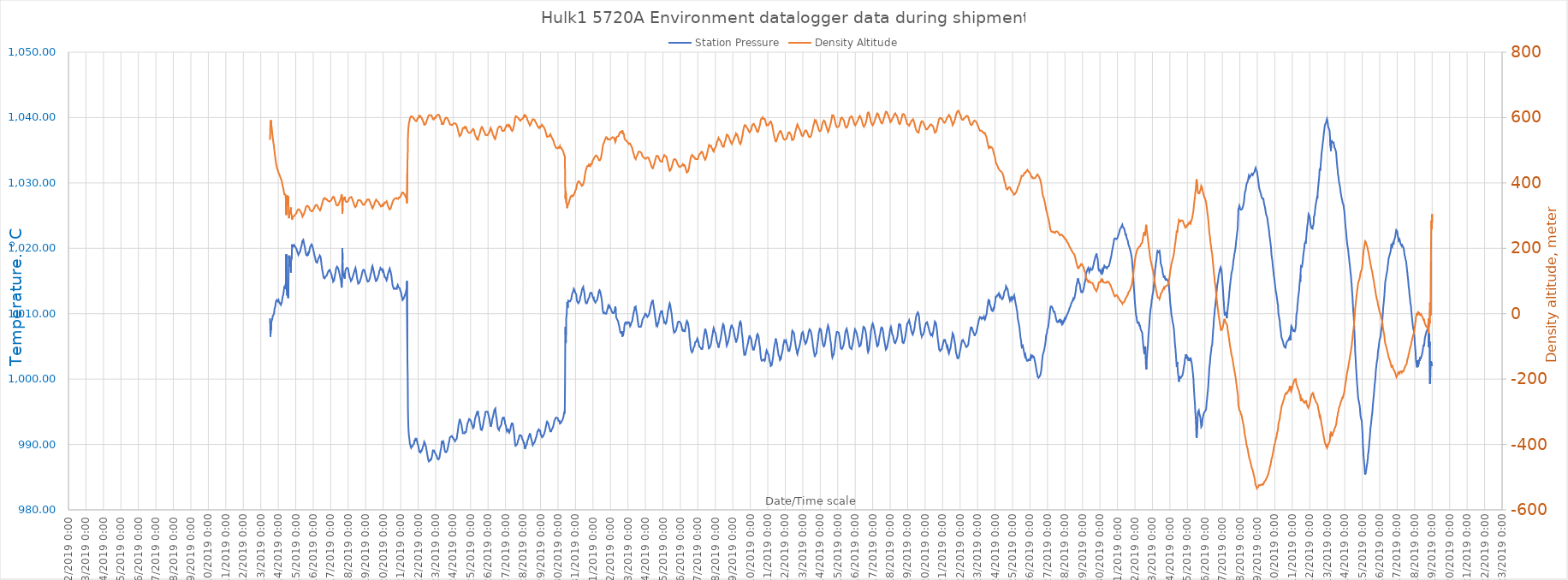
| Category | Station Pressure |
|---|---|
| 43751.52777777778 | 1009.3 |
| 43751.541666666664 | 1009.3 |
| 43751.555555555555 | 1006.5 |
| 43751.569444444445 | 1008 |
| 43751.583333333336 | 1007.5 |
| 43751.59722222222 | 1008.5 |
| 43751.61111111111 | 1008.8 |
| 43751.625 | 1008.8 |
| 43751.63888888889 | 1009 |
| 43751.65277777778 | 1009.1 |
| 43751.666666666664 | 1009.3 |
| 43751.680555555555 | 1009.6 |
| 43751.694444444445 | 1009.6 |
| 43751.708333333336 | 1009.7 |
| 43751.72222222222 | 1009.8 |
| 43751.73611111111 | 1009.8 |
| 43751.75 | 1009.9 |
| 43751.76388888889 | 1010.1 |
| 43751.77777777778 | 1010.6 |
| 43751.791666666664 | 1010.6 |
| 43751.805555555555 | 1010.9 |
| 43751.819444444445 | 1011 |
| 43751.833333333336 | 1011.2 |
| 43751.84722222222 | 1011.5 |
| 43751.86111111111 | 1011.6 |
| 43751.875 | 1011.9 |
| 43751.88888888889 | 1012 |
| 43751.90277777778 | 1012 |
| 43751.916666666664 | 1012.1 |
| 43751.930555555555 | 1012.2 |
| 43751.944444444445 | 1012.1 |
| 43751.958333333336 | 1012.1 |
| 43751.97222222222 | 1011.9 |
| 43751.98611111111 | 1011.8 |
| 43752.0 | 1011.9 |
| 43752.01388888889 | 1012.1 |
| 43752.02777777778 | 1012.1 |
| 43752.041666666664 | 1011.8 |
| 43752.055555555555 | 1011.7 |
| 43752.069444444445 | 1011.8 |
| 43752.083333333336 | 1011.6 |
| 43752.09722222222 | 1011.6 |
| 43752.11111111111 | 1011.6 |
| 43752.125 | 1011.6 |
| 43752.13888888889 | 1011.4 |
| 43752.15277777778 | 1011.7 |
| 43752.166666666664 | 1011.5 |
| 43752.180555555555 | 1011.6 |
| 43752.194444444445 | 1011.7 |
| 43752.208333333336 | 1011.9 |
| 43752.22222222222 | 1012.1 |
| 43752.23611111111 | 1012.3 |
| 43752.25 | 1012.6 |
| 43752.26388888889 | 1012.6 |
| 43752.27777777778 | 1012.8 |
| 43752.291666666664 | 1013 |
| 43752.305555555555 | 1013.3 |
| 43752.319444444445 | 1013.4 |
| 43752.333333333336 | 1013.8 |
| 43752.34722222222 | 1014.2 |
| 43752.36111111111 | 1014.2 |
| 43752.375 | 1014 |
| 43752.38888888889 | 1013.8 |
| 43752.40277777778 | 1013.7 |
| 43752.416666666664 | 1013.9 |
| 43752.430555555555 | 1014.6 |
| 43752.444444444445 | 1014.2 |
| 43752.458333333336 | 1019.1 |
| 43752.47222222222 | 1013.9 |
| 43752.48611111111 | 1013.5 |
| 43752.5 | 1012.8 |
| 43752.51388888889 | 1013 |
| 43752.52777777778 | 1013.1 |
| 43752.541666666664 | 1013.3 |
| 43752.555555555555 | 1013.8 |
| 43752.569444444445 | 1012.4 |
| 43752.583333333336 | 1014.2 |
| 43752.59722222222 | 1017.4 |
| 43752.61111111111 | 1018.9 |
| 43752.625 | 1018.3 |
| 43752.63888888889 | 1018 |
| 43752.65277777778 | 1018.1 |
| 43752.666666666664 | 1017.7 |
| 43752.680555555555 | 1017.7 |
| 43752.694444444445 | 1017.2 |
| 43752.708333333336 | 1017.5 |
| 43752.72222222222 | 1016.3 |
| 43752.73611111111 | 1018.3 |
| 43752.75 | 1018.7 |
| 43752.76388888889 | 1018.4 |
| 43752.77777777778 | 1019.4 |
| 43752.791666666664 | 1020.6 |
| 43752.805555555555 | 1020.2 |
| 43752.819444444445 | 1020.1 |
| 43752.833333333336 | 1020.1 |
| 43752.84722222222 | 1020.1 |
| 43752.86111111111 | 1020.3 |
| 43752.875 | 1020.3 |
| 43752.88888888889 | 1020.3 |
| 43752.90277777778 | 1020.5 |
| 43752.916666666664 | 1020.6 |
| 43752.930555555555 | 1020.6 |
| 43752.944444444445 | 1020.3 |
| 43752.958333333336 | 1020.4 |
| 43752.97222222222 | 1020.4 |
| 43752.98611111111 | 1020.2 |
| 43753.0 | 1020.1 |
| 43753.01388888889 | 1020 |
| 43753.02777777778 | 1020.1 |
| 43753.041666666664 | 1019.9 |
| 43753.055555555555 | 1019.9 |
| 43753.069444444445 | 1019.7 |
| 43753.083333333336 | 1019.6 |
| 43753.09722222222 | 1019.4 |
| 43753.11111111111 | 1019.4 |
| 43753.125 | 1019.2 |
| 43753.13888888889 | 1019.1 |
| 43753.15277777778 | 1019 |
| 43753.166666666664 | 1019.1 |
| 43753.180555555555 | 1019.2 |
| 43753.194444444445 | 1019.1 |
| 43753.208333333336 | 1019.2 |
| 43753.22222222222 | 1019.3 |
| 43753.23611111111 | 1019.4 |
| 43753.25 | 1019.5 |
| 43753.26388888889 | 1019.5 |
| 43753.27777777778 | 1019.5 |
| 43753.291666666664 | 1020 |
| 43753.305555555555 | 1020.2 |
| 43753.319444444445 | 1020.3 |
| 43753.333333333336 | 1020.4 |
| 43753.34722222222 | 1020.6 |
| 43753.36111111111 | 1020.8 |
| 43753.375 | 1021.1 |
| 43753.38888888889 | 1021 |
| 43753.40277777778 | 1021.2 |
| 43753.416666666664 | 1021.2 |
| 43753.430555555555 | 1021.3 |
| 43753.444444444445 | 1021.2 |
| 43753.458333333336 | 1021 |
| 43753.47222222222 | 1020.8 |
| 43753.48611111111 | 1020.6 |
| 43753.5 | 1020.4 |
| 43753.51388888889 | 1020.3 |
| 43753.52777777778 | 1020.1 |
| 43753.541666666664 | 1019.8 |
| 43753.555555555555 | 1019.5 |
| 43753.569444444445 | 1019.5 |
| 43753.583333333336 | 1019.2 |
| 43753.59722222222 | 1019 |
| 43753.61111111111 | 1019.1 |
| 43753.625 | 1018.9 |
| 43753.63888888889 | 1018.9 |
| 43753.65277777778 | 1018.9 |
| 43753.666666666664 | 1018.8 |
| 43753.680555555555 | 1019.1 |
| 43753.694444444445 | 1018.9 |
| 43753.708333333336 | 1019.2 |
| 43753.72222222222 | 1019.4 |
| 43753.73611111111 | 1019.2 |
| 43753.75 | 1019.3 |
| 43753.76388888889 | 1019.3 |
| 43753.77777777778 | 1019.6 |
| 43753.791666666664 | 1019.8 |
| 43753.805555555555 | 1020 |
| 43753.819444444445 | 1020.2 |
| 43753.833333333336 | 1020.3 |
| 43753.84722222222 | 1020.3 |
| 43753.86111111111 | 1020.4 |
| 43753.875 | 1020.5 |
| 43753.88888888889 | 1020.5 |
| 43753.90277777778 | 1020.6 |
| 43753.916666666664 | 1020.6 |
| 43753.930555555555 | 1020.5 |
| 43753.944444444445 | 1020.4 |
| 43753.958333333336 | 1020.2 |
| 43753.97222222222 | 1020.2 |
| 43753.98611111111 | 1020 |
| 43754.0 | 1019.8 |
| 43754.01388888889 | 1019.8 |
| 43754.02777777778 | 1019.5 |
| 43754.041666666664 | 1019.4 |
| 43754.055555555555 | 1019.1 |
| 43754.069444444445 | 1019 |
| 43754.083333333336 | 1018.8 |
| 43754.09722222222 | 1018.7 |
| 43754.11111111111 | 1018.6 |
| 43754.125 | 1018.3 |
| 43754.13888888889 | 1018.1 |
| 43754.15277777778 | 1018 |
| 43754.166666666664 | 1017.9 |
| 43754.180555555555 | 1017.9 |
| 43754.194444444445 | 1017.9 |
| 43754.208333333336 | 1017.8 |
| 43754.22222222222 | 1017.8 |
| 43754.23611111111 | 1017.9 |
| 43754.25 | 1018 |
| 43754.26388888889 | 1018.2 |
| 43754.27777777778 | 1018.3 |
| 43754.291666666664 | 1018.3 |
| 43754.305555555555 | 1018.5 |
| 43754.319444444445 | 1018.5 |
| 43754.333333333336 | 1018.6 |
| 43754.34722222222 | 1018.7 |
| 43754.36111111111 | 1018.7 |
| 43754.375 | 1018.9 |
| 43754.38888888889 | 1019 |
| 43754.40277777778 | 1018.9 |
| 43754.416666666664 | 1018.8 |
| 43754.430555555555 | 1018.6 |
| 43754.444444444445 | 1018.2 |
| 43754.458333333336 | 1017.9 |
| 43754.47222222222 | 1017.5 |
| 43754.48611111111 | 1017.3 |
| 43754.5 | 1017.1 |
| 43754.51388888889 | 1016.7 |
| 43754.52777777778 | 1016.6 |
| 43754.541666666664 | 1016.4 |
| 43754.555555555555 | 1016.1 |
| 43754.569444444445 | 1015.9 |
| 43754.583333333336 | 1015.7 |
| 43754.59722222222 | 1015.5 |
| 43754.61111111111 | 1015.5 |
| 43754.625 | 1015.4 |
| 43754.63888888889 | 1015.4 |
| 43754.65277777778 | 1015.4 |
| 43754.666666666664 | 1015.5 |
| 43754.680555555555 | 1015.5 |
| 43754.694444444445 | 1015.4 |
| 43754.708333333336 | 1015.7 |
| 43754.72222222222 | 1015.6 |
| 43754.73611111111 | 1015.7 |
| 43754.75 | 1015.7 |
| 43754.76388888889 | 1015.8 |
| 43754.77777777778 | 1015.9 |
| 43754.791666666664 | 1016 |
| 43754.805555555555 | 1016.1 |
| 43754.819444444445 | 1016.2 |
| 43754.833333333336 | 1016.2 |
| 43754.84722222222 | 1016.4 |
| 43754.86111111111 | 1016.4 |
| 43754.875 | 1016.5 |
| 43754.88888888889 | 1016.6 |
| 43754.90277777778 | 1016.5 |
| 43754.916666666664 | 1016.6 |
| 43754.930555555555 | 1016.7 |
| 43754.944444444445 | 1016.7 |
| 43754.958333333336 | 1016.5 |
| 43754.97222222222 | 1016.4 |
| 43754.98611111111 | 1016.4 |
| 43755.0 | 1016.3 |
| 43755.01388888889 | 1016.3 |
| 43755.02777777778 | 1016.1 |
| 43755.041666666664 | 1016.1 |
| 43755.055555555555 | 1015.9 |
| 43755.069444444445 | 1015.6 |
| 43755.083333333336 | 1015.5 |
| 43755.09722222222 | 1015.4 |
| 43755.11111111111 | 1015.3 |
| 43755.125 | 1015.2 |
| 43755.13888888889 | 1014.9 |
| 43755.15277777778 | 1015 |
| 43755.166666666664 | 1014.9 |
| 43755.180555555555 | 1015 |
| 43755.194444444445 | 1015.1 |
| 43755.208333333336 | 1015.4 |
| 43755.22222222222 | 1015.5 |
| 43755.23611111111 | 1015.7 |
| 43755.25 | 1016 |
| 43755.26388888889 | 1016.1 |
| 43755.27777777778 | 1016.3 |
| 43755.291666666664 | 1016.4 |
| 43755.305555555555 | 1016.9 |
| 43755.319444444445 | 1016.8 |
| 43755.333333333336 | 1016.9 |
| 43755.34722222222 | 1017 |
| 43755.36111111111 | 1017.2 |
| 43755.375 | 1017.1 |
| 43755.38888888889 | 1017.2 |
| 43755.40277777778 | 1017.2 |
| 43755.416666666664 | 1017 |
| 43755.430555555555 | 1017 |
| 43755.444444444445 | 1016.9 |
| 43755.458333333336 | 1016.9 |
| 43755.47222222222 | 1016.5 |
| 43755.48611111111 | 1016.4 |
| 43755.5 | 1016.1 |
| 43755.51388888889 | 1016 |
| 43755.52777777778 | 1015.8 |
| 43755.541666666664 | 1015.5 |
| 43755.555555555555 | 1015.5 |
| 43755.569444444445 | 1015.3 |
| 43755.583333333336 | 1015.1 |
| 43755.59722222222 | 1015.2 |
| 43755.61111111111 | 1015 |
| 43755.625 | 1014 |
| 43755.63888888889 | 1014.3 |
| 43755.65277777778 | 1015 |
| 43755.666666666664 | 1020 |
| 43755.680555555555 | 1018.2 |
| 43755.694444444445 | 1016.7 |
| 43755.708333333336 | 1016 |
| 43755.72222222222 | 1016 |
| 43755.73611111111 | 1015.8 |
| 43755.75 | 1015.8 |
| 43755.76388888889 | 1015.8 |
| 43755.77777777778 | 1015.8 |
| 43755.791666666664 | 1016.2 |
| 43755.805555555555 | 1015.4 |
| 43755.819444444445 | 1016.1 |
| 43755.833333333336 | 1016.5 |
| 43755.84722222222 | 1016.6 |
| 43755.86111111111 | 1016.8 |
| 43755.875 | 1016.9 |
| 43755.88888888889 | 1016.9 |
| 43755.90277777778 | 1016.9 |
| 43755.916666666664 | 1017 |
| 43755.930555555555 | 1017.1 |
| 43755.944444444445 | 1017.1 |
| 43755.958333333336 | 1017 |
| 43755.97222222222 | 1017 |
| 43755.98611111111 | 1016.9 |
| 43756.0 | 1016.8 |
| 43756.01388888889 | 1016.5 |
| 43756.02777777778 | 1016.3 |
| 43756.041666666664 | 1016.2 |
| 43756.055555555555 | 1016 |
| 43756.069444444445 | 1015.7 |
| 43756.083333333336 | 1015.6 |
| 43756.09722222222 | 1015.6 |
| 43756.11111111111 | 1015.4 |
| 43756.125 | 1015.3 |
| 43756.13888888889 | 1015.2 |
| 43756.15277777778 | 1015 |
| 43756.166666666664 | 1015 |
| 43756.180555555555 | 1015 |
| 43756.194444444445 | 1015 |
| 43756.208333333336 | 1015.2 |
| 43756.22222222222 | 1015.3 |
| 43756.23611111111 | 1015.4 |
| 43756.25 | 1015.6 |
| 43756.26388888889 | 1015.6 |
| 43756.27777777778 | 1015.7 |
| 43756.291666666664 | 1015.9 |
| 43756.305555555555 | 1016 |
| 43756.319444444445 | 1016.2 |
| 43756.333333333336 | 1016.3 |
| 43756.34722222222 | 1016.4 |
| 43756.36111111111 | 1016.6 |
| 43756.375 | 1016.7 |
| 43756.38888888889 | 1016.8 |
| 43756.40277777778 | 1016.9 |
| 43756.416666666664 | 1017 |
| 43756.430555555555 | 1016.9 |
| 43756.444444444445 | 1016.6 |
| 43756.458333333336 | 1016.4 |
| 43756.47222222222 | 1016.1 |
| 43756.48611111111 | 1015.9 |
| 43756.5 | 1015.6 |
| 43756.51388888889 | 1015.3 |
| 43756.52777777778 | 1015.2 |
| 43756.541666666664 | 1015 |
| 43756.555555555555 | 1014.8 |
| 43756.569444444445 | 1014.6 |
| 43756.583333333336 | 1014.6 |
| 43756.59722222222 | 1014.5 |
| 43756.61111111111 | 1014.5 |
| 43756.625 | 1014.7 |
| 43756.63888888889 | 1014.8 |
| 43756.65277777778 | 1014.8 |
| 43756.666666666664 | 1014.9 |
| 43756.680555555555 | 1015 |
| 43756.694444444445 | 1015.2 |
| 43756.708333333336 | 1015.3 |
| 43756.72222222222 | 1015.4 |
| 43756.73611111111 | 1015.5 |
| 43756.75 | 1015.6 |
| 43756.76388888889 | 1015.8 |
| 43756.77777777778 | 1016 |
| 43756.791666666664 | 1016 |
| 43756.805555555555 | 1016.3 |
| 43756.819444444445 | 1016.5 |
| 43756.833333333336 | 1016.6 |
| 43756.84722222222 | 1016.6 |
| 43756.86111111111 | 1016.7 |
| 43756.875 | 1016.8 |
| 43756.88888888889 | 1016.7 |
| 43756.90277777778 | 1016.6 |
| 43756.916666666664 | 1016.7 |
| 43756.930555555555 | 1016.6 |
| 43756.944444444445 | 1016.5 |
| 43756.958333333336 | 1016.3 |
| 43756.97222222222 | 1016.2 |
| 43756.98611111111 | 1016 |
| 43757.0 | 1016 |
| 43757.01388888889 | 1015.8 |
| 43757.02777777778 | 1015.8 |
| 43757.041666666664 | 1015.6 |
| 43757.055555555555 | 1015.4 |
| 43757.069444444445 | 1015.4 |
| 43757.083333333336 | 1015.1 |
| 43757.09722222222 | 1015.2 |
| 43757.11111111111 | 1015 |
| 43757.125 | 1014.9 |
| 43757.13888888889 | 1015 |
| 43757.15277777778 | 1015 |
| 43757.166666666664 | 1015 |
| 43757.180555555555 | 1015 |
| 43757.194444444445 | 1015 |
| 43757.208333333336 | 1015.2 |
| 43757.22222222222 | 1015.3 |
| 43757.23611111111 | 1015.4 |
| 43757.25 | 1015.6 |
| 43757.26388888889 | 1015.8 |
| 43757.27777777778 | 1016 |
| 43757.291666666664 | 1016.1 |
| 43757.305555555555 | 1016.2 |
| 43757.319444444445 | 1016.3 |
| 43757.333333333336 | 1016.6 |
| 43757.34722222222 | 1016.7 |
| 43757.36111111111 | 1017.1 |
| 43757.375 | 1017.1 |
| 43757.38888888889 | 1017.3 |
| 43757.40277777778 | 1017.2 |
| 43757.416666666664 | 1017 |
| 43757.430555555555 | 1016.8 |
| 43757.444444444445 | 1016.8 |
| 43757.458333333336 | 1016.5 |
| 43757.47222222222 | 1016.3 |
| 43757.48611111111 | 1016.2 |
| 43757.5 | 1015.9 |
| 43757.51388888889 | 1015.9 |
| 43757.52777777778 | 1015.6 |
| 43757.541666666664 | 1015.5 |
| 43757.555555555555 | 1015.3 |
| 43757.569444444445 | 1015.2 |
| 43757.583333333336 | 1015 |
| 43757.59722222222 | 1014.9 |
| 43757.61111111111 | 1015 |
| 43757.625 | 1015.1 |
| 43757.63888888889 | 1015.1 |
| 43757.65277777778 | 1015.3 |
| 43757.666666666664 | 1015.3 |
| 43757.680555555555 | 1015.3 |
| 43757.694444444445 | 1015.5 |
| 43757.708333333336 | 1015.7 |
| 43757.72222222222 | 1015.7 |
| 43757.73611111111 | 1015.8 |
| 43757.75 | 1016 |
| 43757.76388888889 | 1016.2 |
| 43757.77777777778 | 1016.5 |
| 43757.791666666664 | 1016.6 |
| 43757.805555555555 | 1016.6 |
| 43757.819444444445 | 1016.7 |
| 43757.833333333336 | 1016.8 |
| 43757.84722222222 | 1017 |
| 43757.86111111111 | 1017.1 |
| 43757.875 | 1017.1 |
| 43757.88888888889 | 1017.1 |
| 43757.90277777778 | 1016.8 |
| 43757.916666666664 | 1016.9 |
| 43757.930555555555 | 1016.8 |
| 43757.944444444445 | 1016.7 |
| 43757.958333333336 | 1016.5 |
| 43757.97222222222 | 1016.6 |
| 43757.98611111111 | 1016.7 |
| 43758.0 | 1016.6 |
| 43758.01388888889 | 1016.5 |
| 43758.02777777778 | 1016.4 |
| 43758.041666666664 | 1016.1 |
| 43758.055555555555 | 1016 |
| 43758.069444444445 | 1015.9 |
| 43758.083333333336 | 1015.6 |
| 43758.09722222222 | 1015.6 |
| 43758.11111111111 | 1015.6 |
| 43758.125 | 1015.6 |
| 43758.13888888889 | 1015.5 |
| 43758.15277777778 | 1015.4 |
| 43758.166666666664 | 1015.3 |
| 43758.180555555555 | 1015.2 |
| 43758.194444444445 | 1015.1 |
| 43758.208333333336 | 1015.2 |
| 43758.22222222222 | 1015.3 |
| 43758.23611111111 | 1015.5 |
| 43758.25 | 1015.6 |
| 43758.26388888889 | 1016 |
| 43758.27777777778 | 1016 |
| 43758.291666666664 | 1016.2 |
| 43758.305555555555 | 1016.1 |
| 43758.319444444445 | 1016.3 |
| 43758.333333333336 | 1016.6 |
| 43758.34722222222 | 1016.5 |
| 43758.36111111111 | 1016.6 |
| 43758.375 | 1016.9 |
| 43758.38888888889 | 1016.9 |
| 43758.40277777778 | 1016.6 |
| 43758.416666666664 | 1016.6 |
| 43758.430555555555 | 1016.4 |
| 43758.444444444445 | 1016.2 |
| 43758.458333333336 | 1016 |
| 43758.47222222222 | 1015.8 |
| 43758.48611111111 | 1015.5 |
| 43758.5 | 1015.1 |
| 43758.51388888889 | 1014.9 |
| 43758.52777777778 | 1014.5 |
| 43758.541666666664 | 1014.4 |
| 43758.555555555555 | 1014.2 |
| 43758.569444444445 | 1014.2 |
| 43758.583333333336 | 1014 |
| 43758.59722222222 | 1013.9 |
| 43758.61111111111 | 1013.8 |
| 43758.625 | 1013.8 |
| 43758.63888888889 | 1013.8 |
| 43758.65277777778 | 1013.8 |
| 43758.666666666664 | 1013.9 |
| 43758.680555555555 | 1013.9 |
| 43758.694444444445 | 1013.8 |
| 43758.708333333336 | 1013.8 |
| 43758.72222222222 | 1013.8 |
| 43758.73611111111 | 1013.8 |
| 43758.75 | 1013.8 |
| 43758.76388888889 | 1013.9 |
| 43758.77777777778 | 1013.8 |
| 43758.791666666664 | 1013.9 |
| 43758.805555555555 | 1014.2 |
| 43758.819444444445 | 1014.2 |
| 43758.833333333336 | 1014.4 |
| 43758.84722222222 | 1014.3 |
| 43758.86111111111 | 1014.2 |
| 43758.875 | 1014.1 |
| 43758.88888888889 | 1014 |
| 43758.90277777778 | 1014 |
| 43758.916666666664 | 1014 |
| 43758.930555555555 | 1014 |
| 43758.944444444445 | 1013.9 |
| 43758.958333333336 | 1013.8 |
| 43758.97222222222 | 1013.9 |
| 43758.98611111111 | 1013.5 |
| 43759.0 | 1013.5 |
| 43759.01388888889 | 1013.5 |
| 43759.02777777778 | 1013.2 |
| 43759.041666666664 | 1013 |
| 43759.055555555555 | 1012.7 |
| 43759.069444444445 | 1012.7 |
| 43759.083333333336 | 1012.5 |
| 43759.09722222222 | 1012.3 |
| 43759.11111111111 | 1012.1 |
| 43759.125 | 1012.2 |
| 43759.13888888889 | 1012.2 |
| 43759.15277777778 | 1012.2 |
| 43759.166666666664 | 1012.3 |
| 43759.180555555555 | 1012.3 |
| 43759.194444444445 | 1012.4 |
| 43759.208333333336 | 1012.6 |
| 43759.22222222222 | 1012.6 |
| 43759.23611111111 | 1012.7 |
| 43759.25 | 1012.9 |
| 43759.26388888889 | 1013 |
| 43759.27777777778 | 1013 |
| 43759.291666666664 | 1013.2 |
| 43759.305555555555 | 1013.4 |
| 43759.319444444445 | 1013.6 |
| 43759.333333333336 | 1013.8 |
| 43759.34722222222 | 1014 |
| 43759.36111111111 | 1015 |
| 43759.375 | 1015 |
| 43759.38888888889 | 1002.5 |
| 43759.40277777778 | 1000.6 |
| 43759.416666666664 | 995.5 |
| 43759.430555555555 | 993.6 |
| 43759.444444444445 | 992.5 |
| 43759.458333333336 | 991.9 |
| 43759.47222222222 | 991.4 |
| 43759.48611111111 | 991.1 |
| 43759.5 | 990.8 |
| 43759.51388888889 | 990.5 |
| 43759.52777777778 | 990.1 |
| 43759.541666666664 | 990 |
| 43759.555555555555 | 989.9 |
| 43759.569444444445 | 989.7 |
| 43759.583333333336 | 989.6 |
| 43759.59722222222 | 989.5 |
| 43759.61111111111 | 989.6 |
| 43759.625 | 989.7 |
| 43759.63888888889 | 989.6 |
| 43759.65277777778 | 989.7 |
| 43759.666666666664 | 989.6 |
| 43759.680555555555 | 989.7 |
| 43759.694444444445 | 989.8 |
| 43759.708333333336 | 990 |
| 43759.72222222222 | 990 |
| 43759.73611111111 | 990.1 |
| 43759.75 | 990.1 |
| 43759.76388888889 | 990.1 |
| 43759.77777777778 | 990.3 |
| 43759.791666666664 | 990.5 |
| 43759.805555555555 | 990.7 |
| 43759.819444444445 | 990.5 |
| 43759.833333333336 | 990.7 |
| 43759.84722222222 | 990.9 |
| 43759.86111111111 | 990.9 |
| 43759.875 | 990.9 |
| 43759.88888888889 | 991 |
| 43759.90277777778 | 990.9 |
| 43759.916666666664 | 990.8 |
| 43759.930555555555 | 990.6 |
| 43759.944444444445 | 990.4 |
| 43759.958333333336 | 990.2 |
| 43759.97222222222 | 990.2 |
| 43759.98611111111 | 990.1 |
| 43760.0 | 989.9 |
| 43760.01388888889 | 989.7 |
| 43760.02777777778 | 989.6 |
| 43760.041666666664 | 989.3 |
| 43760.055555555555 | 989.2 |
| 43760.069444444445 | 988.9 |
| 43760.083333333336 | 988.9 |
| 43760.09722222222 | 988.8 |
| 43760.11111111111 | 989 |
| 43760.125 | 988.8 |
| 43760.13888888889 | 989.1 |
| 43760.15277777778 | 989 |
| 43760.166666666664 | 988.9 |
| 43760.180555555555 | 988.9 |
| 43760.194444444445 | 989 |
| 43760.208333333336 | 989.1 |
| 43760.22222222222 | 989.2 |
| 43760.23611111111 | 989.2 |
| 43760.25 | 989.4 |
| 43760.26388888889 | 989.6 |
| 43760.27777777778 | 989.7 |
| 43760.291666666664 | 989.8 |
| 43760.305555555555 | 989.9 |
| 43760.319444444445 | 990 |
| 43760.333333333336 | 990.1 |
| 43760.34722222222 | 990.4 |
| 43760.36111111111 | 990.5 |
| 43760.375 | 990.4 |
| 43760.38888888889 | 990.4 |
| 43760.40277777778 | 990.1 |
| 43760.416666666664 | 990 |
| 43760.430555555555 | 990 |
| 43760.444444444445 | 989.7 |
| 43760.458333333336 | 989.5 |
| 43760.47222222222 | 989.4 |
| 43760.48611111111 | 989.4 |
| 43760.5 | 988.8 |
| 43760.51388888889 | 988.7 |
| 43760.52777777778 | 988.4 |
| 43760.541666666664 | 988.3 |
| 43760.555555555555 | 988 |
| 43760.569444444445 | 987.8 |
| 43760.583333333336 | 987.6 |
| 43760.59722222222 | 987.6 |
| 43760.61111111111 | 987.4 |
| 43760.625 | 987.4 |
| 43760.63888888889 | 987.4 |
| 43760.65277777778 | 987.4 |
| 43760.666666666664 | 987.5 |
| 43760.680555555555 | 987.5 |
| 43760.694444444445 | 987.7 |
| 43760.708333333336 | 987.7 |
| 43760.72222222222 | 987.7 |
| 43760.73611111111 | 987.8 |
| 43760.75 | 987.7 |
| 43760.76388888889 | 987.9 |
| 43760.77777777778 | 987.9 |
| 43760.791666666664 | 988.2 |
| 43760.805555555555 | 988.4 |
| 43760.819444444445 | 988.5 |
| 43760.833333333336 | 988.9 |
| 43760.84722222222 | 989.1 |
| 43760.86111111111 | 989.2 |
| 43760.875 | 989.1 |
| 43760.88888888889 | 989.2 |
| 43760.90277777778 | 989.1 |
| 43760.916666666664 | 989 |
| 43760.930555555555 | 988.9 |
| 43760.944444444445 | 989 |
| 43760.958333333336 | 989 |
| 43760.97222222222 | 988.7 |
| 43760.98611111111 | 988.8 |
| 43761.0 | 988.7 |
| 43761.01388888889 | 988.6 |
| 43761.02777777778 | 988.4 |
| 43761.041666666664 | 988.4 |
| 43761.055555555555 | 988.3 |
| 43761.069444444445 | 988.2 |
| 43761.083333333336 | 988 |
| 43761.09722222222 | 987.9 |
| 43761.11111111111 | 987.8 |
| 43761.125 | 987.7 |
| 43761.13888888889 | 987.7 |
| 43761.15277777778 | 987.7 |
| 43761.166666666664 | 987.7 |
| 43761.180555555555 | 987.8 |
| 43761.194444444445 | 987.8 |
| 43761.208333333336 | 987.8 |
| 43761.22222222222 | 988 |
| 43761.23611111111 | 988.1 |
| 43761.25 | 988.5 |
| 43761.26388888889 | 988.7 |
| 43761.27777777778 | 989 |
| 43761.291666666664 | 989.1 |
| 43761.305555555555 | 989.3 |
| 43761.319444444445 | 989.5 |
| 43761.333333333336 | 989.7 |
| 43761.34722222222 | 990.5 |
| 43761.36111111111 | 990.1 |
| 43761.375 | 990.3 |
| 43761.38888888889 | 990.4 |
| 43761.40277777778 | 990.4 |
| 43761.416666666664 | 990.4 |
| 43761.430555555555 | 990.5 |
| 43761.444444444445 | 990.4 |
| 43761.458333333336 | 990.3 |
| 43761.47222222222 | 990 |
| 43761.48611111111 | 989.8 |
| 43761.5 | 989.5 |
| 43761.51388888889 | 989.2 |
| 43761.52777777778 | 989.2 |
| 43761.541666666664 | 988.9 |
| 43761.555555555555 | 988.9 |
| 43761.569444444445 | 988.8 |
| 43761.583333333336 | 988.8 |
| 43761.59722222222 | 988.8 |
| 43761.61111111111 | 988.8 |
| 43761.625 | 988.9 |
| 43761.63888888889 | 988.9 |
| 43761.65277777778 | 989 |
| 43761.666666666664 | 989.1 |
| 43761.680555555555 | 989.3 |
| 43761.694444444445 | 989.3 |
| 43761.708333333336 | 989.6 |
| 43761.72222222222 | 989.8 |
| 43761.73611111111 | 989.9 |
| 43761.75 | 990.2 |
| 43761.76388888889 | 990.2 |
| 43761.77777777778 | 990.5 |
| 43761.791666666664 | 990.7 |
| 43761.805555555555 | 990.9 |
| 43761.819444444445 | 991.1 |
| 43761.833333333336 | 991.2 |
| 43761.84722222222 | 991.1 |
| 43761.86111111111 | 991.1 |
| 43761.875 | 991.2 |
| 43761.88888888889 | 991.1 |
| 43761.90277777778 | 991.1 |
| 43761.916666666664 | 991.3 |
| 43761.930555555555 | 991.3 |
| 43761.944444444445 | 991.2 |
| 43761.958333333336 | 991.1 |
| 43761.97222222222 | 991.1 |
| 43761.98611111111 | 991.1 |
| 43762.0 | 991 |
| 43762.01388888889 | 991 |
| 43762.02777777778 | 990.8 |
| 43762.041666666664 | 990.7 |
| 43762.055555555555 | 990.7 |
| 43762.069444444445 | 990.7 |
| 43762.083333333336 | 990.7 |
| 43762.09722222222 | 990.6 |
| 43762.11111111111 | 990.5 |
| 43762.125 | 990.6 |
| 43762.13888888889 | 990.6 |
| 43762.15277777778 | 990.7 |
| 43762.166666666664 | 990.7 |
| 43762.180555555555 | 990.7 |
| 43762.194444444445 | 990.8 |
| 43762.208333333336 | 990.9 |
| 43762.22222222222 | 991.2 |
| 43762.23611111111 | 991.5 |
| 43762.25 | 991.6 |
| 43762.26388888889 | 991.9 |
| 43762.27777777778 | 992.2 |
| 43762.291666666664 | 992.5 |
| 43762.305555555555 | 992.9 |
| 43762.319444444445 | 993 |
| 43762.333333333336 | 993.2 |
| 43762.34722222222 | 993.4 |
| 43762.36111111111 | 993.6 |
| 43762.375 | 993.9 |
| 43762.38888888889 | 993.7 |
| 43762.40277777778 | 993.8 |
| 43762.416666666664 | 993.8 |
| 43762.430555555555 | 993.5 |
| 43762.444444444445 | 993.5 |
| 43762.458333333336 | 993.2 |
| 43762.47222222222 | 993.3 |
| 43762.48611111111 | 992.9 |
| 43762.5 | 992.6 |
| 43762.51388888889 | 992.4 |
| 43762.52777777778 | 992.2 |
| 43762.541666666664 | 992 |
| 43762.555555555555 | 991.7 |
| 43762.569444444445 | 991.7 |
| 43762.583333333336 | 991.7 |
| 43762.59722222222 | 991.7 |
| 43762.61111111111 | 991.7 |
| 43762.625 | 991.7 |
| 43762.63888888889 | 991.7 |
| 43762.65277777778 | 991.7 |
| 43762.666666666664 | 991.7 |
| 43762.680555555555 | 991.9 |
| 43762.694444444445 | 991.9 |
| 43762.708333333336 | 992 |
| 43762.72222222222 | 992 |
| 43762.73611111111 | 991.9 |
| 43762.75 | 992.1 |
| 43762.76388888889 | 992.3 |
| 43762.77777777778 | 992.5 |
| 43762.791666666664 | 992.7 |
| 43762.805555555555 | 993 |
| 43762.819444444445 | 993.1 |
| 43762.833333333336 | 993.3 |
| 43762.84722222222 | 993.2 |
| 43762.86111111111 | 993.4 |
| 43762.875 | 993.5 |
| 43762.88888888889 | 993.7 |
| 43762.90277777778 | 993.7 |
| 43762.916666666664 | 993.9 |
| 43762.930555555555 | 993.8 |
| 43762.944444444445 | 993.9 |
| 43762.958333333336 | 993.8 |
| 43762.97222222222 | 993.8 |
| 43762.98611111111 | 993.9 |
| 43763.0 | 993.8 |
| 43763.01388888889 | 993.6 |
| 43763.02777777778 | 993.5 |
| 43763.041666666664 | 993.4 |
| 43763.055555555555 | 993.3 |
| 43763.069444444445 | 993.1 |
| 43763.083333333336 | 993.1 |
| 43763.09722222222 | 992.9 |
| 43763.11111111111 | 992.9 |
| 43763.125 | 992.8 |
| 43763.13888888889 | 992.5 |
| 43763.15277777778 | 992.6 |
| 43763.166666666664 | 992.6 |
| 43763.180555555555 | 992.5 |
| 43763.194444444445 | 992.7 |
| 43763.208333333336 | 993 |
| 43763.22222222222 | 993.3 |
| 43763.23611111111 | 993.7 |
| 43763.25 | 993.7 |
| 43763.26388888889 | 994 |
| 43763.27777777778 | 994.1 |
| 43763.291666666664 | 994.3 |
| 43763.305555555555 | 994.4 |
| 43763.319444444445 | 994.4 |
| 43763.333333333336 | 994.6 |
| 43763.34722222222 | 994.7 |
| 43763.36111111111 | 994.7 |
| 43763.375 | 995 |
| 43763.38888888889 | 995 |
| 43763.40277777778 | 994.9 |
| 43763.416666666664 | 995 |
| 43763.430555555555 | 995 |
| 43763.444444444445 | 994.4 |
| 43763.458333333336 | 994.5 |
| 43763.47222222222 | 994.4 |
| 43763.48611111111 | 994.2 |
| 43763.5 | 993.8 |
| 43763.51388888889 | 993.7 |
| 43763.52777777778 | 993.3 |
| 43763.541666666664 | 993.1 |
| 43763.555555555555 | 992.9 |
| 43763.569444444445 | 992.6 |
| 43763.583333333336 | 992.3 |
| 43763.59722222222 | 992.3 |
| 43763.61111111111 | 992.2 |
| 43763.625 | 992.3 |
| 43763.63888888889 | 992.2 |
| 43763.65277777778 | 992.2 |
| 43763.666666666664 | 992.3 |
| 43763.680555555555 | 992.5 |
| 43763.694444444445 | 992.6 |
| 43763.708333333336 | 992.9 |
| 43763.72222222222 | 993 |
| 43763.73611111111 | 993.3 |
| 43763.75 | 993.5 |
| 43763.76388888889 | 993.7 |
| 43763.77777777778 | 993.8 |
| 43763.791666666664 | 994.1 |
| 43763.805555555555 | 994.2 |
| 43763.819444444445 | 994.3 |
| 43763.833333333336 | 994.7 |
| 43763.84722222222 | 994.8 |
| 43763.86111111111 | 995 |
| 43763.875 | 995 |
| 43763.88888888889 | 995 |
| 43763.90277777778 | 995.1 |
| 43763.916666666664 | 995 |
| 43763.930555555555 | 994.9 |
| 43763.944444444445 | 994.9 |
| 43763.958333333336 | 994.9 |
| 43763.97222222222 | 995 |
| 43763.98611111111 | 994.9 |
| 43764.0 | 994.8 |
| 43764.01388888889 | 994.6 |
| 43764.02777777778 | 994.5 |
| 43764.041666666664 | 994.4 |
| 43764.055555555555 | 994.1 |
| 43764.069444444445 | 994.2 |
| 43764.083333333336 | 993.9 |
| 43764.09722222222 | 993.5 |
| 43764.11111111111 | 993.3 |
| 43764.125 | 993.1 |
| 43764.13888888889 | 992.9 |
| 43764.15277777778 | 992.7 |
| 43764.166666666664 | 992.7 |
| 43764.180555555555 | 992.7 |
| 43764.194444444445 | 992.7 |
| 43764.208333333336 | 993.3 |
| 43764.22222222222 | 993.3 |
| 43764.23611111111 | 993.8 |
| 43764.25 | 993.9 |
| 43764.26388888889 | 993.9 |
| 43764.27777777778 | 994.2 |
| 43764.291666666664 | 994.2 |
| 43764.305555555555 | 994.6 |
| 43764.319444444445 | 994.8 |
| 43764.333333333336 | 994.8 |
| 43764.34722222222 | 995 |
| 43764.36111111111 | 995.3 |
| 43764.375 | 995.3 |
| 43764.38888888889 | 995.3 |
| 43764.40277777778 | 995.4 |
| 43764.416666666664 | 995.5 |
| 43764.430555555555 | 995 |
| 43764.444444444445 | 994.8 |
| 43764.458333333336 | 994.4 |
| 43764.47222222222 | 994.3 |
| 43764.48611111111 | 994 |
| 43764.5 | 993.7 |
| 43764.51388888889 | 993.4 |
| 43764.52777777778 | 993.1 |
| 43764.541666666664 | 992.8 |
| 43764.555555555555 | 992.7 |
| 43764.569444444445 | 992.4 |
| 43764.583333333336 | 992.4 |
| 43764.59722222222 | 992.4 |
| 43764.61111111111 | 992.3 |
| 43764.625 | 992.2 |
| 43764.63888888889 | 992.4 |
| 43764.65277777778 | 992.5 |
| 43764.666666666664 | 992.4 |
| 43764.680555555555 | 992.5 |
| 43764.694444444445 | 992.7 |
| 43764.708333333336 | 992.7 |
| 43764.72222222222 | 992.7 |
| 43764.73611111111 | 992.9 |
| 43764.75 | 992.9 |
| 43764.76388888889 | 993.1 |
| 43764.77777777778 | 993.5 |
| 43764.791666666664 | 993.5 |
| 43764.805555555555 | 993.7 |
| 43764.819444444445 | 994 |
| 43764.833333333336 | 994 |
| 43764.84722222222 | 994 |
| 43764.86111111111 | 994 |
| 43764.875 | 994 |
| 43764.88888888889 | 994.2 |
| 43764.90277777778 | 994 |
| 43764.916666666664 | 994.1 |
| 43764.930555555555 | 994 |
| 43764.944444444445 | 993.9 |
| 43764.958333333336 | 993.6 |
| 43764.97222222222 | 993.2 |
| 43764.98611111111 | 993.2 |
| 43765.0 | 993 |
| 43765.01388888889 | 992.9 |
| 43765.02777777778 | 992.8 |
| 43765.041666666664 | 992.6 |
| 43765.055555555555 | 992.3 |
| 43765.069444444445 | 992.1 |
| 43765.083333333336 | 992 |
| 43765.09722222222 | 992.3 |
| 43765.11111111111 | 992.3 |
| 43765.125 | 992.3 |
| 43765.13888888889 | 992.2 |
| 43765.15277777778 | 992.3 |
| 43765.166666666664 | 992 |
| 43765.180555555555 | 992 |
| 43765.194444444445 | 992.1 |
| 43765.208333333336 | 991.8 |
| 43765.22222222222 | 991.9 |
| 43765.23611111111 | 991.8 |
| 43765.25 | 992.1 |
| 43765.26388888889 | 992.1 |
| 43765.27777777778 | 992.3 |
| 43765.291666666664 | 992.6 |
| 43765.305555555555 | 992.8 |
| 43765.319444444445 | 992.9 |
| 43765.333333333336 | 993 |
| 43765.34722222222 | 993.2 |
| 43765.36111111111 | 993.2 |
| 43765.375 | 993.3 |
| 43765.38888888889 | 993.3 |
| 43765.40277777778 | 993.2 |
| 43765.416666666664 | 993.1 |
| 43765.430555555555 | 992.9 |
| 43765.444444444445 | 992.6 |
| 43765.458333333336 | 992.3 |
| 43765.47222222222 | 992.1 |
| 43765.48611111111 | 991.8 |
| 43765.5 | 991.4 |
| 43765.51388888889 | 991 |
| 43765.52777777778 | 990.7 |
| 43765.541666666664 | 990.1 |
| 43765.555555555555 | 990 |
| 43765.569444444445 | 989.8 |
| 43765.583333333336 | 989.7 |
| 43765.59722222222 | 989.8 |
| 43765.61111111111 | 989.9 |
| 43765.625 | 989.9 |
| 43765.63888888889 | 990 |
| 43765.65277777778 | 990 |
| 43765.666666666664 | 990.1 |
| 43765.680555555555 | 990.2 |
| 43765.694444444445 | 990.3 |
| 43765.708333333336 | 990.6 |
| 43765.72222222222 | 990.6 |
| 43765.73611111111 | 990.7 |
| 43765.75 | 990.8 |
| 43765.76388888889 | 991 |
| 43765.77777777778 | 991.2 |
| 43765.791666666664 | 991.2 |
| 43765.805555555555 | 991.4 |
| 43765.819444444445 | 991.4 |
| 43765.833333333336 | 991.4 |
| 43765.84722222222 | 991.5 |
| 43765.86111111111 | 991.4 |
| 43765.875 | 991.5 |
| 43765.88888888889 | 991.3 |
| 43765.90277777778 | 991.4 |
| 43765.916666666664 | 991.3 |
| 43765.930555555555 | 991.1 |
| 43765.944444444445 | 990.9 |
| 43765.958333333336 | 991 |
| 43765.97222222222 | 990.9 |
| 43765.98611111111 | 990.9 |
| 43766.0 | 990.6 |
| 43766.01388888889 | 990.5 |
| 43766.02777777778 | 990.4 |
| 43766.041666666664 | 990.1 |
| 43766.055555555555 | 990.3 |
| 43766.069444444445 | 990.1 |
| 43766.083333333336 | 989.8 |
| 43766.09722222222 | 989.5 |
| 43766.11111111111 | 989.3 |
| 43766.125 | 989.3 |
| 43766.13888888889 | 989.4 |
| 43766.15277777778 | 989.7 |
| 43766.166666666664 | 989.7 |
| 43766.180555555555 | 989.8 |
| 43766.194444444445 | 989.9 |
| 43766.208333333336 | 989.8 |
| 43766.22222222222 | 990.1 |
| 43766.23611111111 | 990.2 |
| 43766.25 | 990.6 |
| 43766.26388888889 | 990.6 |
| 43766.27777777778 | 990.7 |
| 43766.291666666664 | 990.8 |
| 43766.305555555555 | 991 |
| 43766.319444444445 | 991.1 |
| 43766.333333333336 | 991.3 |
| 43766.34722222222 | 991.3 |
| 43766.36111111111 | 991.4 |
| 43766.375 | 991.5 |
| 43766.38888888889 | 991.7 |
| 43766.40277777778 | 991.7 |
| 43766.416666666664 | 991.6 |
| 43766.430555555555 | 991.3 |
| 43766.444444444445 | 991.3 |
| 43766.458333333336 | 991.2 |
| 43766.47222222222 | 990.8 |
| 43766.48611111111 | 990.8 |
| 43766.5 | 990.6 |
| 43766.51388888889 | 990.4 |
| 43766.52777777778 | 990.2 |
| 43766.541666666664 | 990.2 |
| 43766.555555555555 | 989.9 |
| 43766.569444444445 | 989.9 |
| 43766.583333333336 | 989.9 |
| 43766.59722222222 | 990.1 |
| 43766.61111111111 | 990.1 |
| 43766.625 | 990.1 |
| 43766.63888888889 | 990.2 |
| 43766.65277777778 | 990.3 |
| 43766.666666666664 | 990.3 |
| 43766.680555555555 | 990.5 |
| 43766.694444444445 | 990.5 |
| 43766.708333333336 | 990.6 |
| 43766.72222222222 | 990.9 |
| 43766.73611111111 | 991 |
| 43766.75 | 991 |
| 43766.76388888889 | 991.2 |
| 43766.77777777778 | 991.3 |
| 43766.791666666664 | 991.5 |
| 43766.805555555555 | 991.7 |
| 43766.819444444445 | 991.9 |
| 43766.833333333336 | 992 |
| 43766.84722222222 | 992.1 |
| 43766.86111111111 | 992.1 |
| 43766.875 | 992 |
| 43766.88888888889 | 992.2 |
| 43766.90277777778 | 992.3 |
| 43766.916666666664 | 992.4 |
| 43766.930555555555 | 992.1 |
| 43766.944444444445 | 992.1 |
| 43766.958333333336 | 992.1 |
| 43766.97222222222 | 992 |
| 43766.98611111111 | 992.1 |
| 43767.0 | 991.7 |
| 43767.01388888889 | 991.5 |
| 43767.02777777778 | 991.5 |
| 43767.041666666664 | 991.5 |
| 43767.055555555555 | 991.6 |
| 43767.069444444445 | 991.3 |
| 43767.083333333336 | 991.1 |
| 43767.09722222222 | 991.1 |
| 43767.11111111111 | 991.2 |
| 43767.125 | 991.2 |
| 43767.13888888889 | 991.2 |
| 43767.15277777778 | 991.3 |
| 43767.166666666664 | 991.4 |
| 43767.180555555555 | 991.3 |
| 43767.194444444445 | 991.4 |
| 43767.208333333336 | 991.6 |
| 43767.22222222222 | 991.8 |
| 43767.23611111111 | 991.9 |
| 43767.25 | 992 |
| 43767.26388888889 | 992.1 |
| 43767.27777777778 | 992.3 |
| 43767.291666666664 | 992.4 |
| 43767.305555555555 | 992.7 |
| 43767.319444444445 | 992.9 |
| 43767.333333333336 | 992.9 |
| 43767.34722222222 | 993.3 |
| 43767.36111111111 | 993.3 |
| 43767.375 | 993.5 |
| 43767.38888888889 | 993.5 |
| 43767.40277777778 | 993.5 |
| 43767.416666666664 | 993.6 |
| 43767.430555555555 | 993.3 |
| 43767.444444444445 | 993.3 |
| 43767.458333333336 | 993.1 |
| 43767.47222222222 | 992.9 |
| 43767.48611111111 | 992.9 |
| 43767.5 | 992.8 |
| 43767.51388888889 | 992.5 |
| 43767.52777777778 | 992.4 |
| 43767.541666666664 | 992.2 |
| 43767.555555555555 | 992 |
| 43767.569444444445 | 991.9 |
| 43767.583333333336 | 991.9 |
| 43767.59722222222 | 992 |
| 43767.61111111111 | 992 |
| 43767.625 | 992.2 |
| 43767.63888888889 | 992.3 |
| 43767.65277777778 | 992.3 |
| 43767.666666666664 | 992.4 |
| 43767.680555555555 | 992.5 |
| 43767.694444444445 | 992.5 |
| 43767.708333333336 | 992.6 |
| 43767.72222222222 | 992.5 |
| 43767.73611111111 | 992.9 |
| 43767.75 | 993 |
| 43767.76388888889 | 993.2 |
| 43767.77777777778 | 993.5 |
| 43767.791666666664 | 993.5 |
| 43767.805555555555 | 993.7 |
| 43767.819444444445 | 993.7 |
| 43767.833333333336 | 993.7 |
| 43767.84722222222 | 993.9 |
| 43767.86111111111 | 994 |
| 43767.875 | 994.1 |
| 43767.88888888889 | 994.1 |
| 43767.90277777778 | 994 |
| 43767.916666666664 | 994 |
| 43767.930555555555 | 994.1 |
| 43767.944444444445 | 994.1 |
| 43767.958333333336 | 994.1 |
| 43767.97222222222 | 994 |
| 43767.98611111111 | 994 |
| 43768.0 | 993.9 |
| 43768.01388888889 | 993.8 |
| 43768.02777777778 | 993.6 |
| 43768.041666666664 | 993.6 |
| 43768.055555555555 | 993.6 |
| 43768.069444444445 | 993.5 |
| 43768.083333333336 | 993.6 |
| 43768.09722222222 | 993.4 |
| 43768.11111111111 | 993.2 |
| 43768.125 | 993.3 |
| 43768.13888888889 | 993.2 |
| 43768.15277777778 | 993.1 |
| 43768.166666666664 | 993.3 |
| 43768.180555555555 | 993.3 |
| 43768.194444444445 | 993.3 |
| 43768.208333333336 | 993.4 |
| 43768.22222222222 | 993.6 |
| 43768.23611111111 | 993.6 |
| 43768.25 | 993.7 |
| 43768.26388888889 | 993.8 |
| 43768.27777777778 | 993.8 |
| 43768.291666666664 | 993.8 |
| 43768.305555555555 | 993.9 |
| 43768.319444444445 | 994.3 |
| 43768.333333333336 | 994.3 |
| 43768.34722222222 | 994.9 |
| 43768.36111111111 | 994.7 |
| 43768.375 | 994.7 |
| 43768.38888888889 | 995.2 |
| 43768.40277777778 | 999.8 |
| 43768.416666666664 | 1006.5 |
| 43768.430555555555 | 1008 |
| 43768.444444444445 | 1005.5 |
| 43768.458333333336 | 1005.9 |
| 43768.47222222222 | 1009.3 |
| 43768.48611111111 | 1009.3 |
| 43768.5 | 1010 |
| 43768.51388888889 | 1010.9 |
| 43768.52777777778 | 1011.8 |
| 43768.541666666664 | 1011.4 |
| 43768.555555555555 | 1010.9 |
| 43768.569444444445 | 1011.5 |
| 43768.583333333336 | 1012 |
| 43768.59722222222 | 1012.1 |
| 43768.61111111111 | 1012.1 |
| 43768.625 | 1011.9 |
| 43768.63888888889 | 1011.9 |
| 43768.65277777778 | 1011.8 |
| 43768.666666666664 | 1011.8 |
| 43768.680555555555 | 1011.9 |
| 43768.694444444445 | 1011.9 |
| 43768.708333333336 | 1011.8 |
| 43768.72222222222 | 1011.9 |
| 43768.73611111111 | 1012.1 |
| 43768.75 | 1012.2 |
| 43768.76388888889 | 1012.3 |
| 43768.77777777778 | 1012.4 |
| 43768.791666666664 | 1012.8 |
| 43768.805555555555 | 1013 |
| 43768.819444444445 | 1013.1 |
| 43768.833333333336 | 1013.2 |
| 43768.84722222222 | 1013.2 |
| 43768.86111111111 | 1013.4 |
| 43768.875 | 1013.5 |
| 43768.88888888889 | 1013.6 |
| 43768.90277777778 | 1013.8 |
| 43768.916666666664 | 1013.7 |
| 43768.930555555555 | 1013.7 |
| 43768.944444444445 | 1013.6 |
| 43768.958333333336 | 1013.6 |
| 43768.97222222222 | 1013.5 |
| 43768.98611111111 | 1013.2 |
| 43769.0 | 1013.3 |
| 43769.01388888889 | 1013.2 |
| 43769.02777777778 | 1013.1 |
| 43769.041666666664 | 1013 |
| 43769.055555555555 | 1012.7 |
| 43769.069444444445 | 1012.3 |
| 43769.083333333336 | 1012 |
| 43769.09722222222 | 1011.9 |
| 43769.11111111111 | 1011.8 |
| 43769.125 | 1011.8 |
| 43769.13888888889 | 1011.8 |
| 43769.15277777778 | 1011.9 |
| 43769.166666666664 | 1011.6 |
| 43769.180555555555 | 1011.7 |
| 43769.194444444445 | 1011.6 |
| 43769.208333333336 | 1011.7 |
| 43769.22222222222 | 1011.9 |
| 43769.23611111111 | 1011.9 |
| 43769.25 | 1012.1 |
| 43769.26388888889 | 1012.2 |
| 43769.27777777778 | 1012.6 |
| 43769.291666666664 | 1012.6 |
| 43769.305555555555 | 1012.6 |
| 43769.319444444445 | 1012.9 |
| 43769.333333333336 | 1013.1 |
| 43769.34722222222 | 1013.3 |
| 43769.36111111111 | 1013.6 |
| 43769.375 | 1013.6 |
| 43769.38888888889 | 1013.7 |
| 43769.40277777778 | 1013.9 |
| 43769.416666666664 | 1013.9 |
| 43769.430555555555 | 1014 |
| 43769.444444444445 | 1014.1 |
| 43769.458333333336 | 1013.8 |
| 43769.47222222222 | 1013.7 |
| 43769.48611111111 | 1013.5 |
| 43769.5 | 1013.3 |
| 43769.51388888889 | 1013.1 |
| 43769.52777777778 | 1012.7 |
| 43769.541666666664 | 1012.3 |
| 43769.555555555555 | 1012.2 |
| 43769.569444444445 | 1011.9 |
| 43769.583333333336 | 1011.8 |
| 43769.59722222222 | 1011.6 |
| 43769.61111111111 | 1011.6 |
| 43769.625 | 1011.5 |
| 43769.63888888889 | 1011.5 |
| 43769.65277777778 | 1011.6 |
| 43769.666666666664 | 1011.7 |
| 43769.680555555555 | 1011.6 |
| 43769.694444444445 | 1011.9 |
| 43769.708333333336 | 1012 |
| 43769.72222222222 | 1012 |
| 43769.73611111111 | 1012.3 |
| 43769.75 | 1012.3 |
| 43769.76388888889 | 1012.3 |
| 43769.77777777778 | 1012.4 |
| 43769.791666666664 | 1012.5 |
| 43769.805555555555 | 1012.8 |
| 43769.819444444445 | 1013 |
| 43769.833333333336 | 1013 |
| 43769.84722222222 | 1013 |
| 43769.86111111111 | 1013.2 |
| 43769.875 | 1013.1 |
| 43769.88888888889 | 1013.2 |
| 43769.90277777778 | 1013.1 |
| 43769.916666666664 | 1013.2 |
| 43769.930555555555 | 1013.2 |
| 43769.944444444445 | 1013.1 |
| 43769.958333333336 | 1012.9 |
| 43769.97222222222 | 1012.8 |
| 43769.98611111111 | 1012.6 |
| 43770.0 | 1012.6 |
| 43770.01388888889 | 1012.4 |
| 43770.02777777778 | 1012.6 |
| 43770.041666666664 | 1012.4 |
| 43770.055555555555 | 1012.2 |
| 43770.069444444445 | 1012.2 |
| 43770.083333333336 | 1012.1 |
| 43770.09722222222 | 1011.9 |
| 43770.11111111111 | 1012 |
| 43770.125 | 1011.9 |
| 43770.13888888889 | 1011.7 |
| 43770.15277777778 | 1011.8 |
| 43770.166666666664 | 1011.7 |
| 43770.180555555555 | 1011.9 |
| 43770.194444444445 | 1011.9 |
| 43770.208333333336 | 1011.9 |
| 43770.22222222222 | 1011.9 |
| 43770.23611111111 | 1012.1 |
| 43770.25 | 1012 |
| 43770.26388888889 | 1012.4 |
| 43770.27777777778 | 1012.5 |
| 43770.291666666664 | 1012.7 |
| 43770.305555555555 | 1012.8 |
| 43770.319444444445 | 1013.1 |
| 43770.333333333336 | 1013.4 |
| 43770.34722222222 | 1013.4 |
| 43770.36111111111 | 1013.5 |
| 43770.375 | 1013.6 |
| 43770.38888888889 | 1013.5 |
| 43770.40277777778 | 1013.5 |
| 43770.416666666664 | 1013.4 |
| 43770.430555555555 | 1013.2 |
| 43770.444444444445 | 1013 |
| 43770.458333333336 | 1013 |
| 43770.47222222222 | 1012.6 |
| 43770.48611111111 | 1012.4 |
| 43770.5 | 1012.2 |
| 43770.51388888889 | 1011.9 |
| 43770.52777777778 | 1011.5 |
| 43770.541666666664 | 1011 |
| 43770.555555555555 | 1010.7 |
| 43770.569444444445 | 1010.4 |
| 43770.583333333336 | 1010.3 |
| 43770.59722222222 | 1010.1 |
| 43770.61111111111 | 1010.2 |
| 43770.625 | 1010.1 |
| 43770.63888888889 | 1010.2 |
| 43770.65277777778 | 1010.2 |
| 43770.666666666664 | 1010.1 |
| 43770.680555555555 | 1010.3 |
| 43770.694444444445 | 1010.2 |
| 43770.708333333336 | 1010 |
| 43770.72222222222 | 1010.1 |
| 43770.73611111111 | 1010 |
| 43770.75 | 1009.9 |
| 43770.76388888889 | 1010 |
| 43770.77777777778 | 1010.1 |
| 43770.791666666664 | 1010.3 |
| 43770.805555555555 | 1010.3 |
| 43770.819444444445 | 1010.6 |
| 43770.833333333336 | 1010.7 |
| 43770.84722222222 | 1010.9 |
| 43770.86111111111 | 1011 |
| 43770.875 | 1011.2 |
| 43770.88888888889 | 1011.1 |
| 43770.90277777778 | 1011 |
| 43770.916666666664 | 1011.1 |
| 43770.930555555555 | 1011 |
| 43770.944444444445 | 1011.2 |
| 43770.958333333336 | 1011.1 |
| 43770.97222222222 | 1011 |
| 43770.98611111111 | 1011.1 |
| 43771.0 | 1010.9 |
| 43771.01388888889 | 1010.8 |
| 43771.02777777778 | 1010.8 |
| 43771.041666666664 | 1010.6 |
| 43771.055555555555 | 1010.6 |
| 43771.069444444445 | 1010.5 |
| 43771.083333333336 | 1010.3 |
| 43771.09722222222 | 1010.3 |
| 43771.11111111111 | 1010.3 |
| 43771.125 | 1010.1 |
| 43771.13888888889 | 1010.1 |
| 43771.15277777778 | 1010 |
| 43771.166666666664 | 1010.1 |
| 43771.180555555555 | 1010.1 |
| 43771.194444444445 | 1010.2 |
| 43771.208333333336 | 1010.2 |
| 43771.22222222222 | 1010.3 |
| 43771.23611111111 | 1010.4 |
| 43771.25 | 1010.6 |
| 43771.26388888889 | 1010.9 |
| 43771.27777777778 | 1011.1 |
| 43771.291666666664 | 1011.1 |
| 43771.305555555555 | 1010.6 |
| 43771.319444444445 | 1009.6 |
| 43771.333333333336 | 1009.6 |
| 43771.34722222222 | 1009.3 |
| 43771.36111111111 | 1009.3 |
| 43771.375 | 1009.3 |
| 43771.38888888889 | 1009.1 |
| 43771.40277777778 | 1009 |
| 43771.416666666664 | 1009 |
| 43771.430555555555 | 1008.9 |
| 43771.444444444445 | 1008.7 |
| 43771.458333333336 | 1008.6 |
| 43771.47222222222 | 1008.4 |
| 43771.48611111111 | 1008.3 |
| 43771.5 | 1008.1 |
| 43771.51388888889 | 1008 |
| 43771.52777777778 | 1007.7 |
| 43771.541666666664 | 1007.5 |
| 43771.555555555555 | 1007.3 |
| 43771.569444444445 | 1007.1 |
| 43771.583333333336 | 1007.1 |
| 43771.59722222222 | 1007 |
| 43771.61111111111 | 1007.1 |
| 43771.625 | 1007 |
| 43771.63888888889 | 1007 |
| 43771.65277777778 | 1006.9 |
| 43771.666666666664 | 1007.3 |
| 43771.680555555555 | 1006.5 |
| 43771.694444444445 | 1006.8 |
| 43771.708333333336 | 1006.7 |
| 43771.72222222222 | 1006.6 |
| 43771.73611111111 | 1007 |
| 43771.75 | 1007 |
| 43771.76388888889 | 1007 |
| 43771.77777777778 | 1007.4 |
| 43771.791666666664 | 1008 |
| 43771.805555555555 | 1008.2 |
| 43771.819444444445 | 1008.5 |
| 43771.833333333336 | 1008.6 |
| 43771.84722222222 | 1008.6 |
| 43771.86111111111 | 1008.6 |
| 43771.875 | 1008.7 |
| 43771.88888888889 | 1008.7 |
| 43771.90277777778 | 1008.8 |
| 43771.916666666664 | 1008.7 |
| 43771.930555555555 | 1008.7 |
| 43771.944444444445 | 1008.5 |
| 43771.958333333336 | 1008.6 |
| 43771.97222222222 | 1008.6 |
| 43771.98611111111 | 1008.5 |
| 43772.0 | 1008.7 |
| 43772.01388888889 | 1008.6 |
| 43772.02777777778 | 1008.6 |
| 43772.041666666664 | 1008.6 |
| 43772.055555555555 | 1008.7 |
| 43772.069444444445 | 1008.7 |
| 43772.083333333336 | 1008.5 |
| 43772.09722222222 | 1008.4 |
| 43772.11111111111 | 1008.3 |
| 43772.125 | 1008.1 |
| 43772.13888888889 | 1008.1 |
| 43772.15277777778 | 1008.1 |
| 43772.166666666664 | 1008.3 |
| 43772.180555555555 | 1008.5 |
| 43772.194444444445 | 1008.5 |
| 43772.208333333336 | 1008.7 |
| 43772.22222222222 | 1008.7 |
| 43772.23611111111 | 1008.8 |
| 43772.25 | 1008.9 |
| 43772.26388888889 | 1009.3 |
| 43772.27777777778 | 1009.4 |
| 43772.291666666664 | 1009.6 |
| 43772.305555555555 | 1009.7 |
| 43772.319444444445 | 1010.1 |
| 43772.333333333336 | 1010.1 |
| 43772.34722222222 | 1010.2 |
| 43772.36111111111 | 1010.5 |
| 43772.375 | 1010.7 |
| 43772.38888888889 | 1011 |
| 43772.40277777778 | 1011.1 |
| 43772.416666666664 | 1011.1 |
| 43772.430555555555 | 1011 |
| 43772.444444444445 | 1011.1 |
| 43772.458333333336 | 1010.7 |
| 43772.47222222222 | 1010.7 |
| 43772.48611111111 | 1010.4 |
| 43772.5 | 1010 |
| 43772.51388888889 | 1009.9 |
| 43772.52777777778 | 1009.8 |
| 43772.541666666664 | 1009.4 |
| 43772.555555555555 | 1009.1 |
| 43772.569444444445 | 1008.8 |
| 43772.583333333336 | 1008.6 |
| 43772.59722222222 | 1008.3 |
| 43772.61111111111 | 1008.2 |
| 43772.625 | 1008 |
| 43772.63888888889 | 1008 |
| 43772.65277777778 | 1007.9 |
| 43772.666666666664 | 1008 |
| 43772.680555555555 | 1008 |
| 43772.694444444445 | 1008 |
| 43772.708333333336 | 1008 |
| 43772.72222222222 | 1008 |
| 43772.73611111111 | 1008 |
| 43772.75 | 1008.1 |
| 43772.76388888889 | 1008.2 |
| 43772.77777777778 | 1008.3 |
| 43772.791666666664 | 1008.5 |
| 43772.805555555555 | 1008.7 |
| 43772.819444444445 | 1008.9 |
| 43772.833333333336 | 1009.1 |
| 43772.84722222222 | 1009.1 |
| 43772.86111111111 | 1009.2 |
| 43772.875 | 1009.3 |
| 43772.88888888889 | 1009.3 |
| 43772.90277777778 | 1009.3 |
| 43772.916666666664 | 1009.5 |
| 43772.930555555555 | 1009.6 |
| 43772.944444444445 | 1009.5 |
| 43772.958333333336 | 1009.6 |
| 43772.97222222222 | 1009.8 |
| 43772.98611111111 | 1010 |
| 43773.0 | 1010 |
| 43773.01388888889 | 1009.9 |
| 43773.02777777778 | 1009.9 |
| 43773.041666666664 | 1009.9 |
| 43773.055555555555 | 1009.8 |
| 43773.069444444445 | 1009.7 |
| 43773.083333333336 | 1009.6 |
| 43773.09722222222 | 1009.6 |
| 43773.11111111111 | 1009.5 |
| 43773.125 | 1009.5 |
| 43773.13888888889 | 1009.6 |
| 43773.15277777778 | 1009.6 |
| 43773.166666666664 | 1009.7 |
| 43773.180555555555 | 1009.7 |
| 43773.194444444445 | 1009.7 |
| 43773.208333333336 | 1009.9 |
| 43773.22222222222 | 1010.1 |
| 43773.23611111111 | 1010.2 |
| 43773.25 | 1010.2 |
| 43773.26388888889 | 1010.6 |
| 43773.27777777778 | 1010.7 |
| 43773.291666666664 | 1011 |
| 43773.305555555555 | 1011.1 |
| 43773.319444444445 | 1011.3 |
| 43773.333333333336 | 1011.4 |
| 43773.34722222222 | 1011.7 |
| 43773.36111111111 | 1011.7 |
| 43773.375 | 1011.8 |
| 43773.38888888889 | 1011.7 |
| 43773.40277777778 | 1011.9 |
| 43773.416666666664 | 1012.1 |
| 43773.430555555555 | 1011.8 |
| 43773.444444444445 | 1011.6 |
| 43773.458333333336 | 1011.4 |
| 43773.47222222222 | 1011.2 |
| 43773.48611111111 | 1010.9 |
| 43773.5 | 1010.7 |
| 43773.51388888889 | 1010.5 |
| 43773.52777777778 | 1010.1 |
| 43773.541666666664 | 1009.9 |
| 43773.555555555555 | 1009.6 |
| 43773.569444444445 | 1009.3 |
| 43773.583333333336 | 1009.1 |
| 43773.59722222222 | 1008.8 |
| 43773.61111111111 | 1008.4 |
| 43773.625 | 1008.2 |
| 43773.63888888889 | 1008.2 |
| 43773.65277777778 | 1008.1 |
| 43773.666666666664 | 1008.4 |
| 43773.680555555555 | 1008.3 |
| 43773.694444444445 | 1008.2 |
| 43773.708333333336 | 1008.4 |
| 43773.72222222222 | 1008.3 |
| 43773.73611111111 | 1008.5 |
| 43773.75 | 1008.6 |
| 43773.76388888889 | 1009 |
| 43773.77777777778 | 1009 |
| 43773.791666666664 | 1009.3 |
| 43773.805555555555 | 1009.5 |
| 43773.819444444445 | 1009.7 |
| 43773.833333333336 | 1009.9 |
| 43773.84722222222 | 1010 |
| 43773.86111111111 | 1010.1 |
| 43773.875 | 1010.2 |
| 43773.88888888889 | 1010.2 |
| 43773.90277777778 | 1010.4 |
| 43773.916666666664 | 1010.4 |
| 43773.930555555555 | 1010.5 |
| 43773.944444444445 | 1010.4 |
| 43773.958333333336 | 1010.4 |
| 43773.97222222222 | 1010.1 |
| 43773.98611111111 | 1009.8 |
| 43774.0 | 1009.7 |
| 43774.01388888889 | 1009.4 |
| 43774.02777777778 | 1009.4 |
| 43774.041666666664 | 1009.2 |
| 43774.055555555555 | 1009 |
| 43774.069444444445 | 1008.8 |
| 43774.083333333336 | 1008.6 |
| 43774.09722222222 | 1008.7 |
| 43774.11111111111 | 1008.5 |
| 43774.125 | 1008.6 |
| 43774.13888888889 | 1008.7 |
| 43774.15277777778 | 1008.6 |
| 43774.166666666664 | 1008.5 |
| 43774.180555555555 | 1008.6 |
| 43774.194444444445 | 1008.6 |
| 43774.208333333336 | 1008.7 |
| 43774.22222222222 | 1009.1 |
| 43774.23611111111 | 1009.2 |
| 43774.25 | 1009.5 |
| 43774.26388888889 | 1009.8 |
| 43774.27777777778 | 1010 |
| 43774.291666666664 | 1010.4 |
| 43774.305555555555 | 1010.5 |
| 43774.319444444445 | 1010.7 |
| 43774.333333333336 | 1010.8 |
| 43774.34722222222 | 1011.1 |
| 43774.36111111111 | 1011.3 |
| 43774.375 | 1011.4 |
| 43774.38888888889 | 1011.6 |
| 43774.40277777778 | 1011.7 |
| 43774.416666666664 | 1011.4 |
| 43774.430555555555 | 1011.1 |
| 43774.444444444445 | 1010.9 |
| 43774.458333333336 | 1010.6 |
| 43774.47222222222 | 1010.4 |
| 43774.48611111111 | 1010.2 |
| 43774.5 | 1010 |
| 43774.51388888889 | 1009.6 |
| 43774.52777777778 | 1009.3 |
| 43774.541666666664 | 1008.9 |
| 43774.555555555555 | 1008.5 |
| 43774.569444444445 | 1008.3 |
| 43774.583333333336 | 1007.9 |
| 43774.59722222222 | 1007.7 |
| 43774.61111111111 | 1007.5 |
| 43774.625 | 1007.3 |
| 43774.63888888889 | 1007.1 |
| 43774.65277777778 | 1007.2 |
| 43774.666666666664 | 1007.2 |
| 43774.680555555555 | 1007.1 |
| 43774.694444444445 | 1007.2 |
| 43774.708333333336 | 1007.2 |
| 43774.72222222222 | 1007.2 |
| 43774.73611111111 | 1007.4 |
| 43774.75 | 1007.5 |
| 43774.76388888889 | 1007.6 |
| 43774.77777777778 | 1007.8 |
| 43774.791666666664 | 1007.9 |
| 43774.805555555555 | 1008 |
| 43774.819444444445 | 1008.2 |
| 43774.833333333336 | 1008.4 |
| 43774.84722222222 | 1008.6 |
| 43774.86111111111 | 1008.5 |
| 43774.875 | 1008.7 |
| 43774.88888888889 | 1008.8 |
| 43774.90277777778 | 1008.9 |
| 43774.916666666664 | 1008.8 |
| 43774.930555555555 | 1008.8 |
| 43774.944444444445 | 1008.8 |
| 43774.958333333336 | 1008.8 |
| 43774.97222222222 | 1008.8 |
| 43774.98611111111 | 1008.7 |
| 43775.0 | 1008.6 |
| 43775.01388888889 | 1008.5 |
| 43775.02777777778 | 1008.5 |
| 43775.041666666664 | 1008.4 |
| 43775.055555555555 | 1008.2 |
| 43775.069444444445 | 1008 |
| 43775.083333333336 | 1007.9 |
| 43775.09722222222 | 1007.8 |
| 43775.11111111111 | 1007.6 |
| 43775.125 | 1007.4 |
| 43775.13888888889 | 1007.6 |
| 43775.15277777778 | 1007.3 |
| 43775.166666666664 | 1007.5 |
| 43775.180555555555 | 1007.5 |
| 43775.194444444445 | 1007.5 |
| 43775.208333333336 | 1007.5 |
| 43775.22222222222 | 1007.4 |
| 43775.23611111111 | 1007.3 |
| 43775.25 | 1007.2 |
| 43775.26388888889 | 1007.5 |
| 43775.27777777778 | 1007.6 |
| 43775.291666666664 | 1007.8 |
| 43775.305555555555 | 1008.1 |
| 43775.319444444445 | 1008.4 |
| 43775.333333333336 | 1008.4 |
| 43775.34722222222 | 1008.7 |
| 43775.36111111111 | 1008.8 |
| 43775.375 | 1008.9 |
| 43775.38888888889 | 1008.9 |
| 43775.40277777778 | 1008.9 |
| 43775.416666666664 | 1008.9 |
| 43775.430555555555 | 1008.6 |
| 43775.444444444445 | 1008.5 |
| 43775.458333333336 | 1008.2 |
| 43775.47222222222 | 1007.9 |
| 43775.48611111111 | 1007.7 |
| 43775.5 | 1007.4 |
| 43775.51388888889 | 1006.8 |
| 43775.52777777778 | 1006.2 |
| 43775.541666666664 | 1006 |
| 43775.555555555555 | 1005.8 |
| 43775.569444444445 | 1005.2 |
| 43775.583333333336 | 1005.1 |
| 43775.59722222222 | 1004.6 |
| 43775.61111111111 | 1004.6 |
| 43775.625 | 1004.3 |
| 43775.63888888889 | 1004.2 |
| 43775.65277777778 | 1004.2 |
| 43775.666666666664 | 1004.1 |
| 43775.680555555555 | 1004.1 |
| 43775.694444444445 | 1004.1 |
| 43775.708333333336 | 1004.2 |
| 43775.72222222222 | 1004.4 |
| 43775.73611111111 | 1004.6 |
| 43775.75 | 1004.8 |
| 43775.76388888889 | 1004.8 |
| 43775.77777777778 | 1004.9 |
| 43775.791666666664 | 1004.9 |
| 43775.805555555555 | 1005 |
| 43775.819444444445 | 1005.2 |
| 43775.833333333336 | 1005.5 |
| 43775.84722222222 | 1005.6 |
| 43775.86111111111 | 1005.7 |
| 43775.875 | 1005.8 |
| 43775.88888888889 | 1005.8 |
| 43775.90277777778 | 1005.7 |
| 43775.916666666664 | 1005.7 |
| 43775.930555555555 | 1005.8 |
| 43775.944444444445 | 1006 |
| 43775.958333333336 | 1006 |
| 43775.97222222222 | 1006.2 |
| 43775.98611111111 | 1006.2 |
| 43776.0 | 1006 |
| 43776.01388888889 | 1005.8 |
| 43776.02777777778 | 1005.7 |
| 43776.041666666664 | 1005.7 |
| 43776.055555555555 | 1005.4 |
| 43776.069444444445 | 1005.1 |
| 43776.083333333336 | 1005 |
| 43776.09722222222 | 1005 |
| 43776.11111111111 | 1004.9 |
| 43776.125 | 1004.8 |
| 43776.13888888889 | 1004.9 |
| 43776.15277777778 | 1004.9 |
| 43776.166666666664 | 1004.8 |
| 43776.180555555555 | 1004.8 |
| 43776.194444444445 | 1004.6 |
| 43776.208333333336 | 1004.6 |
| 43776.22222222222 | 1004.5 |
| 43776.23611111111 | 1004.5 |
| 43776.25 | 1004.6 |
| 43776.26388888889 | 1004.7 |
| 43776.27777777778 | 1004.9 |
| 43776.291666666664 | 1005.3 |
| 43776.305555555555 | 1005.8 |
| 43776.319444444445 | 1006 |
| 43776.333333333336 | 1006.2 |
| 43776.34722222222 | 1006.5 |
| 43776.36111111111 | 1006.8 |
| 43776.375 | 1007 |
| 43776.38888888889 | 1007.2 |
| 43776.40277777778 | 1007.4 |
| 43776.416666666664 | 1007.7 |
| 43776.430555555555 | 1007.6 |
| 43776.444444444445 | 1007.5 |
| 43776.458333333336 | 1007.5 |
| 43776.47222222222 | 1007.2 |
| 43776.48611111111 | 1007.2 |
| 43776.5 | 1006.9 |
| 43776.51388888889 | 1006.8 |
| 43776.52777777778 | 1006.4 |
| 43776.541666666664 | 1006.3 |
| 43776.555555555555 | 1005.9 |
| 43776.569444444445 | 1005.8 |
| 43776.583333333336 | 1005.5 |
| 43776.59722222222 | 1005.2 |
| 43776.61111111111 | 1005 |
| 43776.625 | 1004.7 |
| 43776.63888888889 | 1004.6 |
| 43776.65277777778 | 1004.7 |
| 43776.666666666664 | 1004.7 |
| 43776.680555555555 | 1004.8 |
| 43776.694444444445 | 1005 |
| 43776.708333333336 | 1005 |
| 43776.72222222222 | 1005.1 |
| 43776.73611111111 | 1005.2 |
| 43776.75 | 1005.3 |
| 43776.76388888889 | 1005.6 |
| 43776.77777777778 | 1005.7 |
| 43776.791666666664 | 1006.1 |
| 43776.805555555555 | 1006.4 |
| 43776.819444444445 | 1006.4 |
| 43776.833333333336 | 1006.5 |
| 43776.84722222222 | 1006.9 |
| 43776.86111111111 | 1007.3 |
| 43776.875 | 1007.3 |
| 43776.88888888889 | 1007.6 |
| 43776.90277777778 | 1007.8 |
| 43776.916666666664 | 1007.7 |
| 43776.930555555555 | 1007.6 |
| 43776.944444444445 | 1007.3 |
| 43776.958333333336 | 1007.4 |
| 43776.97222222222 | 1007.3 |
| 43776.98611111111 | 1007.2 |
| 43777.0 | 1007.1 |
| 43777.01388888889 | 1007 |
| 43777.02777777778 | 1006.8 |
| 43777.041666666664 | 1006.7 |
| 43777.055555555555 | 1006.4 |
| 43777.069444444445 | 1006.1 |
| 43777.083333333336 | 1005.8 |
| 43777.09722222222 | 1005.7 |
| 43777.11111111111 | 1005.6 |
| 43777.125 | 1005.5 |
| 43777.13888888889 | 1005.4 |
| 43777.15277777778 | 1005.2 |
| 43777.166666666664 | 1005.1 |
| 43777.180555555555 | 1004.8 |
| 43777.194444444445 | 1004.7 |
| 43777.208333333336 | 1005.1 |
| 43777.22222222222 | 1005.3 |
| 43777.23611111111 | 1005.3 |
| 43777.25 | 1005.6 |
| 43777.26388888889 | 1005.6 |
| 43777.27777777778 | 1005.7 |
| 43777.291666666664 | 1006 |
| 43777.305555555555 | 1006.2 |
| 43777.319444444445 | 1006.5 |
| 43777.333333333336 | 1006.7 |
| 43777.34722222222 | 1006.9 |
| 43777.36111111111 | 1007.3 |
| 43777.375 | 1007.5 |
| 43777.38888888889 | 1007.7 |
| 43777.40277777778 | 1007.9 |
| 43777.416666666664 | 1008.1 |
| 43777.430555555555 | 1008.2 |
| 43777.444444444445 | 1008.4 |
| 43777.458333333336 | 1008.4 |
| 43777.47222222222 | 1008.4 |
| 43777.48611111111 | 1008.2 |
| 43777.5 | 1007.9 |
| 43777.51388888889 | 1007.8 |
| 43777.52777777778 | 1007.3 |
| 43777.541666666664 | 1007.2 |
| 43777.555555555555 | 1006.9 |
| 43777.569444444445 | 1006.8 |
| 43777.583333333336 | 1006.6 |
| 43777.59722222222 | 1006.2 |
| 43777.61111111111 | 1006 |
| 43777.625 | 1005.7 |
| 43777.63888888889 | 1005.3 |
| 43777.65277777778 | 1005.1 |
| 43777.666666666664 | 1005.1 |
| 43777.680555555555 | 1005.1 |
| 43777.694444444445 | 1005.4 |
| 43777.708333333336 | 1005.5 |
| 43777.72222222222 | 1005.6 |
| 43777.73611111111 | 1005.6 |
| 43777.75 | 1005.9 |
| 43777.76388888889 | 1006 |
| 43777.77777777778 | 1006.3 |
| 43777.791666666664 | 1006.4 |
| 43777.805555555555 | 1006.5 |
| 43777.819444444445 | 1006.9 |
| 43777.833333333336 | 1007.2 |
| 43777.84722222222 | 1007.4 |
| 43777.86111111111 | 1007.6 |
| 43777.875 | 1007.7 |
| 43777.88888888889 | 1007.9 |
| 43777.90277777778 | 1008 |
| 43777.916666666664 | 1008.1 |
| 43777.930555555555 | 1008.3 |
| 43777.944444444445 | 1008.1 |
| 43777.958333333336 | 1008.2 |
| 43777.97222222222 | 1008 |
| 43777.98611111111 | 1007.9 |
| 43778.0 | 1008 |
| 43778.01388888889 | 1007.9 |
| 43778.02777777778 | 1007.7 |
| 43778.041666666664 | 1007.5 |
| 43778.055555555555 | 1007.2 |
| 43778.069444444445 | 1007.1 |
| 43778.083333333336 | 1006.9 |
| 43778.09722222222 | 1006.7 |
| 43778.11111111111 | 1006.5 |
| 43778.125 | 1006.5 |
| 43778.13888888889 | 1006.2 |
| 43778.15277777778 | 1006.1 |
| 43778.166666666664 | 1005.9 |
| 43778.180555555555 | 1005.6 |
| 43778.194444444445 | 1005.6 |
| 43778.208333333336 | 1005.7 |
| 43778.22222222222 | 1006 |
| 43778.23611111111 | 1005.9 |
| 43778.25 | 1006.1 |
| 43778.26388888889 | 1006.3 |
| 43778.27777777778 | 1006.6 |
| 43778.291666666664 | 1006.7 |
| 43778.305555555555 | 1006.9 |
| 43778.319444444445 | 1007.3 |
| 43778.333333333336 | 1007.6 |
| 43778.34722222222 | 1007.9 |
| 43778.36111111111 | 1008 |
| 43778.375 | 1008.2 |
| 43778.38888888889 | 1008.6 |
| 43778.40277777778 | 1008.6 |
| 43778.416666666664 | 1008.6 |
| 43778.430555555555 | 1008.8 |
| 43778.444444444445 | 1008.7 |
| 43778.458333333336 | 1008.7 |
| 43778.47222222222 | 1008.5 |
| 43778.48611111111 | 1008.2 |
| 43778.5 | 1007.7 |
| 43778.51388888889 | 1007.1 |
| 43778.52777777778 | 1006.9 |
| 43778.541666666664 | 1006.6 |
| 43778.555555555555 | 1006.3 |
| 43778.569444444445 | 1005.9 |
| 43778.583333333336 | 1005.5 |
| 43778.59722222222 | 1004.9 |
| 43778.61111111111 | 1004.6 |
| 43778.625 | 1004.3 |
| 43778.63888888889 | 1004 |
| 43778.65277777778 | 1003.7 |
| 43778.666666666664 | 1003.6 |
| 43778.680555555555 | 1003.6 |
| 43778.694444444445 | 1003.6 |
| 43778.708333333336 | 1003.7 |
| 43778.72222222222 | 1003.8 |
| 43778.73611111111 | 1003.9 |
| 43778.75 | 1004.2 |
| 43778.76388888889 | 1004.3 |
| 43778.77777777778 | 1004.5 |
| 43778.791666666664 | 1004.7 |
| 43778.805555555555 | 1004.8 |
| 43778.819444444445 | 1005 |
| 43778.833333333336 | 1005.1 |
| 43778.84722222222 | 1005.3 |
| 43778.86111111111 | 1005.3 |
| 43778.875 | 1005.6 |
| 43778.88888888889 | 1005.9 |
| 43778.90277777778 | 1006.1 |
| 43778.916666666664 | 1006.2 |
| 43778.930555555555 | 1006.4 |
| 43778.944444444445 | 1006.5 |
| 43778.958333333336 | 1006.7 |
| 43778.97222222222 | 1006.6 |
| 43778.98611111111 | 1006.4 |
| 43779.0 | 1006.4 |
| 43779.01388888889 | 1006.4 |
| 43779.02777777778 | 1006.3 |
| 43779.041666666664 | 1006.2 |
| 43779.055555555555 | 1006 |
| 43779.069444444445 | 1005.8 |
| 43779.083333333336 | 1005.4 |
| 43779.09722222222 | 1005.2 |
| 43779.11111111111 | 1005 |
| 43779.125 | 1004.9 |
| 43779.13888888889 | 1004.7 |
| 43779.15277777778 | 1004.5 |
| 43779.166666666664 | 1004.5 |
| 43779.180555555555 | 1004.5 |
| 43779.194444444445 | 1004.5 |
| 43779.208333333336 | 1004.5 |
| 43779.22222222222 | 1004.6 |
| 43779.23611111111 | 1004.9 |
| 43779.25 | 1005 |
| 43779.26388888889 | 1005.1 |
| 43779.27777777778 | 1005.3 |
| 43779.291666666664 | 1005.4 |
| 43779.305555555555 | 1005.8 |
| 43779.319444444445 | 1005.8 |
| 43779.333333333336 | 1005.9 |
| 43779.34722222222 | 1006.1 |
| 43779.36111111111 | 1006.4 |
| 43779.375 | 1006.7 |
| 43779.38888888889 | 1006.7 |
| 43779.40277777778 | 1006.8 |
| 43779.416666666664 | 1006.9 |
| 43779.430555555555 | 1006.9 |
| 43779.444444444445 | 1006.7 |
| 43779.458333333336 | 1006.7 |
| 43779.47222222222 | 1006.5 |
| 43779.48611111111 | 1006.2 |
| 43779.5 | 1005.8 |
| 43779.51388888889 | 1005.5 |
| 43779.52777777778 | 1005.2 |
| 43779.541666666664 | 1005 |
| 43779.555555555555 | 1004.8 |
| 43779.569444444445 | 1004.2 |
| 43779.583333333336 | 1003.8 |
| 43779.59722222222 | 1003.5 |
| 43779.61111111111 | 1003.2 |
| 43779.625 | 1003 |
| 43779.63888888889 | 1003 |
| 43779.65277777778 | 1002.8 |
| 43779.666666666664 | 1002.8 |
| 43779.680555555555 | 1002.8 |
| 43779.694444444445 | 1002.8 |
| 43779.708333333336 | 1002.9 |
| 43779.72222222222 | 1002.8 |
| 43779.73611111111 | 1002.8 |
| 43779.75 | 1002.8 |
| 43779.76388888889 | 1003 |
| 43779.77777777778 | 1002.9 |
| 43779.791666666664 | 1002.9 |
| 43779.805555555555 | 1002.9 |
| 43779.819444444445 | 1002.8 |
| 43779.833333333336 | 1002.8 |
| 43779.84722222222 | 1003 |
| 43779.86111111111 | 1003.3 |
| 43779.875 | 1003.4 |
| 43779.88888888889 | 1003.9 |
| 43779.90277777778 | 1004 |
| 43779.916666666664 | 1004.2 |
| 43779.930555555555 | 1004.4 |
| 43779.944444444445 | 1004.4 |
| 43779.958333333336 | 1004.4 |
| 43779.97222222222 | 1004.2 |
| 43779.98611111111 | 1004.1 |
| 43780.0 | 1003.9 |
| 43780.01388888889 | 1003.9 |
| 43780.02777777778 | 1003.9 |
| 43780.041666666664 | 1003.8 |
| 43780.055555555555 | 1003.7 |
| 43780.069444444445 | 1003.3 |
| 43780.083333333336 | 1003.1 |
| 43780.09722222222 | 1002.9 |
| 43780.11111111111 | 1002.7 |
| 43780.125 | 1002.6 |
| 43780.13888888889 | 1002.5 |
| 43780.15277777778 | 1002.3 |
| 43780.166666666664 | 1002 |
| 43780.180555555555 | 1001.9 |
| 43780.194444444445 | 1002 |
| 43780.208333333336 | 1002.1 |
| 43780.22222222222 | 1002.1 |
| 43780.23611111111 | 1002.2 |
| 43780.25 | 1002.5 |
| 43780.26388888889 | 1002.6 |
| 43780.27777777778 | 1003 |
| 43780.291666666664 | 1003.2 |
| 43780.305555555555 | 1003.5 |
| 43780.319444444445 | 1003.9 |
| 43780.333333333336 | 1004 |
| 43780.34722222222 | 1004.5 |
| 43780.36111111111 | 1004.6 |
| 43780.375 | 1005 |
| 43780.38888888889 | 1005.2 |
| 43780.40277777778 | 1005.2 |
| 43780.416666666664 | 1005.5 |
| 43780.430555555555 | 1005.7 |
| 43780.444444444445 | 1006 |
| 43780.458333333336 | 1006.2 |
| 43780.47222222222 | 1005.9 |
| 43780.48611111111 | 1005.9 |
| 43780.5 | 1005.8 |
| 43780.51388888889 | 1005.6 |
| 43780.52777777778 | 1005.4 |
| 43780.541666666664 | 1005 |
| 43780.555555555555 | 1004.7 |
| 43780.569444444445 | 1004.6 |
| 43780.583333333336 | 1004.3 |
| 43780.59722222222 | 1004 |
| 43780.61111111111 | 1003.7 |
| 43780.625 | 1003.6 |
| 43780.63888888889 | 1003.8 |
| 43780.65277777778 | 1003.7 |
| 43780.666666666664 | 1003.4 |
| 43780.680555555555 | 1003.1 |
| 43780.694444444445 | 1002.9 |
| 43780.708333333336 | 1002.9 |
| 43780.72222222222 | 1002.9 |
| 43780.73611111111 | 1003 |
| 43780.75 | 1003.1 |
| 43780.76388888889 | 1003.2 |
| 43780.77777777778 | 1003.6 |
| 43780.791666666664 | 1003.7 |
| 43780.805555555555 | 1003.9 |
| 43780.819444444445 | 1004.1 |
| 43780.833333333336 | 1004.1 |
| 43780.84722222222 | 1004.4 |
| 43780.86111111111 | 1004.6 |
| 43780.875 | 1005.1 |
| 43780.88888888889 | 1005.2 |
| 43780.90277777778 | 1005.4 |
| 43780.916666666664 | 1005.6 |
| 43780.930555555555 | 1005.7 |
| 43780.944444444445 | 1005.9 |
| 43780.958333333336 | 1005.9 |
| 43780.97222222222 | 1005.9 |
| 43780.98611111111 | 1005.9 |
| 43781.0 | 1005.7 |
| 43781.01388888889 | 1005.8 |
| 43781.02777777778 | 1005.7 |
| 43781.041666666664 | 1005.9 |
| 43781.055555555555 | 1005.7 |
| 43781.069444444445 | 1005.8 |
| 43781.083333333336 | 1005.7 |
| 43781.09722222222 | 1005.3 |
| 43781.11111111111 | 1005.2 |
| 43781.125 | 1005 |
| 43781.13888888889 | 1004.9 |
| 43781.15277777778 | 1004.6 |
| 43781.166666666664 | 1004.5 |
| 43781.180555555555 | 1004.3 |
| 43781.194444444445 | 1004.2 |
| 43781.208333333336 | 1004.2 |
| 43781.22222222222 | 1004.4 |
| 43781.23611111111 | 1004.3 |
| 43781.25 | 1004.5 |
| 43781.26388888889 | 1004.6 |
| 43781.27777777778 | 1004.8 |
| 43781.291666666664 | 1004.9 |
| 43781.305555555555 | 1005.2 |
| 43781.319444444445 | 1005.3 |
| 43781.333333333336 | 1005.7 |
| 43781.34722222222 | 1005.9 |
| 43781.36111111111 | 1006.4 |
| 43781.375 | 1006.8 |
| 43781.38888888889 | 1007.2 |
| 43781.40277777778 | 1007.4 |
| 43781.416666666664 | 1007.4 |
| 43781.430555555555 | 1007.4 |
| 43781.444444444445 | 1007.3 |
| 43781.458333333336 | 1007.2 |
| 43781.47222222222 | 1007.2 |
| 43781.48611111111 | 1007.1 |
| 43781.5 | 1007 |
| 43781.51388888889 | 1006.7 |
| 43781.52777777778 | 1006.4 |
| 43781.541666666664 | 1006 |
| 43781.555555555555 | 1005.8 |
| 43781.569444444445 | 1005.6 |
| 43781.583333333336 | 1005.3 |
| 43781.59722222222 | 1005.1 |
| 43781.61111111111 | 1004.8 |
| 43781.625 | 1004.6 |
| 43781.63888888889 | 1004.5 |
| 43781.65277777778 | 1004.4 |
| 43781.666666666664 | 1004 |
| 43781.680555555555 | 1003.9 |
| 43781.694444444445 | 1003.8 |
| 43781.708333333336 | 1003.8 |
| 43781.72222222222 | 1004.2 |
| 43781.73611111111 | 1004.3 |
| 43781.75 | 1004.3 |
| 43781.76388888889 | 1004.6 |
| 43781.77777777778 | 1004.6 |
| 43781.791666666664 | 1004.6 |
| 43781.805555555555 | 1004.7 |
| 43781.819444444445 | 1005.1 |
| 43781.833333333336 | 1005.2 |
| 43781.84722222222 | 1005.5 |
| 43781.86111111111 | 1005.6 |
| 43781.875 | 1005.9 |
| 43781.88888888889 | 1005.9 |
| 43781.90277777778 | 1006.2 |
| 43781.916666666664 | 1006.6 |
| 43781.930555555555 | 1006.8 |
| 43781.944444444445 | 1007 |
| 43781.958333333336 | 1007.1 |
| 43781.97222222222 | 1007.1 |
| 43781.98611111111 | 1007.1 |
| 43782.0 | 1007.2 |
| 43782.01388888889 | 1007.2 |
| 43782.02777777778 | 1007.1 |
| 43782.041666666664 | 1006.8 |
| 43782.055555555555 | 1006.6 |
| 43782.069444444445 | 1006.3 |
| 43782.083333333336 | 1006 |
| 43782.09722222222 | 1005.9 |
| 43782.11111111111 | 1005.8 |
| 43782.125 | 1005.7 |
| 43782.13888888889 | 1005.6 |
| 43782.15277777778 | 1005.4 |
| 43782.166666666664 | 1005.5 |
| 43782.180555555555 | 1005.5 |
| 43782.194444444445 | 1005.5 |
| 43782.208333333336 | 1005.6 |
| 43782.22222222222 | 1005.8 |
| 43782.23611111111 | 1005.9 |
| 43782.25 | 1005.9 |
| 43782.26388888889 | 1006.2 |
| 43782.27777777778 | 1006.2 |
| 43782.291666666664 | 1006.5 |
| 43782.305555555555 | 1006.7 |
| 43782.319444444445 | 1006.9 |
| 43782.333333333336 | 1007.2 |
| 43782.34722222222 | 1007.2 |
| 43782.36111111111 | 1007.4 |
| 43782.375 | 1007.5 |
| 43782.38888888889 | 1007.6 |
| 43782.40277777778 | 1007.6 |
| 43782.416666666664 | 1007.6 |
| 43782.430555555555 | 1007.6 |
| 43782.444444444445 | 1007.4 |
| 43782.458333333336 | 1007.4 |
| 43782.47222222222 | 1007.2 |
| 43782.48611111111 | 1007.1 |
| 43782.5 | 1006.8 |
| 43782.51388888889 | 1006.6 |
| 43782.52777777778 | 1006.3 |
| 43782.541666666664 | 1006 |
| 43782.555555555555 | 1005.8 |
| 43782.569444444445 | 1005.5 |
| 43782.583333333336 | 1005 |
| 43782.59722222222 | 1004.9 |
| 43782.61111111111 | 1004.7 |
| 43782.625 | 1004.3 |
| 43782.63888888889 | 1004.3 |
| 43782.65277777778 | 1004 |
| 43782.666666666664 | 1003.8 |
| 43782.680555555555 | 1003.4 |
| 43782.694444444445 | 1003.5 |
| 43782.708333333336 | 1003.6 |
| 43782.72222222222 | 1003.8 |
| 43782.73611111111 | 1003.8 |
| 43782.75 | 1003.7 |
| 43782.76388888889 | 1003.7 |
| 43782.77777777778 | 1003.9 |
| 43782.791666666664 | 1004.2 |
| 43782.805555555555 | 1004.7 |
| 43782.819444444445 | 1004.9 |
| 43782.833333333336 | 1005.3 |
| 43782.84722222222 | 1005.5 |
| 43782.86111111111 | 1005.8 |
| 43782.875 | 1005.9 |
| 43782.88888888889 | 1006.2 |
| 43782.90277777778 | 1006.8 |
| 43782.916666666664 | 1007 |
| 43782.930555555555 | 1007.2 |
| 43782.944444444445 | 1007.3 |
| 43782.958333333336 | 1007.5 |
| 43782.97222222222 | 1007.7 |
| 43782.98611111111 | 1007.7 |
| 43783.0 | 1007.7 |
| 43783.01388888889 | 1007.7 |
| 43783.02777777778 | 1007.6 |
| 43783.041666666664 | 1007.6 |
| 43783.055555555555 | 1007.3 |
| 43783.069444444445 | 1007 |
| 43783.083333333336 | 1006.7 |
| 43783.09722222222 | 1006.3 |
| 43783.11111111111 | 1006 |
| 43783.125 | 1005.8 |
| 43783.13888888889 | 1005.6 |
| 43783.15277777778 | 1005.3 |
| 43783.166666666664 | 1005.3 |
| 43783.180555555555 | 1005.2 |
| 43783.194444444445 | 1005.2 |
| 43783.208333333336 | 1005 |
| 43783.22222222222 | 1005 |
| 43783.23611111111 | 1005.1 |
| 43783.25 | 1005.2 |
| 43783.26388888889 | 1005.4 |
| 43783.27777777778 | 1005.5 |
| 43783.291666666664 | 1005.8 |
| 43783.305555555555 | 1006.2 |
| 43783.319444444445 | 1006.2 |
| 43783.333333333336 | 1006.5 |
| 43783.34722222222 | 1006.9 |
| 43783.36111111111 | 1007 |
| 43783.375 | 1007.2 |
| 43783.38888888889 | 1007.6 |
| 43783.40277777778 | 1007.6 |
| 43783.416666666664 | 1007.8 |
| 43783.430555555555 | 1008 |
| 43783.444444444445 | 1008.2 |
| 43783.458333333336 | 1008.1 |
| 43783.47222222222 | 1008 |
| 43783.48611111111 | 1007.9 |
| 43783.5 | 1007.6 |
| 43783.51388888889 | 1007.3 |
| 43783.52777777778 | 1007.1 |
| 43783.541666666664 | 1006.8 |
| 43783.555555555555 | 1006.6 |
| 43783.569444444445 | 1006.1 |
| 43783.583333333336 | 1005.9 |
| 43783.59722222222 | 1005.7 |
| 43783.61111111111 | 1005.5 |
| 43783.625 | 1005 |
| 43783.63888888889 | 1004.6 |
| 43783.65277777778 | 1004.2 |
| 43783.666666666664 | 1003.8 |
| 43783.680555555555 | 1003.5 |
| 43783.694444444445 | 1003.3 |
| 43783.708333333336 | 1003.4 |
| 43783.72222222222 | 1003.5 |
| 43783.73611111111 | 1003.5 |
| 43783.75 | 1003.6 |
| 43783.76388888889 | 1003.5 |
| 43783.77777777778 | 1003.8 |
| 43783.791666666664 | 1004.2 |
| 43783.805555555555 | 1004.3 |
| 43783.819444444445 | 1004.7 |
| 43783.833333333336 | 1004.9 |
| 43783.84722222222 | 1005.4 |
| 43783.86111111111 | 1005.7 |
| 43783.875 | 1006 |
| 43783.88888888889 | 1006.4 |
| 43783.90277777778 | 1006.5 |
| 43783.916666666664 | 1006.8 |
| 43783.930555555555 | 1006.9 |
| 43783.944444444445 | 1007.2 |
| 43783.958333333336 | 1007.2 |
| 43783.97222222222 | 1007.2 |
| 43783.98611111111 | 1007.2 |
| 43784.0 | 1007.2 |
| 43784.01388888889 | 1007.3 |
| 43784.02777777778 | 1007.2 |
| 43784.041666666664 | 1007.2 |
| 43784.055555555555 | 1007.1 |
| 43784.069444444445 | 1006.9 |
| 43784.083333333336 | 1006.8 |
| 43784.09722222222 | 1006.6 |
| 43784.11111111111 | 1006.3 |
| 43784.125 | 1006 |
| 43784.13888888889 | 1005.7 |
| 43784.15277777778 | 1005.4 |
| 43784.166666666664 | 1005 |
| 43784.180555555555 | 1004.7 |
| 43784.194444444445 | 1004.8 |
| 43784.208333333336 | 1004.6 |
| 43784.22222222222 | 1004.6 |
| 43784.23611111111 | 1004.6 |
| 43784.25 | 1004.6 |
| 43784.26388888889 | 1004.7 |
| 43784.27777777778 | 1004.7 |
| 43784.291666666664 | 1004.9 |
| 43784.305555555555 | 1004.9 |
| 43784.319444444445 | 1005 |
| 43784.333333333336 | 1005.2 |
| 43784.34722222222 | 1005.4 |
| 43784.36111111111 | 1005.6 |
| 43784.375 | 1005.8 |
| 43784.38888888889 | 1006.1 |
| 43784.40277777778 | 1006.5 |
| 43784.416666666664 | 1006.8 |
| 43784.430555555555 | 1007 |
| 43784.444444444445 | 1007.3 |
| 43784.458333333336 | 1007.4 |
| 43784.47222222222 | 1007.5 |
| 43784.48611111111 | 1007.6 |
| 43784.5 | 1007.6 |
| 43784.51388888889 | 1007.7 |
| 43784.52777777778 | 1007.5 |
| 43784.541666666664 | 1007.4 |
| 43784.555555555555 | 1007.2 |
| 43784.569444444445 | 1007 |
| 43784.583333333336 | 1006.9 |
| 43784.59722222222 | 1006.5 |
| 43784.61111111111 | 1006.3 |
| 43784.625 | 1006.1 |
| 43784.63888888889 | 1005.8 |
| 43784.65277777778 | 1005.5 |
| 43784.666666666664 | 1005.2 |
| 43784.680555555555 | 1004.9 |
| 43784.694444444445 | 1004.9 |
| 43784.708333333336 | 1004.8 |
| 43784.72222222222 | 1004.8 |
| 43784.73611111111 | 1004.7 |
| 43784.75 | 1004.6 |
| 43784.76388888889 | 1004.7 |
| 43784.77777777778 | 1004.8 |
| 43784.791666666664 | 1004.6 |
| 43784.805555555555 | 1004.9 |
| 43784.819444444445 | 1004.9 |
| 43784.833333333336 | 1005.1 |
| 43784.84722222222 | 1005.1 |
| 43784.86111111111 | 1005.5 |
| 43784.875 | 1005.7 |
| 43784.88888888889 | 1005.9 |
| 43784.90277777778 | 1006.2 |
| 43784.916666666664 | 1006.4 |
| 43784.930555555555 | 1006.7 |
| 43784.944444444445 | 1007 |
| 43784.958333333336 | 1007.2 |
| 43784.97222222222 | 1007.3 |
| 43784.98611111111 | 1007.6 |
| 43785.0 | 1007.6 |
| 43785.01388888889 | 1007.7 |
| 43785.02777777778 | 1007.4 |
| 43785.041666666664 | 1007.5 |
| 43785.055555555555 | 1007.2 |
| 43785.069444444445 | 1007.2 |
| 43785.083333333336 | 1007.1 |
| 43785.09722222222 | 1006.9 |
| 43785.11111111111 | 1006.6 |
| 43785.125 | 1006.5 |
| 43785.13888888889 | 1006.4 |
| 43785.15277777778 | 1006.1 |
| 43785.166666666664 | 1006.2 |
| 43785.180555555555 | 1006 |
| 43785.194444444445 | 1005.6 |
| 43785.208333333336 | 1005.4 |
| 43785.22222222222 | 1005.2 |
| 43785.23611111111 | 1005 |
| 43785.25 | 1005 |
| 43785.26388888889 | 1004.9 |
| 43785.27777777778 | 1004.9 |
| 43785.291666666664 | 1005.1 |
| 43785.305555555555 | 1005.2 |
| 43785.319444444445 | 1005.3 |
| 43785.333333333336 | 1005.5 |
| 43785.34722222222 | 1005.8 |
| 43785.36111111111 | 1005.9 |
| 43785.375 | 1006.2 |
| 43785.38888888889 | 1006.4 |
| 43785.40277777778 | 1006.8 |
| 43785.416666666664 | 1007 |
| 43785.430555555555 | 1007.3 |
| 43785.444444444445 | 1007.5 |
| 43785.458333333336 | 1007.8 |
| 43785.47222222222 | 1008 |
| 43785.48611111111 | 1008.1 |
| 43785.5 | 1008.1 |
| 43785.51388888889 | 1007.9 |
| 43785.52777777778 | 1007.9 |
| 43785.541666666664 | 1007.8 |
| 43785.555555555555 | 1007.7 |
| 43785.569444444445 | 1007.6 |
| 43785.583333333336 | 1007.4 |
| 43785.59722222222 | 1007.2 |
| 43785.61111111111 | 1007 |
| 43785.625 | 1006.7 |
| 43785.63888888889 | 1006.4 |
| 43785.65277777778 | 1006.1 |
| 43785.666666666664 | 1005.8 |
| 43785.680555555555 | 1005.2 |
| 43785.694444444445 | 1004.8 |
| 43785.708333333336 | 1004.4 |
| 43785.72222222222 | 1004.3 |
| 43785.73611111111 | 1004.1 |
| 43785.75 | 1004.2 |
| 43785.76388888889 | 1004.2 |
| 43785.77777777778 | 1004.4 |
| 43785.791666666664 | 1004.6 |
| 43785.805555555555 | 1005.1 |
| 43785.819444444445 | 1005.3 |
| 43785.833333333336 | 1005.7 |
| 43785.84722222222 | 1005.9 |
| 43785.86111111111 | 1006.2 |
| 43785.875 | 1006.6 |
| 43785.88888888889 | 1007 |
| 43785.90277777778 | 1007.4 |
| 43785.916666666664 | 1007.5 |
| 43785.930555555555 | 1007.7 |
| 43785.944444444445 | 1007.8 |
| 43785.958333333336 | 1008.2 |
| 43785.97222222222 | 1008.2 |
| 43785.98611111111 | 1008.3 |
| 43786.0 | 1008.5 |
| 43786.01388888889 | 1008.4 |
| 43786.02777777778 | 1008.4 |
| 43786.041666666664 | 1008.2 |
| 43786.055555555555 | 1008.1 |
| 43786.069444444445 | 1007.8 |
| 43786.083333333336 | 1007.7 |
| 43786.09722222222 | 1007.5 |
| 43786.11111111111 | 1007.2 |
| 43786.125 | 1007 |
| 43786.13888888889 | 1006.8 |
| 43786.15277777778 | 1006.6 |
| 43786.166666666664 | 1006.4 |
| 43786.180555555555 | 1006.1 |
| 43786.194444444445 | 1006 |
| 43786.208333333336 | 1005.8 |
| 43786.22222222222 | 1005.5 |
| 43786.23611111111 | 1005.2 |
| 43786.25 | 1005.2 |
| 43786.26388888889 | 1005 |
| 43786.27777777778 | 1005 |
| 43786.291666666664 | 1004.9 |
| 43786.305555555555 | 1004.9 |
| 43786.319444444445 | 1005.2 |
| 43786.333333333336 | 1005.5 |
| 43786.34722222222 | 1005.7 |
| 43786.36111111111 | 1006 |
| 43786.375 | 1006.3 |
| 43786.38888888889 | 1006.5 |
| 43786.40277777778 | 1006.6 |
| 43786.416666666664 | 1006.8 |
| 43786.430555555555 | 1007 |
| 43786.444444444445 | 1007.2 |
| 43786.458333333336 | 1007.5 |
| 43786.47222222222 | 1007.7 |
| 43786.48611111111 | 1007.8 |
| 43786.5 | 1007.9 |
| 43786.51388888889 | 1007.9 |
| 43786.52777777778 | 1008 |
| 43786.541666666664 | 1007.9 |
| 43786.555555555555 | 1007.8 |
| 43786.569444444445 | 1007.7 |
| 43786.583333333336 | 1007.4 |
| 43786.59722222222 | 1007.2 |
| 43786.61111111111 | 1007 |
| 43786.625 | 1006.5 |
| 43786.63888888889 | 1006.3 |
| 43786.65277777778 | 1006.3 |
| 43786.666666666664 | 1006.2 |
| 43786.680555555555 | 1005.6 |
| 43786.694444444445 | 1005.5 |
| 43786.708333333336 | 1005.2 |
| 43786.72222222222 | 1005.1 |
| 43786.73611111111 | 1004.8 |
| 43786.75 | 1004.5 |
| 43786.76388888889 | 1004.5 |
| 43786.77777777778 | 1004.5 |
| 43786.791666666664 | 1004.5 |
| 43786.805555555555 | 1004.7 |
| 43786.819444444445 | 1004.9 |
| 43786.833333333336 | 1005 |
| 43786.84722222222 | 1005.2 |
| 43786.86111111111 | 1005.4 |
| 43786.875 | 1005.6 |
| 43786.88888888889 | 1005.8 |
| 43786.90277777778 | 1005.9 |
| 43786.916666666664 | 1006.2 |
| 43786.930555555555 | 1006.3 |
| 43786.944444444445 | 1006.6 |
| 43786.958333333336 | 1006.8 |
| 43786.97222222222 | 1007.1 |
| 43786.98611111111 | 1007.4 |
| 43787.0 | 1007.5 |
| 43787.01388888889 | 1007.8 |
| 43787.02777777778 | 1007.8 |
| 43787.041666666664 | 1008 |
| 43787.055555555555 | 1007.9 |
| 43787.069444444445 | 1007.7 |
| 43787.083333333336 | 1007.4 |
| 43787.09722222222 | 1007.2 |
| 43787.11111111111 | 1006.9 |
| 43787.125 | 1006.8 |
| 43787.13888888889 | 1007 |
| 43787.15277777778 | 1006.7 |
| 43787.166666666664 | 1006.6 |
| 43787.180555555555 | 1006.4 |
| 43787.194444444445 | 1006.1 |
| 43787.208333333336 | 1006.1 |
| 43787.22222222222 | 1005.9 |
| 43787.23611111111 | 1005.6 |
| 43787.25 | 1005.5 |
| 43787.26388888889 | 1005.6 |
| 43787.27777777778 | 1005.7 |
| 43787.291666666664 | 1005.5 |
| 43787.305555555555 | 1005.6 |
| 43787.319444444445 | 1005.7 |
| 43787.333333333336 | 1005.7 |
| 43787.34722222222 | 1005.9 |
| 43787.36111111111 | 1006 |
| 43787.375 | 1006.1 |
| 43787.38888888889 | 1006.2 |
| 43787.40277777778 | 1006.2 |
| 43787.416666666664 | 1006.5 |
| 43787.430555555555 | 1006.9 |
| 43787.444444444445 | 1007.2 |
| 43787.458333333336 | 1007.5 |
| 43787.47222222222 | 1007.7 |
| 43787.48611111111 | 1008.1 |
| 43787.5 | 1008.4 |
| 43787.51388888889 | 1008.2 |
| 43787.52777777778 | 1008.4 |
| 43787.541666666664 | 1008.4 |
| 43787.555555555555 | 1008.5 |
| 43787.569444444445 | 1008.4 |
| 43787.583333333336 | 1008.3 |
| 43787.59722222222 | 1008 |
| 43787.61111111111 | 1007.7 |
| 43787.625 | 1007.4 |
| 43787.63888888889 | 1007.1 |
| 43787.65277777778 | 1006.9 |
| 43787.666666666664 | 1006.6 |
| 43787.680555555555 | 1006.4 |
| 43787.694444444445 | 1005.9 |
| 43787.708333333336 | 1005.6 |
| 43787.72222222222 | 1005.5 |
| 43787.73611111111 | 1005.5 |
| 43787.75 | 1005.6 |
| 43787.76388888889 | 1005.5 |
| 43787.77777777778 | 1005.4 |
| 43787.791666666664 | 1005.6 |
| 43787.805555555555 | 1005.6 |
| 43787.819444444445 | 1005.9 |
| 43787.833333333336 | 1006 |
| 43787.84722222222 | 1006.3 |
| 43787.86111111111 | 1006.4 |
| 43787.875 | 1006.6 |
| 43787.88888888889 | 1007 |
| 43787.90277777778 | 1007.2 |
| 43787.916666666664 | 1007.4 |
| 43787.930555555555 | 1007.8 |
| 43787.944444444445 | 1008 |
| 43787.958333333336 | 1008.2 |
| 43787.97222222222 | 1008.5 |
| 43787.98611111111 | 1008.5 |
| 43788.0 | 1008.5 |
| 43788.01388888889 | 1008.5 |
| 43788.02777777778 | 1008.6 |
| 43788.041666666664 | 1008.7 |
| 43788.055555555555 | 1008.8 |
| 43788.069444444445 | 1008.8 |
| 43788.083333333336 | 1009 |
| 43788.09722222222 | 1008.9 |
| 43788.11111111111 | 1008.7 |
| 43788.125 | 1008.5 |
| 43788.13888888889 | 1008.3 |
| 43788.15277777778 | 1008.2 |
| 43788.166666666664 | 1008.1 |
| 43788.180555555555 | 1007.8 |
| 43788.194444444445 | 1007.7 |
| 43788.208333333336 | 1007.4 |
| 43788.22222222222 | 1007.3 |
| 43788.23611111111 | 1007.2 |
| 43788.25 | 1007 |
| 43788.26388888889 | 1007 |
| 43788.27777777778 | 1006.9 |
| 43788.291666666664 | 1006.8 |
| 43788.305555555555 | 1006.8 |
| 43788.319444444445 | 1006.8 |
| 43788.333333333336 | 1006.9 |
| 43788.34722222222 | 1007.3 |
| 43788.36111111111 | 1007.3 |
| 43788.375 | 1007.6 |
| 43788.38888888889 | 1007.8 |
| 43788.40277777778 | 1008.1 |
| 43788.416666666664 | 1008.5 |
| 43788.430555555555 | 1008.7 |
| 43788.444444444445 | 1008.9 |
| 43788.458333333336 | 1009.1 |
| 43788.47222222222 | 1009.4 |
| 43788.48611111111 | 1009.6 |
| 43788.5 | 1009.6 |
| 43788.51388888889 | 1009.8 |
| 43788.52777777778 | 1009.9 |
| 43788.541666666664 | 1010 |
| 43788.555555555555 | 1010 |
| 43788.569444444445 | 1010.1 |
| 43788.583333333336 | 1010.2 |
| 43788.59722222222 | 1010.3 |
| 43788.61111111111 | 1010.2 |
| 43788.625 | 1010.1 |
| 43788.63888888889 | 1009.8 |
| 43788.65277777778 | 1009.5 |
| 43788.666666666664 | 1009 |
| 43788.680555555555 | 1008.6 |
| 43788.694444444445 | 1008.3 |
| 43788.708333333336 | 1007.9 |
| 43788.72222222222 | 1007.8 |
| 43788.73611111111 | 1007.5 |
| 43788.75 | 1007.1 |
| 43788.76388888889 | 1006.9 |
| 43788.77777777778 | 1006.8 |
| 43788.791666666664 | 1006.7 |
| 43788.805555555555 | 1006.5 |
| 43788.819444444445 | 1006.5 |
| 43788.833333333336 | 1006.7 |
| 43788.84722222222 | 1006.6 |
| 43788.86111111111 | 1006.6 |
| 43788.875 | 1006.7 |
| 43788.88888888889 | 1006.8 |
| 43788.90277777778 | 1007 |
| 43788.916666666664 | 1007.1 |
| 43788.930555555555 | 1007.1 |
| 43788.944444444445 | 1007.2 |
| 43788.958333333336 | 1007.6 |
| 43788.97222222222 | 1007.8 |
| 43788.98611111111 | 1008 |
| 43789.0 | 1008.1 |
| 43789.01388888889 | 1008.2 |
| 43789.02777777778 | 1008.4 |
| 43789.041666666664 | 1008.3 |
| 43789.055555555555 | 1008.6 |
| 43789.069444444445 | 1008.7 |
| 43789.083333333336 | 1008.7 |
| 43789.09722222222 | 1008.7 |
| 43789.11111111111 | 1008.7 |
| 43789.125 | 1008.5 |
| 43789.13888888889 | 1008.5 |
| 43789.15277777778 | 1008.4 |
| 43789.166666666664 | 1008.2 |
| 43789.180555555555 | 1008 |
| 43789.194444444445 | 1007.9 |
| 43789.208333333336 | 1007.8 |
| 43789.22222222222 | 1007.6 |
| 43789.23611111111 | 1007.5 |
| 43789.25 | 1007.3 |
| 43789.26388888889 | 1007.2 |
| 43789.27777777778 | 1007.1 |
| 43789.291666666664 | 1006.9 |
| 43789.305555555555 | 1006.9 |
| 43789.319444444445 | 1006.8 |
| 43789.333333333336 | 1006.7 |
| 43789.34722222222 | 1006.7 |
| 43789.36111111111 | 1006.7 |
| 43789.375 | 1006.8 |
| 43789.38888888889 | 1006.9 |
| 43789.40277777778 | 1006.8 |
| 43789.416666666664 | 1006.7 |
| 43789.430555555555 | 1006.7 |
| 43789.444444444445 | 1007 |
| 43789.458333333336 | 1007.1 |
| 43789.47222222222 | 1007.4 |
| 43789.48611111111 | 1007.7 |
| 43789.5 | 1007.8 |
| 43789.51388888889 | 1007.8 |
| 43789.52777777778 | 1008.3 |
| 43789.541666666664 | 1008.5 |
| 43789.555555555555 | 1008.8 |
| 43789.569444444445 | 1008.8 |
| 43789.583333333336 | 1008.7 |
| 43789.59722222222 | 1008.8 |
| 43789.61111111111 | 1008.6 |
| 43789.625 | 1008.5 |
| 43789.63888888889 | 1008.2 |
| 43789.65277777778 | 1007.9 |
| 43789.666666666664 | 1007.7 |
| 43789.680555555555 | 1007.4 |
| 43789.694444444445 | 1006.9 |
| 43789.708333333336 | 1006.5 |
| 43789.72222222222 | 1006.2 |
| 43789.73611111111 | 1005.9 |
| 43789.75 | 1005.6 |
| 43789.76388888889 | 1005.4 |
| 43789.77777777778 | 1005 |
| 43789.791666666664 | 1004.7 |
| 43789.805555555555 | 1004.5 |
| 43789.819444444445 | 1004.5 |
| 43789.833333333336 | 1004.5 |
| 43789.84722222222 | 1004.4 |
| 43789.86111111111 | 1004.3 |
| 43789.875 | 1004.4 |
| 43789.88888888889 | 1004.3 |
| 43789.90277777778 | 1004.5 |
| 43789.916666666664 | 1004.5 |
| 43789.930555555555 | 1004.6 |
| 43789.944444444445 | 1004.6 |
| 43789.958333333336 | 1004.6 |
| 43789.97222222222 | 1004.9 |
| 43789.98611111111 | 1004.9 |
| 43790.0 | 1005.1 |
| 43790.01388888889 | 1005.3 |
| 43790.02777777778 | 1005.5 |
| 43790.041666666664 | 1005.6 |
| 43790.055555555555 | 1005.8 |
| 43790.069444444445 | 1005.8 |
| 43790.083333333336 | 1006 |
| 43790.09722222222 | 1006.1 |
| 43790.11111111111 | 1006.1 |
| 43790.125 | 1006 |
| 43790.13888888889 | 1006 |
| 43790.15277777778 | 1005.9 |
| 43790.166666666664 | 1005.6 |
| 43790.180555555555 | 1005.6 |
| 43790.194444444445 | 1005.5 |
| 43790.208333333336 | 1005.4 |
| 43790.22222222222 | 1005.2 |
| 43790.23611111111 | 1004.9 |
| 43790.25 | 1004.8 |
| 43790.26388888889 | 1004.7 |
| 43790.27777777778 | 1004.7 |
| 43790.291666666664 | 1004.9 |
| 43790.305555555555 | 1004.7 |
| 43790.319444444445 | 1004.4 |
| 43790.333333333336 | 1004.1 |
| 43790.34722222222 | 1004.1 |
| 43790.36111111111 | 1003.9 |
| 43790.375 | 1003.9 |
| 43790.38888888889 | 1004.2 |
| 43790.40277777778 | 1004.4 |
| 43790.416666666664 | 1004.4 |
| 43790.430555555555 | 1004.6 |
| 43790.444444444445 | 1004.6 |
| 43790.458333333336 | 1004.8 |
| 43790.47222222222 | 1005.2 |
| 43790.48611111111 | 1005.5 |
| 43790.5 | 1005.7 |
| 43790.51388888889 | 1006 |
| 43790.52777777778 | 1006.1 |
| 43790.541666666664 | 1006.4 |
| 43790.555555555555 | 1006.6 |
| 43790.569444444445 | 1007 |
| 43790.583333333336 | 1007 |
| 43790.59722222222 | 1007.1 |
| 43790.61111111111 | 1007 |
| 43790.625 | 1006.7 |
| 43790.63888888889 | 1006.6 |
| 43790.65277777778 | 1006.3 |
| 43790.666666666664 | 1006 |
| 43790.680555555555 | 1005.9 |
| 43790.694444444445 | 1005.6 |
| 43790.708333333336 | 1005.4 |
| 43790.72222222222 | 1005.2 |
| 43790.73611111111 | 1004.8 |
| 43790.75 | 1004.4 |
| 43790.76388888889 | 1004.3 |
| 43790.77777777778 | 1003.9 |
| 43790.791666666664 | 1003.9 |
| 43790.805555555555 | 1003.7 |
| 43790.819444444445 | 1003.5 |
| 43790.833333333336 | 1003.4 |
| 43790.84722222222 | 1003.2 |
| 43790.86111111111 | 1003.3 |
| 43790.875 | 1003.2 |
| 43790.88888888889 | 1003.2 |
| 43790.90277777778 | 1003.2 |
| 43790.916666666664 | 1003.2 |
| 43790.930555555555 | 1003.4 |
| 43790.944444444445 | 1003.6 |
| 43790.958333333336 | 1003.7 |
| 43790.97222222222 | 1004 |
| 43790.98611111111 | 1004.2 |
| 43791.0 | 1004.4 |
| 43791.01388888889 | 1004.5 |
| 43791.02777777778 | 1004.7 |
| 43791.041666666664 | 1004.8 |
| 43791.055555555555 | 1005.2 |
| 43791.069444444445 | 1005.4 |
| 43791.083333333336 | 1005.6 |
| 43791.09722222222 | 1005.7 |
| 43791.11111111111 | 1005.9 |
| 43791.125 | 1006 |
| 43791.13888888889 | 1006 |
| 43791.15277777778 | 1005.9 |
| 43791.166666666664 | 1006 |
| 43791.180555555555 | 1006 |
| 43791.194444444445 | 1005.8 |
| 43791.208333333336 | 1005.7 |
| 43791.22222222222 | 1005.7 |
| 43791.23611111111 | 1005.7 |
| 43791.25 | 1005.5 |
| 43791.26388888889 | 1005.5 |
| 43791.27777777778 | 1005.6 |
| 43791.291666666664 | 1005.4 |
| 43791.305555555555 | 1005.2 |
| 43791.319444444445 | 1005.2 |
| 43791.333333333336 | 1005.1 |
| 43791.34722222222 | 1004.9 |
| 43791.36111111111 | 1004.9 |
| 43791.375 | 1004.9 |
| 43791.38888888889 | 1005 |
| 43791.40277777778 | 1005 |
| 43791.416666666664 | 1005 |
| 43791.430555555555 | 1005 |
| 43791.444444444445 | 1005 |
| 43791.458333333336 | 1005.2 |
| 43791.47222222222 | 1005.4 |
| 43791.48611111111 | 1005.7 |
| 43791.5 | 1005.9 |
| 43791.51388888889 | 1006.3 |
| 43791.52777777778 | 1006.5 |
| 43791.541666666664 | 1006.8 |
| 43791.555555555555 | 1007 |
| 43791.569444444445 | 1007.3 |
| 43791.583333333336 | 1007.5 |
| 43791.59722222222 | 1007.7 |
| 43791.61111111111 | 1007.9 |
| 43791.625 | 1007.9 |
| 43791.63888888889 | 1008 |
| 43791.65277777778 | 1007.9 |
| 43791.666666666664 | 1007.9 |
| 43791.680555555555 | 1007.9 |
| 43791.694444444445 | 1007.7 |
| 43791.708333333336 | 1007.7 |
| 43791.72222222222 | 1007.4 |
| 43791.73611111111 | 1007.3 |
| 43791.75 | 1007.2 |
| 43791.76388888889 | 1007.1 |
| 43791.77777777778 | 1007 |
| 43791.791666666664 | 1006.9 |
| 43791.805555555555 | 1007 |
| 43791.819444444445 | 1006.8 |
| 43791.833333333336 | 1006.6 |
| 43791.84722222222 | 1006.8 |
| 43791.86111111111 | 1006.8 |
| 43791.875 | 1006.9 |
| 43791.88888888889 | 1006.9 |
| 43791.90277777778 | 1007 |
| 43791.916666666664 | 1007 |
| 43791.930555555555 | 1007.2 |
| 43791.944444444445 | 1007.4 |
| 43791.958333333336 | 1007.5 |
| 43791.97222222222 | 1007.7 |
| 43791.98611111111 | 1007.9 |
| 43792.0 | 1008.1 |
| 43792.01388888889 | 1008.2 |
| 43792.02777777778 | 1008.4 |
| 43792.041666666664 | 1008.5 |
| 43792.055555555555 | 1008.8 |
| 43792.069444444445 | 1009 |
| 43792.083333333336 | 1009.1 |
| 43792.09722222222 | 1009.1 |
| 43792.11111111111 | 1009.3 |
| 43792.125 | 1009.4 |
| 43792.13888888889 | 1009.5 |
| 43792.15277777778 | 1009.5 |
| 43792.166666666664 | 1009.5 |
| 43792.180555555555 | 1009.6 |
| 43792.194444444445 | 1009.4 |
| 43792.208333333336 | 1009.4 |
| 43792.22222222222 | 1009.3 |
| 43792.23611111111 | 1009.2 |
| 43792.25 | 1009.2 |
| 43792.26388888889 | 1009.3 |
| 43792.27777777778 | 1009.4 |
| 43792.291666666664 | 1009.4 |
| 43792.305555555555 | 1009.4 |
| 43792.319444444445 | 1009.3 |
| 43792.333333333336 | 1009.3 |
| 43792.34722222222 | 1009.4 |
| 43792.36111111111 | 1009.5 |
| 43792.375 | 1009.3 |
| 43792.38888888889 | 1009.3 |
| 43792.40277777778 | 1009.2 |
| 43792.416666666664 | 1009.1 |
| 43792.430555555555 | 1009.2 |
| 43792.444444444445 | 1009.3 |
| 43792.458333333336 | 1009.5 |
| 43792.47222222222 | 1009.5 |
| 43792.48611111111 | 1009.6 |
| 43792.5 | 1009.8 |
| 43792.51388888889 | 1010 |
| 43792.52777777778 | 1010.2 |
| 43792.541666666664 | 1010.6 |
| 43792.555555555555 | 1011 |
| 43792.569444444445 | 1011 |
| 43792.583333333336 | 1011.3 |
| 43792.59722222222 | 1011.7 |
| 43792.61111111111 | 1011.9 |
| 43792.625 | 1012.1 |
| 43792.63888888889 | 1012.2 |
| 43792.65277777778 | 1012.2 |
| 43792.666666666664 | 1012.2 |
| 43792.680555555555 | 1012 |
| 43792.694444444445 | 1011.5 |
| 43792.708333333336 | 1011.5 |
| 43792.72222222222 | 1011.5 |
| 43792.73611111111 | 1011.4 |
| 43792.75 | 1011.1 |
| 43792.76388888889 | 1011.1 |
| 43792.77777777778 | 1010.8 |
| 43792.791666666664 | 1010.7 |
| 43792.805555555555 | 1010.5 |
| 43792.819444444445 | 1010.4 |
| 43792.833333333336 | 1010.5 |
| 43792.84722222222 | 1010.6 |
| 43792.86111111111 | 1010.4 |
| 43792.875 | 1010.5 |
| 43792.88888888889 | 1010.6 |
| 43792.90277777778 | 1010.6 |
| 43792.916666666664 | 1011 |
| 43792.930555555555 | 1010.8 |
| 43792.944444444445 | 1010.8 |
| 43792.958333333336 | 1011 |
| 43792.97222222222 | 1011.4 |
| 43792.98611111111 | 1011.4 |
| 43793.0 | 1011.7 |
| 43793.01388888889 | 1012.1 |
| 43793.02777777778 | 1012.4 |
| 43793.041666666664 | 1012.6 |
| 43793.055555555555 | 1012.7 |
| 43793.069444444445 | 1012.7 |
| 43793.083333333336 | 1012.7 |
| 43793.09722222222 | 1012.6 |
| 43793.11111111111 | 1012.8 |
| 43793.125 | 1012.8 |
| 43793.13888888889 | 1012.7 |
| 43793.15277777778 | 1012.8 |
| 43793.166666666664 | 1012.9 |
| 43793.180555555555 | 1013 |
| 43793.194444444445 | 1013 |
| 43793.208333333336 | 1013.1 |
| 43793.22222222222 | 1012.9 |
| 43793.23611111111 | 1012.8 |
| 43793.25 | 1012.9 |
| 43793.26388888889 | 1012.6 |
| 43793.27777777778 | 1012.7 |
| 43793.291666666664 | 1012.8 |
| 43793.305555555555 | 1012.8 |
| 43793.319444444445 | 1012.6 |
| 43793.333333333336 | 1012.5 |
| 43793.34722222222 | 1012.5 |
| 43793.36111111111 | 1012.4 |
| 43793.375 | 1012.4 |
| 43793.38888888889 | 1012.4 |
| 43793.40277777778 | 1012.2 |
| 43793.416666666664 | 1012.1 |
| 43793.430555555555 | 1012.3 |
| 43793.444444444445 | 1012.3 |
| 43793.458333333336 | 1012.4 |
| 43793.47222222222 | 1012.6 |
| 43793.48611111111 | 1012.7 |
| 43793.5 | 1012.9 |
| 43793.51388888889 | 1013.1 |
| 43793.52777777778 | 1013.4 |
| 43793.541666666664 | 1013.3 |
| 43793.555555555555 | 1013.3 |
| 43793.569444444445 | 1013.5 |
| 43793.583333333336 | 1013.6 |
| 43793.59722222222 | 1013.7 |
| 43793.61111111111 | 1013.8 |
| 43793.625 | 1014.2 |
| 43793.63888888889 | 1014.2 |
| 43793.65277777778 | 1014.3 |
| 43793.666666666664 | 1014 |
| 43793.680555555555 | 1014 |
| 43793.694444444445 | 1013.9 |
| 43793.708333333336 | 1013.9 |
| 43793.72222222222 | 1013.7 |
| 43793.73611111111 | 1013.4 |
| 43793.75 | 1013.2 |
| 43793.76388888889 | 1013 |
| 43793.77777777778 | 1012.8 |
| 43793.791666666664 | 1012.6 |
| 43793.805555555555 | 1012.5 |
| 43793.819444444445 | 1012.3 |
| 43793.833333333336 | 1012.2 |
| 43793.84722222222 | 1012 |
| 43793.86111111111 | 1012.1 |
| 43793.875 | 1012.2 |
| 43793.88888888889 | 1012.3 |
| 43793.90277777778 | 1012.4 |
| 43793.916666666664 | 1012.4 |
| 43793.930555555555 | 1012.3 |
| 43793.944444444445 | 1012.1 |
| 43793.958333333336 | 1012.3 |
| 43793.97222222222 | 1012.5 |
| 43793.98611111111 | 1012.5 |
| 43794.0 | 1012.4 |
| 43794.01388888889 | 1012.5 |
| 43794.02777777778 | 1012.3 |
| 43794.041666666664 | 1012.3 |
| 43794.055555555555 | 1012.5 |
| 43794.069444444445 | 1012.5 |
| 43794.083333333336 | 1012.6 |
| 43794.09722222222 | 1012.8 |
| 43794.11111111111 | 1012.6 |
| 43794.125 | 1012.4 |
| 43794.13888888889 | 1012.1 |
| 43794.15277777778 | 1011.9 |
| 43794.166666666664 | 1011.7 |
| 43794.180555555555 | 1011.5 |
| 43794.194444444445 | 1011.3 |
| 43794.208333333336 | 1011.2 |
| 43794.22222222222 | 1011 |
| 43794.23611111111 | 1010.6 |
| 43794.25 | 1010.5 |
| 43794.26388888889 | 1010.4 |
| 43794.27777777778 | 1009.9 |
| 43794.291666666664 | 1009.4 |
| 43794.305555555555 | 1009.2 |
| 43794.319444444445 | 1009 |
| 43794.333333333336 | 1008.8 |
| 43794.34722222222 | 1008.7 |
| 43794.36111111111 | 1008.4 |
| 43794.375 | 1008.2 |
| 43794.38888888889 | 1007.9 |
| 43794.40277777778 | 1007.7 |
| 43794.416666666664 | 1007.3 |
| 43794.430555555555 | 1007 |
| 43794.444444444445 | 1006.6 |
| 43794.458333333336 | 1006.3 |
| 43794.47222222222 | 1006.2 |
| 43794.48611111111 | 1005.9 |
| 43794.5 | 1005.5 |
| 43794.51388888889 | 1005.1 |
| 43794.52777777778 | 1004.9 |
| 43794.541666666664 | 1004.9 |
| 43794.555555555555 | 1004.9 |
| 43794.569444444445 | 1005 |
| 43794.583333333336 | 1005.1 |
| 43794.59722222222 | 1004.9 |
| 43794.61111111111 | 1004.9 |
| 43794.625 | 1004.6 |
| 43794.63888888889 | 1004.4 |
| 43794.65277777778 | 1004.2 |
| 43794.666666666664 | 1004.1 |
| 43794.680555555555 | 1003.8 |
| 43794.694444444445 | 1003.7 |
| 43794.708333333336 | 1003.5 |
| 43794.72222222222 | 1003.6 |
| 43794.73611111111 | 1003.7 |
| 43794.75 | 1003.6 |
| 43794.76388888889 | 1003.3 |
| 43794.77777777778 | 1003.4 |
| 43794.791666666664 | 1003.2 |
| 43794.805555555555 | 1003 |
| 43794.819444444445 | 1002.8 |
| 43794.833333333336 | 1002.9 |
| 43794.84722222222 | 1002.7 |
| 43794.86111111111 | 1002.8 |
| 43794.875 | 1002.8 |
| 43794.88888888889 | 1002.9 |
| 43794.90277777778 | 1002.9 |
| 43794.916666666664 | 1003 |
| 43794.930555555555 | 1003.1 |
| 43794.944444444445 | 1003.1 |
| 43794.958333333336 | 1003 |
| 43794.97222222222 | 1003 |
| 43794.98611111111 | 1003 |
| 43795.0 | 1002.8 |
| 43795.01388888889 | 1003.2 |
| 43795.02777777778 | 1003.2 |
| 43795.041666666664 | 1003.2 |
| 43795.055555555555 | 1003.6 |
| 43795.069444444445 | 1003.6 |
| 43795.083333333336 | 1003.5 |
| 43795.09722222222 | 1003.4 |
| 43795.11111111111 | 1003.7 |
| 43795.125 | 1003.3 |
| 43795.13888888889 | 1003.6 |
| 43795.15277777778 | 1003.7 |
| 43795.166666666664 | 1003.4 |
| 43795.180555555555 | 1003.4 |
| 43795.194444444445 | 1003.4 |
| 43795.208333333336 | 1003.4 |
| 43795.22222222222 | 1003.4 |
| 43795.23611111111 | 1003.3 |
| 43795.25 | 1003.1 |
| 43795.26388888889 | 1002.9 |
| 43795.27777777778 | 1002.7 |
| 43795.291666666664 | 1002.7 |
| 43795.305555555555 | 1002.4 |
| 43795.319444444445 | 1002.3 |
| 43795.333333333336 | 1001.9 |
| 43795.34722222222 | 1001.7 |
| 43795.36111111111 | 1001.6 |
| 43795.375 | 1001.2 |
| 43795.38888888889 | 1001 |
| 43795.40277777778 | 1001 |
| 43795.416666666664 | 1000.8 |
| 43795.430555555555 | 1000.4 |
| 43795.444444444445 | 1000.4 |
| 43795.458333333336 | 1000.3 |
| 43795.47222222222 | 1000.3 |
| 43795.48611111111 | 1000.2 |
| 43795.5 | 1000.3 |
| 43795.51388888889 | 1000.3 |
| 43795.52777777778 | 1000.3 |
| 43795.541666666664 | 1000.4 |
| 43795.555555555555 | 1000.4 |
| 43795.569444444445 | 1000.4 |
| 43795.583333333336 | 1000.4 |
| 43795.59722222222 | 1000.7 |
| 43795.61111111111 | 1000.8 |
| 43795.625 | 1001.1 |
| 43795.63888888889 | 1001.3 |
| 43795.65277777778 | 1001.7 |
| 43795.666666666664 | 1002 |
| 43795.680555555555 | 1002.5 |
| 43795.694444444445 | 1002.9 |
| 43795.708333333336 | 1003.3 |
| 43795.72222222222 | 1003.4 |
| 43795.73611111111 | 1003.8 |
| 43795.75 | 1003.9 |
| 43795.76388888889 | 1003.9 |
| 43795.77777777778 | 1004.1 |
| 43795.791666666664 | 1004.1 |
| 43795.805555555555 | 1004.4 |
| 43795.819444444445 | 1004.5 |
| 43795.833333333336 | 1004.8 |
| 43795.84722222222 | 1004.8 |
| 43795.86111111111 | 1005.2 |
| 43795.875 | 1005.5 |
| 43795.88888888889 | 1005.8 |
| 43795.90277777778 | 1006.1 |
| 43795.916666666664 | 1006.6 |
| 43795.930555555555 | 1006.8 |
| 43795.944444444445 | 1006.8 |
| 43795.958333333336 | 1006.7 |
| 43795.97222222222 | 1007.1 |
| 43795.98611111111 | 1007.6 |
| 43796.0 | 1007.7 |
| 43796.01388888889 | 1007.7 |
| 43796.02777777778 | 1007.8 |
| 43796.041666666664 | 1008.1 |
| 43796.055555555555 | 1008.2 |
| 43796.069444444445 | 1008.6 |
| 43796.083333333336 | 1009 |
| 43796.09722222222 | 1009.2 |
| 43796.11111111111 | 1009.4 |
| 43796.125 | 1009.9 |
| 43796.13888888889 | 1010.3 |
| 43796.15277777778 | 1010.7 |
| 43796.166666666664 | 1010.8 |
| 43796.180555555555 | 1011.1 |
| 43796.194444444445 | 1011 |
| 43796.208333333336 | 1011.2 |
| 43796.22222222222 | 1011.2 |
| 43796.23611111111 | 1011.1 |
| 43796.25 | 1011 |
| 43796.26388888889 | 1011 |
| 43796.27777777778 | 1010.9 |
| 43796.291666666664 | 1010.8 |
| 43796.305555555555 | 1010.7 |
| 43796.319444444445 | 1010.5 |
| 43796.333333333336 | 1010.5 |
| 43796.34722222222 | 1010.3 |
| 43796.36111111111 | 1010.2 |
| 43796.375 | 1010.3 |
| 43796.38888888889 | 1010.3 |
| 43796.40277777778 | 1010.3 |
| 43796.416666666664 | 1010.1 |
| 43796.430555555555 | 1010 |
| 43796.444444444445 | 1009.8 |
| 43796.458333333336 | 1009.6 |
| 43796.47222222222 | 1009.4 |
| 43796.48611111111 | 1009.4 |
| 43796.5 | 1009.1 |
| 43796.51388888889 | 1009.1 |
| 43796.52777777778 | 1008.8 |
| 43796.541666666664 | 1008.7 |
| 43796.555555555555 | 1008.7 |
| 43796.569444444445 | 1008.8 |
| 43796.583333333336 | 1008.7 |
| 43796.59722222222 | 1008.8 |
| 43796.61111111111 | 1008.8 |
| 43796.625 | 1008.9 |
| 43796.63888888889 | 1008.9 |
| 43796.65277777778 | 1008.9 |
| 43796.666666666664 | 1009 |
| 43796.680555555555 | 1008.8 |
| 43796.694444444445 | 1009 |
| 43796.708333333336 | 1009.2 |
| 43796.72222222222 | 1009 |
| 43796.73611111111 | 1009.1 |
| 43796.75 | 1008.9 |
| 43796.76388888889 | 1008.8 |
| 43796.77777777778 | 1008.5 |
| 43796.791666666664 | 1008.6 |
| 43796.805555555555 | 1008.7 |
| 43796.819444444445 | 1008.5 |
| 43796.833333333336 | 1008.6 |
| 43796.84722222222 | 1008.7 |
| 43796.86111111111 | 1008.7 |
| 43796.875 | 1008.5 |
| 43796.88888888889 | 1008.6 |
| 43796.90277777778 | 1008.7 |
| 43796.916666666664 | 1008.7 |
| 43796.930555555555 | 1008.6 |
| 43796.944444444445 | 1009 |
| 43796.958333333336 | 1009.1 |
| 43796.97222222222 | 1009.2 |
| 43796.98611111111 | 1009 |
| 43797.0 | 1009 |
| 43797.01388888889 | 1009 |
| 43797.02777777778 | 1009.2 |
| 43797.041666666664 | 1009.3 |
| 43797.055555555555 | 1009.4 |
| 43797.069444444445 | 1009.4 |
| 43797.083333333336 | 1009.5 |
| 43797.09722222222 | 1009.7 |
| 43797.11111111111 | 1009.7 |
| 43797.125 | 1009.9 |
| 43797.13888888889 | 1009.8 |
| 43797.15277777778 | 1009.8 |
| 43797.166666666664 | 1010 |
| 43797.180555555555 | 1010.2 |
| 43797.194444444445 | 1010.3 |
| 43797.208333333336 | 1010.4 |
| 43797.22222222222 | 1010.5 |
| 43797.23611111111 | 1010.6 |
| 43797.25 | 1010.8 |
| 43797.26388888889 | 1010.9 |
| 43797.27777777778 | 1010.8 |
| 43797.291666666664 | 1011 |
| 43797.305555555555 | 1011 |
| 43797.319444444445 | 1011.2 |
| 43797.333333333336 | 1011.2 |
| 43797.34722222222 | 1011.5 |
| 43797.36111111111 | 1011.4 |
| 43797.375 | 1011.5 |
| 43797.38888888889 | 1011.6 |
| 43797.40277777778 | 1011.8 |
| 43797.416666666664 | 1011.7 |
| 43797.430555555555 | 1012 |
| 43797.444444444445 | 1012 |
| 43797.458333333336 | 1012.2 |
| 43797.47222222222 | 1012 |
| 43797.48611111111 | 1012.2 |
| 43797.5 | 1012.3 |
| 43797.51388888889 | 1012.2 |
| 43797.52777777778 | 1012.2 |
| 43797.541666666664 | 1012.4 |
| 43797.555555555555 | 1012.6 |
| 43797.569444444445 | 1012.6 |
| 43797.583333333336 | 1013 |
| 43797.59722222222 | 1013.2 |
| 43797.61111111111 | 1013.3 |
| 43797.625 | 1013.7 |
| 43797.63888888889 | 1014.1 |
| 43797.65277777778 | 1014.3 |
| 43797.666666666664 | 1014.4 |
| 43797.680555555555 | 1014.6 |
| 43797.694444444445 | 1014.8 |
| 43797.708333333336 | 1014.9 |
| 43797.72222222222 | 1015.1 |
| 43797.73611111111 | 1015.4 |
| 43797.75 | 1015.3 |
| 43797.76388888889 | 1015.2 |
| 43797.77777777778 | 1015.3 |
| 43797.791666666664 | 1015.1 |
| 43797.805555555555 | 1014.7 |
| 43797.819444444445 | 1014.6 |
| 43797.833333333336 | 1014.7 |
| 43797.84722222222 | 1014.5 |
| 43797.86111111111 | 1014.2 |
| 43797.875 | 1013.9 |
| 43797.88888888889 | 1013.8 |
| 43797.90277777778 | 1013.5 |
| 43797.916666666664 | 1013.4 |
| 43797.930555555555 | 1013.3 |
| 43797.944444444445 | 1013.3 |
| 43797.958333333336 | 1013.2 |
| 43797.97222222222 | 1013.2 |
| 43797.98611111111 | 1013.4 |
| 43798.0 | 1013.2 |
| 43798.01388888889 | 1013.4 |
| 43798.02777777778 | 1013.4 |
| 43798.041666666664 | 1013.5 |
| 43798.055555555555 | 1013.7 |
| 43798.069444444445 | 1013.8 |
| 43798.083333333336 | 1014 |
| 43798.09722222222 | 1014.3 |
| 43798.11111111111 | 1014.5 |
| 43798.125 | 1014.5 |
| 43798.13888888889 | 1014.5 |
| 43798.15277777778 | 1014.6 |
| 43798.166666666664 | 1015.2 |
| 43798.180555555555 | 1015.5 |
| 43798.194444444445 | 1015.9 |
| 43798.208333333336 | 1016 |
| 43798.22222222222 | 1016.3 |
| 43798.23611111111 | 1016.4 |
| 43798.25 | 1016.5 |
| 43798.26388888889 | 1016.6 |
| 43798.27777777778 | 1016.7 |
| 43798.291666666664 | 1016.6 |
| 43798.305555555555 | 1016.8 |
| 43798.319444444445 | 1016.7 |
| 43798.333333333336 | 1017 |
| 43798.34722222222 | 1017 |
| 43798.36111111111 | 1016.8 |
| 43798.375 | 1016.6 |
| 43798.38888888889 | 1016.4 |
| 43798.40277777778 | 1016.5 |
| 43798.416666666664 | 1016.6 |
| 43798.430555555555 | 1016.6 |
| 43798.444444444445 | 1016.7 |
| 43798.458333333336 | 1016.9 |
| 43798.47222222222 | 1016.8 |
| 43798.48611111111 | 1016.7 |
| 43798.5 | 1016.7 |
| 43798.51388888889 | 1016.8 |
| 43798.52777777778 | 1016.8 |
| 43798.541666666664 | 1016.7 |
| 43798.555555555555 | 1016.7 |
| 43798.569444444445 | 1016.8 |
| 43798.583333333336 | 1016.9 |
| 43798.59722222222 | 1017.1 |
| 43798.61111111111 | 1017.3 |
| 43798.625 | 1017.4 |
| 43798.63888888889 | 1017.5 |
| 43798.65277777778 | 1017.8 |
| 43798.666666666664 | 1018 |
| 43798.680555555555 | 1017.9 |
| 43798.694444444445 | 1018.2 |
| 43798.708333333336 | 1018.4 |
| 43798.72222222222 | 1018.6 |
| 43798.73611111111 | 1018.5 |
| 43798.75 | 1018.6 |
| 43798.76388888889 | 1018.9 |
| 43798.77777777778 | 1018.9 |
| 43798.791666666664 | 1019 |
| 43798.805555555555 | 1019.2 |
| 43798.819444444445 | 1018.7 |
| 43798.833333333336 | 1018.8 |
| 43798.84722222222 | 1018.7 |
| 43798.86111111111 | 1018.5 |
| 43798.875 | 1018.2 |
| 43798.88888888889 | 1017.7 |
| 43798.90277777778 | 1017.3 |
| 43798.916666666664 | 1016.8 |
| 43798.930555555555 | 1016.7 |
| 43798.944444444445 | 1016.6 |
| 43798.958333333336 | 1016.6 |
| 43798.97222222222 | 1016.6 |
| 43798.98611111111 | 1016.7 |
| 43799.0 | 1016.7 |
| 43799.01388888889 | 1016.6 |
| 43799.02777777778 | 1016.4 |
| 43799.041666666664 | 1016.3 |
| 43799.055555555555 | 1016.3 |
| 43799.069444444445 | 1016.2 |
| 43799.083333333336 | 1016.1 |
| 43799.09722222222 | 1016.5 |
| 43799.11111111111 | 1016.6 |
| 43799.125 | 1016.7 |
| 43799.13888888889 | 1016.7 |
| 43799.15277777778 | 1016.3 |
| 43799.166666666664 | 1016.2 |
| 43799.180555555555 | 1016.5 |
| 43799.194444444445 | 1016.9 |
| 43799.208333333336 | 1017 |
| 43799.22222222222 | 1017.1 |
| 43799.23611111111 | 1016.9 |
| 43799.25 | 1017.1 |
| 43799.26388888889 | 1017.3 |
| 43799.27777777778 | 1017.2 |
| 43799.291666666664 | 1017.2 |
| 43799.305555555555 | 1017.2 |
| 43799.319444444445 | 1017.1 |
| 43799.333333333336 | 1017.1 |
| 43799.34722222222 | 1017.1 |
| 43799.36111111111 | 1017.2 |
| 43799.375 | 1017 |
| 43799.38888888889 | 1017.2 |
| 43799.40277777778 | 1017 |
| 43799.416666666664 | 1017.1 |
| 43799.430555555555 | 1017.1 |
| 43799.444444444445 | 1017.1 |
| 43799.458333333336 | 1017.2 |
| 43799.47222222222 | 1017.2 |
| 43799.48611111111 | 1017.1 |
| 43799.5 | 1017.3 |
| 43799.51388888889 | 1017.3 |
| 43799.52777777778 | 1017.4 |
| 43799.541666666664 | 1017.6 |
| 43799.555555555555 | 1017.6 |
| 43799.569444444445 | 1017.9 |
| 43799.583333333336 | 1018.1 |
| 43799.59722222222 | 1018.2 |
| 43799.61111111111 | 1018.4 |
| 43799.625 | 1018.6 |
| 43799.63888888889 | 1018.6 |
| 43799.65277777778 | 1018.9 |
| 43799.666666666664 | 1019.2 |
| 43799.680555555555 | 1019.4 |
| 43799.694444444445 | 1019.5 |
| 43799.708333333336 | 1019.8 |
| 43799.72222222222 | 1019.9 |
| 43799.73611111111 | 1020.2 |
| 43799.75 | 1020.4 |
| 43799.76388888889 | 1020.6 |
| 43799.77777777778 | 1020.8 |
| 43799.791666666664 | 1021 |
| 43799.805555555555 | 1021.3 |
| 43799.819444444445 | 1021.4 |
| 43799.833333333336 | 1021.5 |
| 43799.84722222222 | 1021.6 |
| 43799.86111111111 | 1021.6 |
| 43799.875 | 1021.5 |
| 43799.88888888889 | 1021.5 |
| 43799.90277777778 | 1021.4 |
| 43799.916666666664 | 1021.5 |
| 43799.930555555555 | 1021.4 |
| 43799.944444444445 | 1021.4 |
| 43799.958333333336 | 1021.3 |
| 43799.97222222222 | 1021.4 |
| 43799.98611111111 | 1021.4 |
| 43800.0 | 1021.6 |
| 43800.01388888889 | 1021.5 |
| 43800.09722222222 | 1022.4 |
| 43800.11111111111 | 1022.5 |
| 43800.125 | 1022.7 |
| 43800.13888888889 | 1022.9 |
| 43800.15277777778 | 1022.9 |
| 43800.166666666664 | 1022.9 |
| 43800.180555555555 | 1023 |
| 43800.194444444445 | 1023.1 |
| 43800.208333333336 | 1023.1 |
| 43800.22222222222 | 1023.3 |
| 43800.23611111111 | 1023.3 |
| 43800.25 | 1023.4 |
| 43800.26388888889 | 1023.4 |
| 43800.27777777778 | 1023.6 |
| 43800.291666666664 | 1023.4 |
| 43800.305555555555 | 1023.4 |
| 43800.319444444445 | 1023.2 |
| 43800.333333333336 | 1023.2 |
| 43800.34722222222 | 1023.2 |
| 43800.36111111111 | 1023.3 |
| 43800.375 | 1023.1 |
| 43800.38888888889 | 1023 |
| 43800.40277777778 | 1022.8 |
| 43800.416666666664 | 1022.7 |
| 43800.430555555555 | 1022.5 |
| 43800.444444444445 | 1022.3 |
| 43800.458333333336 | 1022 |
| 43800.47222222222 | 1022.2 |
| 43800.48611111111 | 1022.1 |
| 43800.5 | 1021.9 |
| 43800.51388888889 | 1021.8 |
| 43800.52777777778 | 1021.6 |
| 43800.541666666664 | 1021.5 |
| 43800.555555555555 | 1021.5 |
| 43800.569444444445 | 1021.3 |
| 43800.583333333336 | 1021.2 |
| 43800.59722222222 | 1021.1 |
| 43800.61111111111 | 1020.8 |
| 43800.625 | 1020.6 |
| 43800.63888888889 | 1020.5 |
| 43800.65277777778 | 1020.4 |
| 43800.666666666664 | 1020.3 |
| 43800.680555555555 | 1020.2 |
| 43800.694444444445 | 1020.1 |
| 43800.708333333336 | 1019.9 |
| 43800.72222222222 | 1019.9 |
| 43800.73611111111 | 1019.7 |
| 43800.75 | 1019.5 |
| 43800.76388888889 | 1019.4 |
| 43800.77777777778 | 1019.2 |
| 43800.791666666664 | 1019 |
| 43800.805555555555 | 1018.9 |
| 43800.819444444445 | 1018.5 |
| 43800.833333333336 | 1018.2 |
| 43800.84722222222 | 1017.6 |
| 43800.86111111111 | 1017.2 |
| 43800.875 | 1016.6 |
| 43800.88888888889 | 1016.1 |
| 43800.90277777778 | 1015.6 |
| 43800.916666666664 | 1014.9 |
| 43800.930555555555 | 1014.4 |
| 43800.944444444445 | 1013.8 |
| 43800.958333333336 | 1013.3 |
| 43800.97222222222 | 1012.8 |
| 43800.98611111111 | 1012.1 |
| 43801.0 | 1011.7 |
| 43801.01388888889 | 1011.2 |
| 43801.02777777778 | 1010.8 |
| 43801.041666666664 | 1010.3 |
| 43801.055555555555 | 1010 |
| 43801.069444444445 | 1009.7 |
| 43801.083333333336 | 1009.6 |
| 43801.09722222222 | 1009.4 |
| 43801.11111111111 | 1009 |
| 43801.125 | 1008.9 |
| 43801.13888888889 | 1008.7 |
| 43801.15277777778 | 1008.5 |
| 43801.166666666664 | 1008.8 |
| 43801.180555555555 | 1008.6 |
| 43801.194444444445 | 1008.5 |
| 43801.208333333336 | 1008.7 |
| 43801.22222222222 | 1008.6 |
| 43801.23611111111 | 1008.5 |
| 43801.25 | 1008.1 |
| 43801.26388888889 | 1008.3 |
| 43801.27777777778 | 1008.4 |
| 43801.291666666664 | 1008.1 |
| 43801.305555555555 | 1008 |
| 43801.319444444445 | 1007.7 |
| 43801.333333333336 | 1007.7 |
| 43801.34722222222 | 1007.7 |
| 43801.36111111111 | 1007.4 |
| 43801.375 | 1007.5 |
| 43801.38888888889 | 1007.4 |
| 43801.40277777778 | 1007.4 |
| 43801.416666666664 | 1007.1 |
| 43801.430555555555 | 1006.6 |
| 43801.444444444445 | 1006.2 |
| 43801.458333333336 | 1005.8 |
| 43801.47222222222 | 1005.3 |
| 43801.48611111111 | 1004.9 |
| 43801.5 | 1004.6 |
| 43801.51388888889 | 1004.4 |
| 43801.52777777778 | 1004 |
| 43801.541666666664 | 1003.8 |
| 43801.555555555555 | 1003.9 |
| 43801.569444444445 | 1004.6 |
| 43801.583333333336 | 1005 |
| 43801.59722222222 | 1004.7 |
| 43801.61111111111 | 1003.5 |
| 43801.625 | 1002.3 |
| 43801.63888888889 | 1001.7 |
| 43801.65277777778 | 1001.5 |
| 43801.666666666664 | 1002.6 |
| 43801.680555555555 | 1003.1 |
| 43801.694444444445 | 1003.7 |
| 43801.708333333336 | 1004.2 |
| 43801.72222222222 | 1004.7 |
| 43801.73611111111 | 1005 |
| 43801.75 | 1005.5 |
| 43801.76388888889 | 1006.3 |
| 43801.77777777778 | 1006.8 |
| 43801.791666666664 | 1007.3 |
| 43801.805555555555 | 1007.8 |
| 43801.819444444445 | 1008.2 |
| 43801.833333333336 | 1008.9 |
| 43801.84722222222 | 1009.3 |
| 43801.86111111111 | 1009.9 |
| 43801.875 | 1010.2 |
| 43801.88888888889 | 1010.6 |
| 43801.90277777778 | 1010.8 |
| 43801.916666666664 | 1011.1 |
| 43801.930555555555 | 1011.1 |
| 43801.944444444445 | 1011.6 |
| 43801.958333333336 | 1012.1 |
| 43801.97222222222 | 1012.2 |
| 43801.98611111111 | 1012.3 |
| 43802.0 | 1012.9 |
| 43802.01388888889 | 1012.9 |
| 43802.02777777778 | 1013.1 |
| 43802.041666666664 | 1013.3 |
| 43802.055555555555 | 1013.7 |
| 43802.069444444445 | 1014.2 |
| 43802.083333333336 | 1014.5 |
| 43802.09722222222 | 1014.8 |
| 43802.11111111111 | 1015.2 |
| 43802.125 | 1015.6 |
| 43802.13888888889 | 1016.3 |
| 43802.15277777778 | 1016.8 |
| 43802.166666666664 | 1017 |
| 43802.180555555555 | 1017.2 |
| 43802.194444444445 | 1017.6 |
| 43802.208333333336 | 1017.9 |
| 43802.22222222222 | 1018.1 |
| 43802.23611111111 | 1018.4 |
| 43802.25 | 1018.8 |
| 43802.26388888889 | 1019.2 |
| 43802.27777777778 | 1019.4 |
| 43802.291666666664 | 1019.6 |
| 43802.305555555555 | 1019.6 |
| 43802.319444444445 | 1019.7 |
| 43802.333333333336 | 1019.7 |
| 43802.34722222222 | 1019.4 |
| 43802.36111111111 | 1019.3 |
| 43802.375 | 1019.4 |
| 43802.38888888889 | 1019.4 |
| 43802.40277777778 | 1019.6 |
| 43802.416666666664 | 1019.7 |
| 43802.430555555555 | 1019.1 |
| 43802.444444444445 | 1018.8 |
| 43802.458333333336 | 1018.3 |
| 43802.47222222222 | 1017.7 |
| 43802.48611111111 | 1017.7 |
| 43802.5 | 1017.5 |
| 43802.51388888889 | 1017.4 |
| 43802.52777777778 | 1017.2 |
| 43802.541666666664 | 1017.1 |
| 43802.555555555555 | 1017 |
| 43802.569444444445 | 1016.7 |
| 43802.583333333336 | 1016.3 |
| 43802.59722222222 | 1016.4 |
| 43802.61111111111 | 1016.2 |
| 43802.625 | 1015.9 |
| 43802.63888888889 | 1015.9 |
| 43802.65277777778 | 1015.5 |
| 43802.666666666664 | 1015.5 |
| 43802.680555555555 | 1015.8 |
| 43802.694444444445 | 1015.8 |
| 43802.708333333336 | 1015.7 |
| 43802.72222222222 | 1015.4 |
| 43802.73611111111 | 1015.3 |
| 43802.75 | 1015.2 |
| 43802.76388888889 | 1015.2 |
| 43802.77777777778 | 1015.1 |
| 43802.791666666664 | 1015.1 |
| 43802.805555555555 | 1015.3 |
| 43802.819444444445 | 1015.3 |
| 43802.833333333336 | 1015.2 |
| 43802.84722222222 | 1015.1 |
| 43802.86111111111 | 1015.1 |
| 43802.875 | 1015.2 |
| 43802.88888888889 | 1015.1 |
| 43802.90277777778 | 1015.1 |
| 43802.916666666664 | 1014.9 |
| 43802.930555555555 | 1014.6 |
| 43802.944444444445 | 1014.3 |
| 43802.958333333336 | 1013.7 |
| 43802.97222222222 | 1013.3 |
| 43802.98611111111 | 1013 |
| 43803.0 | 1012.3 |
| 43803.01388888889 | 1011.8 |
| 43803.02777777778 | 1011.4 |
| 43803.041666666664 | 1011.3 |
| 43803.055555555555 | 1010.8 |
| 43803.069444444445 | 1010.4 |
| 43803.083333333336 | 1009.9 |
| 43803.09722222222 | 1009.7 |
| 43803.11111111111 | 1009.5 |
| 43803.125 | 1009.3 |
| 43803.13888888889 | 1009 |
| 43803.15277777778 | 1008.9 |
| 43803.166666666664 | 1008.6 |
| 43803.180555555555 | 1008.7 |
| 43803.194444444445 | 1008.3 |
| 43803.208333333336 | 1008 |
| 43803.22222222222 | 1007.8 |
| 43803.23611111111 | 1007.4 |
| 43803.25 | 1006.9 |
| 43803.26388888889 | 1006.4 |
| 43803.27777777778 | 1005.7 |
| 43803.291666666664 | 1005.6 |
| 43803.305555555555 | 1004.9 |
| 43803.319444444445 | 1004.6 |
| 43803.333333333336 | 1004 |
| 43803.34722222222 | 1003.6 |
| 43803.36111111111 | 1002.9 |
| 43803.375 | 1002.5 |
| 43803.38888888889 | 1001.9 |
| 43803.40277777778 | 1001.9 |
| 43803.416666666664 | 1002.6 |
| 43803.430555555555 | 1002.4 |
| 43803.444444444445 | 1001.4 |
| 43803.458333333336 | 1001 |
| 43803.47222222222 | 1000.7 |
| 43803.48611111111 | 1000.5 |
| 43803.5 | 1000.1 |
| 43803.51388888889 | 999.6 |
| 43803.52777777778 | 999.8 |
| 43803.541666666664 | 999.9 |
| 43803.555555555555 | 999.8 |
| 43803.569444444445 | 1000.3 |
| 43803.583333333336 | 1000.3 |
| 43803.59722222222 | 1000.4 |
| 43803.61111111111 | 1000.2 |
| 43803.625 | 1000.2 |
| 43803.63888888889 | 1000.1 |
| 43803.65277777778 | 1000.4 |
| 43803.666666666664 | 1000.4 |
| 43803.680555555555 | 1000.4 |
| 43803.694444444445 | 1000.4 |
| 43803.708333333336 | 1000.5 |
| 43803.72222222222 | 1000.6 |
| 43803.73611111111 | 1000.8 |
| 43803.75 | 1001 |
| 43803.76388888889 | 1001.2 |
| 43803.77777777778 | 1001.5 |
| 43803.791666666664 | 1001.6 |
| 43803.805555555555 | 1002 |
| 43803.819444444445 | 1002 |
| 43803.833333333336 | 1002.3 |
| 43803.84722222222 | 1002.7 |
| 43803.86111111111 | 1003.1 |
| 43803.875 | 1003.1 |
| 43803.88888888889 | 1003.4 |
| 43803.90277777778 | 1003.6 |
| 43803.916666666664 | 1003.8 |
| 43803.930555555555 | 1003.6 |
| 43803.944444444445 | 1003.5 |
| 43803.958333333336 | 1003.3 |
| 43803.97222222222 | 1003.1 |
| 43803.98611111111 | 1003 |
| 43804.0 | 1003.4 |
| 43804.01388888889 | 1003.4 |
| 43804.02777777778 | 1003.3 |
| 43804.041666666664 | 1003.2 |
| 43804.055555555555 | 1002.8 |
| 43804.069444444445 | 1002.8 |
| 43804.083333333336 | 1003.1 |
| 43804.09722222222 | 1003.2 |
| 43804.11111111111 | 1003.1 |
| 43804.125 | 1003 |
| 43804.13888888889 | 1002.9 |
| 43804.15277777778 | 1002.9 |
| 43804.166666666664 | 1003.1 |
| 43804.180555555555 | 1003.3 |
| 43804.194444444445 | 1003.3 |
| 43804.208333333336 | 1002.8 |
| 43804.22222222222 | 1002.8 |
| 43804.23611111111 | 1002.6 |
| 43804.25 | 1002.4 |
| 43804.26388888889 | 1002.1 |
| 43804.27777777778 | 1002 |
| 43804.291666666664 | 1001.5 |
| 43804.305555555555 | 1001.1 |
| 43804.319444444445 | 1000.8 |
| 43804.333333333336 | 1000.3 |
| 43804.34722222222 | 1000 |
| 43804.36111111111 | 999.1 |
| 43804.375 | 998.4 |
| 43804.38888888889 | 997.8 |
| 43804.40277777778 | 997.9 |
| 43804.416666666664 | 996.7 |
| 43804.430555555555 | 996.2 |
| 43804.444444444445 | 995.4 |
| 43804.458333333336 | 994.7 |
| 43804.47222222222 | 994.3 |
| 43804.48611111111 | 993.6 |
| 43804.5 | 992.5 |
| 43804.51388888889 | 991.3 |
| 43804.52777777778 | 991 |
| 43804.541666666664 | 991.3 |
| 43804.555555555555 | 991.8 |
| 43804.569444444445 | 992.7 |
| 43804.583333333336 | 993.8 |
| 43804.59722222222 | 994.8 |
| 43804.61111111111 | 995 |
| 43804.625 | 994.9 |
| 43804.63888888889 | 995 |
| 43804.65277777778 | 995.2 |
| 43804.666666666664 | 994.9 |
| 43804.680555555555 | 994.9 |
| 43804.694444444445 | 995 |
| 43804.708333333336 | 994.5 |
| 43804.72222222222 | 994.4 |
| 43804.73611111111 | 994.2 |
| 43804.75 | 993.9 |
| 43804.76388888889 | 993.5 |
| 43804.77777777778 | 993.2 |
| 43804.791666666664 | 992.7 |
| 43804.805555555555 | 992.8 |
| 43804.819444444445 | 992.6 |
| 43804.833333333336 | 992.9 |
| 43804.84722222222 | 993.4 |
| 43804.86111111111 | 993.7 |
| 43804.875 | 993.7 |
| 43804.88888888889 | 994.2 |
| 43804.90277777778 | 994.4 |
| 43804.916666666664 | 994.4 |
| 43804.930555555555 | 994.4 |
| 43804.944444444445 | 994.8 |
| 43804.958333333336 | 994.8 |
| 43804.97222222222 | 994.7 |
| 43804.98611111111 | 995 |
| 43805.0 | 994.9 |
| 43805.01388888889 | 995.1 |
| 43805.02777777778 | 995.1 |
| 43805.041666666664 | 995.2 |
| 43805.055555555555 | 995.1 |
| 43805.069444444445 | 995.4 |
| 43805.083333333336 | 995.8 |
| 43805.09722222222 | 996.3 |
| 43805.11111111111 | 996.4 |
| 43805.125 | 997 |
| 43805.13888888889 | 997.4 |
| 43805.15277777778 | 997.8 |
| 43805.166666666664 | 998.1 |
| 43805.180555555555 | 998.5 |
| 43805.194444444445 | 999 |
| 43805.208333333336 | 999.6 |
| 43805.22222222222 | 1000.2 |
| 43805.23611111111 | 1000.8 |
| 43805.25 | 1001.6 |
| 43805.26388888889 | 1001.6 |
| 43805.27777777778 | 1002.2 |
| 43805.291666666664 | 1002.5 |
| 43805.305555555555 | 1003.1 |
| 43805.319444444445 | 1003.5 |
| 43805.333333333336 | 1003.8 |
| 43805.34722222222 | 1004.1 |
| 43805.36111111111 | 1004.3 |
| 43805.375 | 1004.8 |
| 43805.38888888889 | 1005 |
| 43805.40277777778 | 1005 |
| 43805.416666666664 | 1005.2 |
| 43805.430555555555 | 1005.8 |
| 43805.444444444445 | 1006.3 |
| 43805.458333333336 | 1006.9 |
| 43805.47222222222 | 1007.5 |
| 43805.48611111111 | 1007.8 |
| 43805.5 | 1008.4 |
| 43805.51388888889 | 1009.1 |
| 43805.52777777778 | 1009.5 |
| 43805.541666666664 | 1009.7 |
| 43805.555555555555 | 1010.2 |
| 43805.569444444445 | 1010.7 |
| 43805.583333333336 | 1011 |
| 43805.59722222222 | 1011.2 |
| 43805.61111111111 | 1011.7 |
| 43805.625 | 1012 |
| 43805.63888888889 | 1012.4 |
| 43805.65277777778 | 1012.7 |
| 43805.666666666664 | 1013.3 |
| 43805.680555555555 | 1013.6 |
| 43805.694444444445 | 1014 |
| 43805.708333333336 | 1014.4 |
| 43805.72222222222 | 1014.6 |
| 43805.73611111111 | 1014.8 |
| 43805.75 | 1015 |
| 43805.76388888889 | 1015.3 |
| 43805.77777777778 | 1015.6 |
| 43805.791666666664 | 1016 |
| 43805.805555555555 | 1016.1 |
| 43805.819444444445 | 1016.2 |
| 43805.833333333336 | 1016.4 |
| 43805.84722222222 | 1016.6 |
| 43805.86111111111 | 1016.8 |
| 43805.875 | 1016.8 |
| 43805.88888888889 | 1016.9 |
| 43805.90277777778 | 1017.1 |
| 43805.916666666664 | 1017.2 |
| 43805.930555555555 | 1017 |
| 43805.944444444445 | 1016.7 |
| 43805.958333333336 | 1016.4 |
| 43805.97222222222 | 1016 |
| 43805.98611111111 | 1015.5 |
| 43806.0 | 1015 |
| 43806.01388888889 | 1014.5 |
| 43806.02777777778 | 1014 |
| 43806.041666666664 | 1013.4 |
| 43806.055555555555 | 1012.8 |
| 43806.069444444445 | 1012.1 |
| 43806.083333333336 | 1011.8 |
| 43806.09722222222 | 1011 |
| 43806.11111111111 | 1010.5 |
| 43806.125 | 1009.9 |
| 43806.13888888889 | 1009.7 |
| 43806.15277777778 | 1010.2 |
| 43806.166666666664 | 1009.8 |
| 43806.180555555555 | 1009.8 |
| 43806.194444444445 | 1010 |
| 43806.208333333336 | 1010 |
| 43806.22222222222 | 1009.9 |
| 43806.23611111111 | 1009.7 |
| 43806.25 | 1009.3 |
| 43806.26388888889 | 1009.6 |
| 43806.27777777778 | 1009.9 |
| 43806.291666666664 | 1010.4 |
| 43806.305555555555 | 1010.7 |
| 43806.319444444445 | 1011.1 |
| 43806.333333333336 | 1011.4 |
| 43806.34722222222 | 1011.6 |
| 43806.36111111111 | 1012.1 |
| 43806.375 | 1012.5 |
| 43806.38888888889 | 1012.8 |
| 43806.40277777778 | 1013.4 |
| 43806.416666666664 | 1013.7 |
| 43806.430555555555 | 1014.2 |
| 43806.444444444445 | 1014.4 |
| 43806.458333333336 | 1014.8 |
| 43806.47222222222 | 1015.1 |
| 43806.48611111111 | 1015.4 |
| 43806.5 | 1015.7 |
| 43806.51388888889 | 1016.1 |
| 43806.52777777778 | 1016.2 |
| 43806.541666666664 | 1016.4 |
| 43806.555555555555 | 1016.6 |
| 43806.569444444445 | 1016.7 |
| 43806.583333333336 | 1016.9 |
| 43806.59722222222 | 1017.3 |
| 43806.61111111111 | 1017.5 |
| 43806.625 | 1018 |
| 43806.63888888889 | 1018.2 |
| 43806.65277777778 | 1018.4 |
| 43806.666666666664 | 1018.7 |
| 43806.680555555555 | 1019 |
| 43806.694444444445 | 1019.2 |
| 43806.708333333336 | 1019.3 |
| 43806.72222222222 | 1019.6 |
| 43806.73611111111 | 1019.8 |
| 43806.75 | 1020.1 |
| 43806.76388888889 | 1020.3 |
| 43806.77777777778 | 1020.8 |
| 43806.791666666664 | 1021.2 |
| 43806.805555555555 | 1021.4 |
| 43806.819444444445 | 1021.8 |
| 43806.833333333336 | 1022.1 |
| 43806.84722222222 | 1022.5 |
| 43806.86111111111 | 1022.7 |
| 43806.875 | 1023 |
| 43806.88888888889 | 1023.1 |
| 43806.90277777778 | 1025 |
| 43806.916666666664 | 1025.9 |
| 43806.930555555555 | 1026.1 |
| 43806.944444444445 | 1026.2 |
| 43806.958333333336 | 1026.3 |
| 43806.97222222222 | 1026.5 |
| 43806.98611111111 | 1026.5 |
| 43807.0 | 1026.3 |
| 43807.01388888889 | 1026 |
| 43807.02777777778 | 1026.1 |
| 43807.041666666664 | 1026 |
| 43807.055555555555 | 1026.1 |
| 43807.069444444445 | 1025.9 |
| 43807.083333333336 | 1026 |
| 43807.09722222222 | 1025.8 |
| 43807.11111111111 | 1025.9 |
| 43807.125 | 1026 |
| 43807.13888888889 | 1026.1 |
| 43807.15277777778 | 1026.1 |
| 43807.166666666664 | 1026.3 |
| 43807.180555555555 | 1026.4 |
| 43807.194444444445 | 1026.6 |
| 43807.208333333336 | 1026.7 |
| 43807.22222222222 | 1026.9 |
| 43807.23611111111 | 1027.2 |
| 43807.25 | 1027.5 |
| 43807.26388888889 | 1027.9 |
| 43807.27777777778 | 1028.3 |
| 43807.291666666664 | 1028.4 |
| 43807.305555555555 | 1028.7 |
| 43807.319444444445 | 1028.7 |
| 43807.333333333336 | 1028.9 |
| 43807.34722222222 | 1029.2 |
| 43807.36111111111 | 1029.3 |
| 43807.375 | 1029.7 |
| 43807.38888888889 | 1029.9 |
| 43807.40277777778 | 1029.9 |
| 43807.416666666664 | 1030 |
| 43807.430555555555 | 1030.1 |
| 43807.444444444445 | 1030.2 |
| 43807.458333333336 | 1030.3 |
| 43807.47222222222 | 1030.5 |
| 43807.48611111111 | 1030.6 |
| 43807.5 | 1030.9 |
| 43807.51388888889 | 1031.1 |
| 43807.52777777778 | 1031 |
| 43807.541666666664 | 1031 |
| 43807.555555555555 | 1030.8 |
| 43807.569444444445 | 1030.9 |
| 43807.583333333336 | 1030.9 |
| 43807.59722222222 | 1031 |
| 43807.61111111111 | 1031.1 |
| 43807.625 | 1031 |
| 43807.63888888889 | 1031.2 |
| 43807.65277777778 | 1031.3 |
| 43807.666666666664 | 1031.3 |
| 43807.680555555555 | 1031.4 |
| 43807.694444444445 | 1031.4 |
| 43807.708333333336 | 1031.3 |
| 43807.72222222222 | 1031.3 |
| 43807.73611111111 | 1031.2 |
| 43807.75 | 1031.3 |
| 43807.76388888889 | 1031.4 |
| 43807.77777777778 | 1031.3 |
| 43807.791666666664 | 1031.4 |
| 43807.805555555555 | 1031.4 |
| 43807.819444444445 | 1031.6 |
| 43807.833333333336 | 1031.6 |
| 43807.84722222222 | 1031.8 |
| 43807.86111111111 | 1031.8 |
| 43807.875 | 1032.1 |
| 43807.88888888889 | 1032.1 |
| 43807.90277777778 | 1032.3 |
| 43807.916666666664 | 1032.2 |
| 43807.930555555555 | 1032 |
| 43807.944444444445 | 1032 |
| 43807.958333333336 | 1032 |
| 43807.97222222222 | 1032 |
| 43807.98611111111 | 1031.7 |
| 43808.0 | 1031.3 |
| 43808.01388888889 | 1031.1 |
| 43808.02777777778 | 1030.8 |
| 43808.041666666664 | 1030.6 |
| 43808.055555555555 | 1030.3 |
| 43808.069444444445 | 1030 |
| 43808.083333333336 | 1029.7 |
| 43808.09722222222 | 1029.4 |
| 43808.11111111111 | 1029.2 |
| 43808.125 | 1029 |
| 43808.13888888889 | 1029 |
| 43808.15277777778 | 1028.8 |
| 43808.166666666664 | 1028.7 |
| 43808.180555555555 | 1028.5 |
| 43808.194444444445 | 1028.6 |
| 43808.208333333336 | 1028.3 |
| 43808.22222222222 | 1028.1 |
| 43808.23611111111 | 1028 |
| 43808.25 | 1027.8 |
| 43808.26388888889 | 1027.9 |
| 43808.27777777778 | 1027.8 |
| 43808.291666666664 | 1027.6 |
| 43808.305555555555 | 1027.7 |
| 43808.319444444445 | 1027.6 |
| 43808.333333333336 | 1027.7 |
| 43808.34722222222 | 1027.6 |
| 43808.36111111111 | 1027.3 |
| 43808.375 | 1027 |
| 43808.38888888889 | 1026.8 |
| 43808.40277777778 | 1026.6 |
| 43808.416666666664 | 1026.5 |
| 43808.430555555555 | 1026.4 |
| 43808.444444444445 | 1026.3 |
| 43808.458333333336 | 1025.9 |
| 43808.47222222222 | 1025.7 |
| 43808.48611111111 | 1025.4 |
| 43808.5 | 1025.2 |
| 43808.51388888889 | 1025.2 |
| 43808.52777777778 | 1025 |
| 43808.541666666664 | 1024.9 |
| 43808.555555555555 | 1024.8 |
| 43808.569444444445 | 1024.7 |
| 43808.583333333336 | 1024.4 |
| 43808.59722222222 | 1024.1 |
| 43808.61111111111 | 1023.7 |
| 43808.625 | 1023.6 |
| 43808.63888888889 | 1023.4 |
| 43808.65277777778 | 1023 |
| 43808.666666666664 | 1022.8 |
| 43808.680555555555 | 1022.4 |
| 43808.694444444445 | 1022 |
| 43808.708333333336 | 1021.7 |
| 43808.72222222222 | 1021.5 |
| 43808.73611111111 | 1021.1 |
| 43808.75 | 1020.9 |
| 43808.76388888889 | 1020.5 |
| 43808.77777777778 | 1020.3 |
| 43808.791666666664 | 1019.8 |
| 43808.805555555555 | 1019.1 |
| 43808.819444444445 | 1018.9 |
| 43808.833333333336 | 1018.5 |
| 43808.84722222222 | 1018.4 |
| 43808.86111111111 | 1018.1 |
| 43808.875 | 1017.6 |
| 43808.88888888889 | 1017.2 |
| 43808.90277777778 | 1016.9 |
| 43808.916666666664 | 1016.6 |
| 43808.930555555555 | 1016.1 |
| 43808.944444444445 | 1015.8 |
| 43808.958333333336 | 1015.6 |
| 43808.97222222222 | 1015.4 |
| 43808.98611111111 | 1015.1 |
| 43809.0 | 1014.7 |
| 43809.01388888889 | 1014.4 |
| 43809.02777777778 | 1014 |
| 43809.041666666664 | 1013.8 |
| 43809.055555555555 | 1013.4 |
| 43809.069444444445 | 1013.3 |
| 43809.083333333336 | 1013.1 |
| 43809.09722222222 | 1013 |
| 43809.11111111111 | 1012.6 |
| 43809.125 | 1012.3 |
| 43809.13888888889 | 1012.1 |
| 43809.15277777778 | 1011.7 |
| 43809.166666666664 | 1011.6 |
| 43809.180555555555 | 1011.3 |
| 43809.194444444445 | 1010.6 |
| 43809.208333333336 | 1009.9 |
| 43809.22222222222 | 1009.9 |
| 43809.23611111111 | 1009.6 |
| 43809.25 | 1009.3 |
| 43809.26388888889 | 1009.2 |
| 43809.27777777778 | 1009 |
| 43809.291666666664 | 1008.5 |
| 43809.305555555555 | 1008 |
| 43809.319444444445 | 1007.9 |
| 43809.333333333336 | 1007.5 |
| 43809.34722222222 | 1007.3 |
| 43809.36111111111 | 1006.8 |
| 43809.375 | 1006.5 |
| 43809.38888888889 | 1006.4 |
| 43809.40277777778 | 1006.2 |
| 43809.416666666664 | 1006.1 |
| 43809.430555555555 | 1006 |
| 43809.444444444445 | 1006 |
| 43809.458333333336 | 1005.8 |
| 43809.47222222222 | 1005.9 |
| 43809.48611111111 | 1005.5 |
| 43809.5 | 1005.3 |
| 43809.51388888889 | 1005.4 |
| 43809.52777777778 | 1005.4 |
| 43809.541666666664 | 1005.2 |
| 43809.555555555555 | 1004.9 |
| 43809.569444444445 | 1004.8 |
| 43809.583333333336 | 1004.9 |
| 43809.59722222222 | 1004.8 |
| 43809.61111111111 | 1004.8 |
| 43809.625 | 1004.9 |
| 43809.63888888889 | 1005.2 |
| 43809.65277777778 | 1005.2 |
| 43809.666666666664 | 1005.5 |
| 43809.680555555555 | 1005.5 |
| 43809.694444444445 | 1005.6 |
| 43809.708333333336 | 1005.8 |
| 43809.72222222222 | 1005.8 |
| 43809.73611111111 | 1005.7 |
| 43809.75 | 1005.8 |
| 43809.76388888889 | 1005.9 |
| 43809.77777777778 | 1005.9 |
| 43809.791666666664 | 1006 |
| 43809.805555555555 | 1006.2 |
| 43809.819444444445 | 1006.1 |
| 43809.833333333336 | 1006.1 |
| 43809.84722222222 | 1006.2 |
| 43809.86111111111 | 1006.5 |
| 43809.875 | 1006.6 |
| 43809.88888888889 | 1005.9 |
| 43809.90277777778 | 1006.8 |
| 43809.916666666664 | 1007.2 |
| 43809.930555555555 | 1007.8 |
| 43809.944444444445 | 1008.1 |
| 43809.958333333336 | 1008.1 |
| 43809.97222222222 | 1008.2 |
| 43809.98611111111 | 1007.9 |
| 43810.0 | 1007.9 |
| 43810.01388888889 | 1007.7 |
| 43810.02777777778 | 1007.5 |
| 43810.041666666664 | 1007.4 |
| 43810.055555555555 | 1007.3 |
| 43810.069444444445 | 1007.6 |
| 43810.083333333336 | 1007.4 |
| 43810.09722222222 | 1007.4 |
| 43810.11111111111 | 1007.5 |
| 43810.125 | 1007.3 |
| 43810.13888888889 | 1007.3 |
| 43810.15277777778 | 1007.3 |
| 43810.166666666664 | 1007.5 |
| 43810.180555555555 | 1007.7 |
| 43810.194444444445 | 1007.8 |
| 43810.208333333336 | 1008.3 |
| 43810.22222222222 | 1009.2 |
| 43810.23611111111 | 1009.9 |
| 43810.25 | 1009.9 |
| 43810.26388888889 | 1010 |
| 43810.27777777778 | 1010.4 |
| 43810.291666666664 | 1011.2 |
| 43810.305555555555 | 1011.5 |
| 43810.319444444445 | 1011.8 |
| 43810.333333333336 | 1012.4 |
| 43810.34722222222 | 1012.7 |
| 43810.36111111111 | 1012.8 |
| 43810.375 | 1012.8 |
| 43810.38888888889 | 1013.5 |
| 43810.40277777778 | 1014.1 |
| 43810.416666666664 | 1014.6 |
| 43810.430555555555 | 1014.9 |
| 43810.444444444445 | 1015.4 |
| 43810.458333333336 | 1014.9 |
| 43810.47222222222 | 1016 |
| 43810.48611111111 | 1016.9 |
| 43810.5 | 1017.3 |
| 43810.51388888889 | 1017.4 |
| 43810.52777777778 | 1017.3 |
| 43810.541666666664 | 1017.3 |
| 43810.555555555555 | 1017.2 |
| 43810.569444444445 | 1017.5 |
| 43810.583333333336 | 1017.7 |
| 43810.59722222222 | 1018 |
| 43810.61111111111 | 1018.4 |
| 43810.625 | 1018.9 |
| 43810.63888888889 | 1019.1 |
| 43810.65277777778 | 1019.4 |
| 43810.666666666664 | 1019.7 |
| 43810.680555555555 | 1019.9 |
| 43810.694444444445 | 1020.4 |
| 43810.708333333336 | 1020.7 |
| 43810.72222222222 | 1020.6 |
| 43810.73611111111 | 1020.6 |
| 43810.75 | 1020.9 |
| 43810.76388888889 | 1020.7 |
| 43810.77777777778 | 1021.2 |
| 43810.791666666664 | 1021.4 |
| 43810.805555555555 | 1021.5 |
| 43810.819444444445 | 1022.4 |
| 43810.833333333336 | 1022.7 |
| 43810.84722222222 | 1023.1 |
| 43810.86111111111 | 1023.5 |
| 43810.875 | 1023.7 |
| 43810.88888888889 | 1024 |
| 43810.90277777778 | 1024.4 |
| 43810.916666666664 | 1024.8 |
| 43810.930555555555 | 1025.2 |
| 43810.944444444445 | 1025.2 |
| 43810.958333333336 | 1025.1 |
| 43810.97222222222 | 1025.1 |
| 43810.98611111111 | 1024.9 |
| 43811.0 | 1025 |
| 43811.01388888889 | 1024.5 |
| 43811.02777777778 | 1024 |
| 43811.041666666664 | 1023.7 |
| 43811.055555555555 | 1023.6 |
| 43811.069444444445 | 1023.4 |
| 43811.083333333336 | 1023.3 |
| 43811.09722222222 | 1023.1 |
| 43811.11111111111 | 1023 |
| 43811.125 | 1023 |
| 43811.13888888889 | 1023 |
| 43811.15277777778 | 1023 |
| 43811.166666666664 | 1023 |
| 43811.180555555555 | 1023.4 |
| 43811.194444444445 | 1023.4 |
| 43811.208333333336 | 1023.6 |
| 43811.22222222222 | 1023.9 |
| 43811.23611111111 | 1024.8 |
| 43811.25 | 1024.7 |
| 43811.26388888889 | 1024.9 |
| 43811.27777777778 | 1025.1 |
| 43811.291666666664 | 1025.6 |
| 43811.305555555555 | 1025.9 |
| 43811.319444444445 | 1026.2 |
| 43811.333333333336 | 1026.5 |
| 43811.34722222222 | 1026.8 |
| 43811.36111111111 | 1027 |
| 43811.375 | 1027.2 |
| 43811.38888888889 | 1027.4 |
| 43811.40277777778 | 1027.6 |
| 43811.416666666664 | 1027.8 |
| 43811.430555555555 | 1027.6 |
| 43811.444444444445 | 1028.1 |
| 43811.458333333336 | 1028.7 |
| 43811.47222222222 | 1029.1 |
| 43811.48611111111 | 1029.5 |
| 43811.5 | 1029.9 |
| 43811.51388888889 | 1030.3 |
| 43811.52777777778 | 1030.6 |
| 43811.541666666664 | 1031.1 |
| 43811.555555555555 | 1031.8 |
| 43811.569444444445 | 1032.2 |
| 43811.583333333336 | 1032.1 |
| 43811.59722222222 | 1031.9 |
| 43811.61111111111 | 1032.3 |
| 43811.625 | 1032.8 |
| 43811.63888888889 | 1033.3 |
| 43811.65277777778 | 1033.7 |
| 43811.666666666664 | 1034.3 |
| 43811.680555555555 | 1034.7 |
| 43811.694444444445 | 1034.9 |
| 43811.708333333336 | 1035.2 |
| 43811.72222222222 | 1035.7 |
| 43811.73611111111 | 1035.9 |
| 43811.75 | 1036.3 |
| 43811.76388888889 | 1036.5 |
| 43811.77777777778 | 1036.8 |
| 43811.791666666664 | 1037.3 |
| 43811.805555555555 | 1037.6 |
| 43811.819444444445 | 1037.9 |
| 43811.833333333336 | 1038.2 |
| 43811.84722222222 | 1038.5 |
| 43811.86111111111 | 1038.8 |
| 43811.875 | 1038.8 |
| 43811.88888888889 | 1038.9 |
| 43811.90277777778 | 1039.1 |
| 43811.916666666664 | 1039.2 |
| 43811.930555555555 | 1039 |
| 43811.944444444445 | 1039.3 |
| 43811.958333333336 | 1039.6 |
| 43811.97222222222 | 1039.6 |
| 43811.98611111111 | 1039.8 |
| 43812.0 | 1039.8 |
| 43812.01388888889 | 1039.7 |
| 43812.02777777778 | 1039.2 |
| 43812.041666666664 | 1038.8 |
| 43812.055555555555 | 1038.6 |
| 43812.069444444445 | 1038.5 |
| 43812.083333333336 | 1038.5 |
| 43812.09722222222 | 1038.3 |
| 43812.11111111111 | 1038.3 |
| 43812.125 | 1038.1 |
| 43812.13888888889 | 1037.8 |
| 43812.15277777778 | 1037.2 |
| 43812.166666666664 | 1036.1 |
| 43812.180555555555 | 1035.7 |
| 43812.194444444445 | 1036 |
| 43812.208333333336 | 1034.9 |
| 43812.22222222222 | 1035.8 |
| 43812.23611111111 | 1036.2 |
| 43812.25 | 1036.3 |
| 43812.26388888889 | 1036.4 |
| 43812.27777777778 | 1036.5 |
| 43812.291666666664 | 1036.4 |
| 43812.305555555555 | 1036.2 |
| 43812.319444444445 | 1036.1 |
| 43812.333333333336 | 1036.2 |
| 43812.34722222222 | 1036.2 |
| 43812.36111111111 | 1036.2 |
| 43812.375 | 1036 |
| 43812.38888888889 | 1035.8 |
| 43812.40277777778 | 1035.5 |
| 43812.416666666664 | 1035.5 |
| 43812.430555555555 | 1035.4 |
| 43812.444444444445 | 1035.4 |
| 43812.458333333336 | 1035.2 |
| 43812.47222222222 | 1035 |
| 43812.48611111111 | 1034.9 |
| 43812.5 | 1034.8 |
| 43812.51388888889 | 1034.4 |
| 43812.52777777778 | 1034 |
| 43812.541666666664 | 1033.4 |
| 43812.555555555555 | 1033 |
| 43812.569444444445 | 1032.6 |
| 43812.583333333336 | 1032.2 |
| 43812.59722222222 | 1031.9 |
| 43812.61111111111 | 1031.3 |
| 43812.625 | 1031.2 |
| 43812.63888888889 | 1031 |
| 43812.65277777778 | 1030.6 |
| 43812.666666666664 | 1030.3 |
| 43812.680555555555 | 1030 |
| 43812.694444444445 | 1030 |
| 43812.708333333336 | 1029.7 |
| 43812.72222222222 | 1029.5 |
| 43812.73611111111 | 1029.2 |
| 43812.75 | 1029 |
| 43812.76388888889 | 1028.6 |
| 43812.77777777778 | 1028.4 |
| 43812.791666666664 | 1028.2 |
| 43812.805555555555 | 1028.2 |
| 43812.819444444445 | 1027.7 |
| 43812.833333333336 | 1027.8 |
| 43812.84722222222 | 1027.6 |
| 43812.86111111111 | 1027.3 |
| 43812.875 | 1027 |
| 43812.88888888889 | 1027.1 |
| 43812.90277777778 | 1027 |
| 43812.916666666664 | 1027 |
| 43812.930555555555 | 1026.6 |
| 43812.944444444445 | 1026.2 |
| 43812.958333333336 | 1026 |
| 43812.97222222222 | 1025.8 |
| 43812.98611111111 | 1025.3 |
| 43813.0 | 1025 |
| 43813.01388888889 | 1024.3 |
| 43813.02777777778 | 1023.9 |
| 43813.041666666664 | 1023.4 |
| 43813.055555555555 | 1023 |
| 43813.069444444445 | 1022.8 |
| 43813.083333333336 | 1022.4 |
| 43813.09722222222 | 1021.9 |
| 43813.11111111111 | 1021.4 |
| 43813.125 | 1021.2 |
| 43813.13888888889 | 1020.7 |
| 43813.15277777778 | 1020.5 |
| 43813.166666666664 | 1020.2 |
| 43813.180555555555 | 1020.1 |
| 43813.194444444445 | 1019.8 |
| 43813.208333333336 | 1019.4 |
| 43813.22222222222 | 1019 |
| 43813.23611111111 | 1018.7 |
| 43813.25 | 1018.4 |
| 43813.26388888889 | 1018 |
| 43813.27777777778 | 1017.7 |
| 43813.291666666664 | 1017.4 |
| 43813.305555555555 | 1017 |
| 43813.319444444445 | 1016.6 |
| 43813.333333333336 | 1016.2 |
| 43813.34722222222 | 1016 |
| 43813.36111111111 | 1015.6 |
| 43813.375 | 1015 |
| 43813.38888888889 | 1014.7 |
| 43813.40277777778 | 1014.1 |
| 43813.416666666664 | 1013.5 |
| 43813.430555555555 | 1013 |
| 43813.444444444445 | 1012.5 |
| 43813.458333333336 | 1011.8 |
| 43813.47222222222 | 1011.1 |
| 43813.48611111111 | 1010.4 |
| 43813.5 | 1010.1 |
| 43813.51388888889 | 1009.5 |
| 43813.52777777778 | 1008.8 |
| 43813.541666666664 | 1007.9 |
| 43813.555555555555 | 1007.1 |
| 43813.569444444445 | 1006.3 |
| 43813.583333333336 | 1005.4 |
| 43813.59722222222 | 1004.2 |
| 43813.61111111111 | 1003.6 |
| 43813.625 | 1002.9 |
| 43813.63888888889 | 1002.2 |
| 43813.65277777778 | 1001.6 |
| 43813.666666666664 | 1001 |
| 43813.680555555555 | 1000.4 |
| 43813.694444444445 | 999.8 |
| 43813.708333333336 | 999.2 |
| 43813.72222222222 | 998.8 |
| 43813.73611111111 | 998.3 |
| 43813.75 | 997.7 |
| 43813.76388888889 | 997.2 |
| 43813.77777777778 | 996.9 |
| 43813.791666666664 | 997 |
| 43813.805555555555 | 996.6 |
| 43813.819444444445 | 996.4 |
| 43813.833333333336 | 996.2 |
| 43813.84722222222 | 996.1 |
| 43813.86111111111 | 995.8 |
| 43813.875 | 995.3 |
| 43813.88888888889 | 994.8 |
| 43813.90277777778 | 994.4 |
| 43813.916666666664 | 994.3 |
| 43813.930555555555 | 994 |
| 43813.944444444445 | 994.1 |
| 43813.958333333336 | 994 |
| 43813.97222222222 | 993.6 |
| 43813.98611111111 | 993.1 |
| 43814.0 | 992.4 |
| 43814.01388888889 | 991.8 |
| 43814.02777777778 | 990.8 |
| 43814.041666666664 | 989.8 |
| 43814.055555555555 | 989.3 |
| 43814.069444444445 | 988.6 |
| 43814.083333333336 | 987.9 |
| 43814.09722222222 | 987.6 |
| 43814.11111111111 | 987.1 |
| 43814.125 | 986.8 |
| 43814.13888888889 | 986.3 |
| 43814.15277777778 | 985.6 |
| 43814.166666666664 | 985.4 |
| 43814.180555555555 | 985.5 |
| 43814.194444444445 | 985.5 |
| 43814.208333333336 | 985.8 |
| 43814.22222222222 | 986 |
| 43814.23611111111 | 986.3 |
| 43814.25 | 986.4 |
| 43814.26388888889 | 986.8 |
| 43814.27777777778 | 987 |
| 43814.291666666664 | 987.2 |
| 43814.305555555555 | 987.6 |
| 43814.319444444445 | 987.8 |
| 43814.333333333336 | 988.4 |
| 43814.34722222222 | 988.7 |
| 43814.36111111111 | 988.9 |
| 43814.375 | 989.3 |
| 43814.38888888889 | 989.7 |
| 43814.40277777778 | 990.3 |
| 43814.416666666664 | 990.6 |
| 43814.430555555555 | 991 |
| 43814.444444444445 | 991.5 |
| 43814.458333333336 | 992 |
| 43814.47222222222 | 992.5 |
| 43814.48611111111 | 992.8 |
| 43814.5 | 993 |
| 43814.51388888889 | 993.5 |
| 43814.52777777778 | 993.7 |
| 43814.541666666664 | 994.2 |
| 43814.555555555555 | 994.3 |
| 43814.569444444445 | 994.7 |
| 43814.583333333336 | 995.1 |
| 43814.59722222222 | 995.6 |
| 43814.61111111111 | 996.1 |
| 43814.625 | 996.5 |
| 43814.63888888889 | 996.9 |
| 43814.65277777778 | 997.3 |
| 43814.666666666664 | 997.6 |
| 43814.680555555555 | 998.2 |
| 43814.694444444445 | 998.5 |
| 43814.708333333336 | 999.1 |
| 43814.72222222222 | 999.4 |
| 43814.73611111111 | 999.7 |
| 43814.75 | 1000.1 |
| 43814.76388888889 | 1000.6 |
| 43814.77777777778 | 1001.3 |
| 43814.791666666664 | 1001.6 |
| 43814.805555555555 | 1001.9 |
| 43814.819444444445 | 1002.3 |
| 43814.833333333336 | 1002.6 |
| 43814.84722222222 | 1002.8 |
| 43814.86111111111 | 1002.9 |
| 43814.875 | 1003.2 |
| 43814.88888888889 | 1003.8 |
| 43814.90277777778 | 1004.3 |
| 43814.916666666664 | 1004.3 |
| 43814.930555555555 | 1004.7 |
| 43814.944444444445 | 1005 |
| 43814.958333333336 | 1005.3 |
| 43814.97222222222 | 1005.7 |
| 43814.98611111111 | 1005.9 |
| 43815.0 | 1006.1 |
| 43815.01388888889 | 1006.2 |
| 43815.02777777778 | 1006.3 |
| 43815.041666666664 | 1006.4 |
| 43815.055555555555 | 1006.6 |
| 43815.069444444445 | 1007.1 |
| 43815.083333333336 | 1007.4 |
| 43815.09722222222 | 1007.7 |
| 43815.11111111111 | 1007.9 |
| 43815.125 | 1008.3 |
| 43815.13888888889 | 1008.6 |
| 43815.15277777778 | 1009.1 |
| 43815.166666666664 | 1009.6 |
| 43815.180555555555 | 1010.1 |
| 43815.194444444445 | 1010.7 |
| 43815.208333333336 | 1011.2 |
| 43815.22222222222 | 1011.5 |
| 43815.23611111111 | 1011.9 |
| 43815.25 | 1012.3 |
| 43815.26388888889 | 1012.7 |
| 43815.27777777778 | 1013.3 |
| 43815.291666666664 | 1013.9 |
| 43815.305555555555 | 1014.5 |
| 43815.319444444445 | 1014.9 |
| 43815.333333333336 | 1015 |
| 43815.34722222222 | 1015.3 |
| 43815.36111111111 | 1015.4 |
| 43815.375 | 1015.8 |
| 43815.38888888889 | 1015.9 |
| 43815.40277777778 | 1016.2 |
| 43815.416666666664 | 1016.4 |
| 43815.430555555555 | 1016.6 |
| 43815.444444444445 | 1016.9 |
| 43815.458333333336 | 1017.3 |
| 43815.47222222222 | 1017.5 |
| 43815.48611111111 | 1017.8 |
| 43815.5 | 1018.2 |
| 43815.51388888889 | 1018.5 |
| 43815.52777777778 | 1018.4 |
| 43815.541666666664 | 1018.5 |
| 43815.555555555555 | 1018.6 |
| 43815.569444444445 | 1019 |
| 43815.583333333336 | 1019.1 |
| 43815.59722222222 | 1019.3 |
| 43815.61111111111 | 1019.3 |
| 43815.625 | 1019.5 |
| 43815.63888888889 | 1020 |
| 43815.65277777778 | 1020.2 |
| 43815.666666666664 | 1020.7 |
| 43815.680555555555 | 1020.8 |
| 43815.694444444445 | 1020.6 |
| 43815.708333333336 | 1020.7 |
| 43815.72222222222 | 1020.3 |
| 43815.73611111111 | 1020.5 |
| 43815.75 | 1020.7 |
| 43815.76388888889 | 1020.9 |
| 43815.77777777778 | 1020.8 |
| 43815.791666666664 | 1020.6 |
| 43815.805555555555 | 1021.1 |
| 43815.819444444445 | 1021.1 |
| 43815.833333333336 | 1021.1 |
| 43815.84722222222 | 1021.4 |
| 43815.86111111111 | 1021.3 |
| 43815.875 | 1021.5 |
| 43815.88888888889 | 1021.8 |
| 43815.90277777778 | 1022.1 |
| 43815.916666666664 | 1022.2 |
| 43815.930555555555 | 1022.6 |
| 43815.944444444445 | 1022.8 |
| 43815.958333333336 | 1022.9 |
| 43815.97222222222 | 1022.7 |
| 43815.98611111111 | 1022.7 |
| 43816.0 | 1022.6 |
| 43816.01388888889 | 1022.4 |
| 43816.02777777778 | 1022.1 |
| 43816.041666666664 | 1021.8 |
| 43816.055555555555 | 1021.7 |
| 43816.069444444445 | 1021.5 |
| 43816.083333333336 | 1021.2 |
| 43816.09722222222 | 1021.2 |
| 43816.11111111111 | 1021.3 |
| 43816.125 | 1021.4 |
| 43816.13888888889 | 1021.5 |
| 43816.15277777778 | 1021.2 |
| 43816.166666666664 | 1021 |
| 43816.180555555555 | 1020.8 |
| 43816.194444444445 | 1020.7 |
| 43816.208333333336 | 1020.6 |
| 43816.22222222222 | 1020.5 |
| 43816.23611111111 | 1020.5 |
| 43816.25 | 1020.4 |
| 43816.26388888889 | 1020.7 |
| 43816.27777777778 | 1020.5 |
| 43816.291666666664 | 1020.6 |
| 43816.305555555555 | 1020.4 |
| 43816.319444444445 | 1020.3 |
| 43816.333333333336 | 1020.2 |
| 43816.34722222222 | 1020.2 |
| 43816.36111111111 | 1020.1 |
| 43816.375 | 1020 |
| 43816.38888888889 | 1019.7 |
| 43816.40277777778 | 1019.4 |
| 43816.416666666664 | 1019 |
| 43816.430555555555 | 1019.1 |
| 43816.444444444445 | 1018.8 |
| 43816.458333333336 | 1018.6 |
| 43816.47222222222 | 1018.4 |
| 43816.48611111111 | 1018.2 |
| 43816.5 | 1018.2 |
| 43816.51388888889 | 1018 |
| 43816.52777777778 | 1017.5 |
| 43816.541666666664 | 1017.3 |
| 43816.555555555555 | 1016.9 |
| 43816.569444444445 | 1016.5 |
| 43816.583333333336 | 1016.3 |
| 43816.59722222222 | 1015.8 |
| 43816.61111111111 | 1015.6 |
| 43816.625 | 1015.2 |
| 43816.63888888889 | 1014.8 |
| 43816.65277777778 | 1014.2 |
| 43816.666666666664 | 1014.1 |
| 43816.680555555555 | 1013.7 |
| 43816.694444444445 | 1013.2 |
| 43816.708333333336 | 1012.8 |
| 43816.72222222222 | 1012.5 |
| 43816.73611111111 | 1012.3 |
| 43816.75 | 1011.7 |
| 43816.76388888889 | 1011.5 |
| 43816.77777777778 | 1011.4 |
| 43816.791666666664 | 1011.1 |
| 43816.805555555555 | 1010.4 |
| 43816.819444444445 | 1010.2 |
| 43816.833333333336 | 1009.7 |
| 43816.84722222222 | 1009.4 |
| 43816.86111111111 | 1009 |
| 43816.875 | 1008.7 |
| 43816.88888888889 | 1008.3 |
| 43816.90277777778 | 1008 |
| 43816.916666666664 | 1007.7 |
| 43816.930555555555 | 1007.6 |
| 43816.944444444445 | 1007.5 |
| 43816.958333333336 | 1007.3 |
| 43816.97222222222 | 1006.9 |
| 43816.98611111111 | 1006.5 |
| 43817.0 | 1005.8 |
| 43817.01388888889 | 1005.2 |
| 43817.02777777778 | 1004.9 |
| 43817.041666666664 | 1004.4 |
| 43817.055555555555 | 1003.9 |
| 43817.069444444445 | 1003.1 |
| 43817.083333333336 | 1002.7 |
| 43817.09722222222 | 1002.4 |
| 43817.11111111111 | 1002.2 |
| 43817.125 | 1002.1 |
| 43817.13888888889 | 1001.8 |
| 43817.15277777778 | 1002.9 |
| 43817.166666666664 | 1002.4 |
| 43817.180555555555 | 1002.1 |
| 43817.194444444445 | 1001.9 |
| 43817.208333333336 | 1002.1 |
| 43817.22222222222 | 1002.2 |
| 43817.23611111111 | 1002.1 |
| 43817.25 | 1002.5 |
| 43817.26388888889 | 1003 |
| 43817.27777777778 | 1002.8 |
| 43817.291666666664 | 1002.7 |
| 43817.305555555555 | 1003.1 |
| 43817.319444444445 | 1003.4 |
| 43817.333333333336 | 1003.3 |
| 43817.34722222222 | 1003.1 |
| 43817.36111111111 | 1003.3 |
| 43817.375 | 1003.2 |
| 43817.38888888889 | 1003.4 |
| 43817.40277777778 | 1003.6 |
| 43817.416666666664 | 1003.6 |
| 43817.430555555555 | 1003.6 |
| 43817.444444444445 | 1003.7 |
| 43817.458333333336 | 1004.3 |
| 43817.47222222222 | 1004.6 |
| 43817.48611111111 | 1004.9 |
| 43817.5 | 1005.2 |
| 43817.51388888889 | 1005 |
| 43817.52777777778 | 1005.1 |
| 43817.541666666664 | 1005 |
| 43817.555555555555 | 1005.5 |
| 43817.569444444445 | 1005.9 |
| 43817.583333333336 | 1006.3 |
| 43817.59722222222 | 1006.4 |
| 43817.61111111111 | 1006.6 |
| 43817.625 | 1006.7 |
| 43817.63888888889 | 1006.9 |
| 43817.65277777778 | 1007 |
| 43817.666666666664 | 1007.2 |
| 43817.680555555555 | 1007.3 |
| 43817.694444444445 | 1007.4 |
| 43817.708333333336 | 1007.3 |
| 43817.72222222222 | 1007.4 |
| 43817.73611111111 | 1007.6 |
| 43817.75 | 1007.8 |
| 43817.76388888889 | 1008.1 |
| 43817.77777777778 | 1008.3 |
| 43817.791666666664 | 1009.2 |
| 43817.805555555555 | 1004.9 |
| 43817.819444444445 | 1006.4 |
| 43817.833333333336 | 1007 |
| 43817.84722222222 | 1005.2 |
| 43817.86111111111 | 1005.7 |
| 43817.875 | 999.3 |
| 43817.88888888889 | 999.6 |
| 43817.90277777778 | 1001.4 |
| 43817.916666666664 | 1001.5 |
| 43817.930555555555 | 1002.7 |
| 43817.944444444445 | 1002.7 |
| 43817.958333333336 | 1002.6 |
| 43817.97222222222 | 1002.4 |
| 43817.98611111111 | 1002.2 |
| 43818.0 | 1002 |